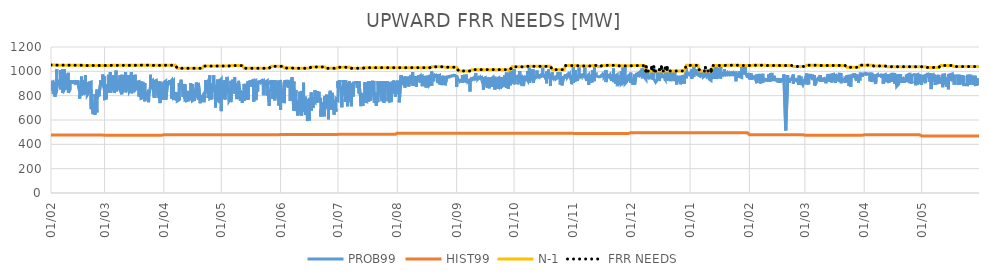
| Category | PROB99 | HIST99 | N-1 | FRR NEEDS |
|---|---|---|---|---|
| 2019-02-01 | 838 | 476 | 1052 | 1052 |
| 2019-02-01 | 840 | 476 | 1052 | 1052 |
| 2019-02-01 | 923 | 476 | 1052 | 1052 |
| 2019-02-01 | 928 | 476 | 1052 | 1052 |
| 2019-02-01 | 905 | 476 | 1052 | 1052 |
| 2019-02-01 | 906 | 476 | 1052 | 1052 |
| 2019-02-02 | 913 | 476 | 1052 | 1052 |
| 2019-02-02 | 920 | 476 | 1052 | 1052 |
| 2019-02-02 | 898 | 476 | 1052 | 1052 |
| 2019-02-02 | 852 | 476 | 1052 | 1052 |
| 2019-02-02 | 827 | 476 | 1052 | 1052 |
| 2019-02-02 | 828 | 476 | 1052 | 1052 |
| 2019-02-03 | 833 | 476 | 1052 | 1052 |
| 2019-02-03 | 827 | 476 | 1052 | 1052 |
| 2019-02-03 | 901 | 476 | 1052 | 1052 |
| 2019-02-03 | 847 | 476 | 1052 | 1052 |
| 2019-02-03 | 913 | 476 | 1052 | 1052 |
| 2019-02-03 | 792 | 476 | 1052 | 1052 |
| 2019-02-04 | 845 | 476 | 1051 | 1051 |
| 2019-02-04 | 975 | 476 | 1051 | 1051 |
| 2019-02-04 | 1017 | 476 | 1051 | 1051 |
| 2019-02-04 | 973 | 476 | 1051 | 1051 |
| 2019-02-04 | 964 | 476 | 1051 | 1051 |
| 2019-02-04 | 908 | 476 | 1051 | 1051 |
| 2019-02-05 | 918 | 476 | 1051 | 1051 |
| 2019-02-05 | 918 | 476 | 1051 | 1051 |
| 2019-02-05 | 926 | 476 | 1051 | 1051 |
| 2019-02-05 | 931 | 476 | 1051 | 1051 |
| 2019-02-05 | 928 | 476 | 1051 | 1051 |
| 2019-02-05 | 910 | 476 | 1051 | 1051 |
| 2019-02-06 | 852 | 476 | 1051 | 1051 |
| 2019-02-06 | 1001 | 476 | 1051 | 1051 |
| 2019-02-06 | 1010 | 476 | 1051 | 1051 |
| 2019-02-06 | 976 | 476 | 1051 | 1051 |
| 2019-02-06 | 929 | 476 | 1051 | 1051 |
| 2019-02-06 | 911 | 476 | 1051 | 1051 |
| 2019-02-07 | 926 | 476 | 1051 | 1051 |
| 2019-02-07 | 1009 | 476 | 1051 | 1051 |
| 2019-02-07 | 1019 | 476 | 1051 | 1051 |
| 2019-02-07 | 1019 | 476 | 1051 | 1051 |
| 2019-02-07 | 944 | 476 | 1051 | 1051 |
| 2019-02-07 | 822 | 476 | 1051 | 1051 |
| 2019-02-08 | 854 | 476 | 1051 | 1051 |
| 2019-02-08 | 964 | 476 | 1051 | 1051 |
| 2019-02-08 | 975 | 476 | 1051 | 1051 |
| 2019-02-08 | 1018 | 476 | 1051 | 1051 |
| 2019-02-08 | 964 | 476 | 1051 | 1051 |
| 2019-02-08 | 970 | 476 | 1051 | 1051 |
| 2019-02-09 | 857 | 476 | 1051 | 1051 |
| 2019-02-09 | 959 | 476 | 1051 | 1051 |
| 2019-02-09 | 978 | 476 | 1051 | 1051 |
| 2019-02-09 | 976 | 476 | 1051 | 1051 |
| 2019-02-09 | 900 | 476 | 1051 | 1051 |
| 2019-02-09 | 860 | 476 | 1051 | 1051 |
| 2019-02-10 | 858 | 476 | 1051 | 1051 |
| 2019-02-10 | 960 | 476 | 1051 | 1051 |
| 2019-02-10 | 988 | 476 | 1051 | 1051 |
| 2019-02-10 | 974 | 476 | 1051 | 1051 |
| 2019-02-10 | 921 | 476 | 1051 | 1051 |
| 2019-02-10 | 824 | 476 | 1051 | 1051 |
| 2019-02-11 | 853 | 476 | 1050 | 1050 |
| 2019-02-11 | 900 | 476 | 1050 | 1050 |
| 2019-02-11 | 927 | 476 | 1050 | 1050 |
| 2019-02-11 | 932 | 476 | 1050 | 1050 |
| 2019-02-11 | 930 | 476 | 1050 | 1050 |
| 2019-02-11 | 907 | 476 | 1050 | 1050 |
| 2019-02-12 | 911 | 476 | 1050 | 1050 |
| 2019-02-12 | 899 | 476 | 1050 | 1050 |
| 2019-02-12 | 925 | 476 | 1050 | 1050 |
| 2019-02-12 | 931 | 476 | 1050 | 1050 |
| 2019-02-12 | 923 | 476 | 1050 | 1050 |
| 2019-02-12 | 908 | 476 | 1050 | 1050 |
| 2019-02-13 | 907 | 476 | 1050 | 1050 |
| 2019-02-13 | 909 | 476 | 1050 | 1050 |
| 2019-02-13 | 923 | 476 | 1050 | 1050 |
| 2019-02-13 | 923 | 476 | 1050 | 1050 |
| 2019-02-13 | 912 | 476 | 1050 | 1050 |
| 2019-02-13 | 908 | 476 | 1050 | 1050 |
| 2019-02-14 | 910 | 476 | 1050 | 1050 |
| 2019-02-14 | 899 | 476 | 1050 | 1050 |
| 2019-02-14 | 920 | 476 | 1050 | 1050 |
| 2019-02-14 | 929 | 476 | 1050 | 1050 |
| 2019-02-14 | 903 | 476 | 1050 | 1050 |
| 2019-02-14 | 907 | 476 | 1050 | 1050 |
| 2019-02-15 | 911 | 476 | 1050 | 1050 |
| 2019-02-15 | 900 | 476 | 1050 | 1050 |
| 2019-02-15 | 925 | 476 | 1050 | 1050 |
| 2019-02-15 | 928 | 476 | 1050 | 1050 |
| 2019-02-15 | 899 | 476 | 1050 | 1050 |
| 2019-02-15 | 909 | 476 | 1050 | 1050 |
| 2019-02-16 | 832 | 476 | 1050 | 1050 |
| 2019-02-16 | 866 | 476 | 1050 | 1050 |
| 2019-02-16 | 834 | 476 | 1050 | 1050 |
| 2019-02-16 | 841 | 476 | 1050 | 1050 |
| 2019-02-16 | 776 | 476 | 1050 | 1050 |
| 2019-02-16 | 803 | 476 | 1050 | 1050 |
| 2019-02-17 | 835 | 476 | 1050 | 1050 |
| 2019-02-17 | 861 | 476 | 1050 | 1050 |
| 2019-02-17 | 958 | 476 | 1050 | 1050 |
| 2019-02-17 | 903 | 476 | 1050 | 1050 |
| 2019-02-17 | 801 | 476 | 1050 | 1050 |
| 2019-02-17 | 811 | 476 | 1050 | 1050 |
| 2019-02-18 | 841 | 476 | 1048 | 1048 |
| 2019-02-18 | 905 | 476 | 1048 | 1048 |
| 2019-02-18 | 912 | 476 | 1048 | 1048 |
| 2019-02-18 | 929 | 476 | 1048 | 1048 |
| 2019-02-18 | 908 | 476 | 1048 | 1048 |
| 2019-02-18 | 808 | 476 | 1048 | 1048 |
| 2019-02-19 | 838 | 476 | 1048 | 1048 |
| 2019-02-19 | 968 | 476 | 1048 | 1048 |
| 2019-02-19 | 972 | 476 | 1048 | 1048 |
| 2019-02-19 | 927 | 476 | 1048 | 1048 |
| 2019-02-19 | 915 | 476 | 1048 | 1048 |
| 2019-02-19 | 911 | 476 | 1048 | 1048 |
| 2019-02-20 | 833 | 476 | 1048 | 1048 |
| 2019-02-20 | 907 | 476 | 1048 | 1048 |
| 2019-02-20 | 910 | 476 | 1048 | 1048 |
| 2019-02-20 | 914 | 476 | 1048 | 1048 |
| 2019-02-20 | 908 | 476 | 1048 | 1048 |
| 2019-02-20 | 806 | 476 | 1048 | 1048 |
| 2019-02-21 | 831 | 476 | 1048 | 1048 |
| 2019-02-21 | 904 | 476 | 1048 | 1048 |
| 2019-02-21 | 913 | 476 | 1048 | 1048 |
| 2019-02-21 | 834 | 476 | 1048 | 1048 |
| 2019-02-21 | 906 | 476 | 1048 | 1048 |
| 2019-02-21 | 910 | 476 | 1048 | 1048 |
| 2019-02-22 | 912 | 476 | 1048 | 1048 |
| 2019-02-22 | 831 | 476 | 1048 | 1048 |
| 2019-02-22 | 847 | 476 | 1048 | 1048 |
| 2019-02-22 | 713 | 476 | 1048 | 1048 |
| 2019-02-22 | 689 | 476 | 1048 | 1048 |
| 2019-02-22 | 806 | 476 | 1048 | 1048 |
| 2019-02-23 | 664 | 476 | 1048 | 1048 |
| 2019-02-23 | 648 | 476 | 1048 | 1048 |
| 2019-02-23 | 733 | 476 | 1048 | 1048 |
| 2019-02-23 | 712 | 476 | 1048 | 1048 |
| 2019-02-23 | 687 | 476 | 1048 | 1048 |
| 2019-02-23 | 673 | 476 | 1048 | 1048 |
| 2019-02-24 | 669 | 476 | 1048 | 1048 |
| 2019-02-24 | 644 | 476 | 1048 | 1048 |
| 2019-02-24 | 695 | 476 | 1048 | 1048 |
| 2019-02-24 | 714 | 476 | 1048 | 1048 |
| 2019-02-24 | 683 | 476 | 1048 | 1048 |
| 2019-02-24 | 813 | 476 | 1048 | 1048 |
| 2019-02-25 | 663 | 476 | 1048 | 1048 |
| 2019-02-25 | 837 | 476 | 1048 | 1048 |
| 2019-02-25 | 831 | 476 | 1048 | 1048 |
| 2019-02-25 | 850 | 476 | 1048 | 1048 |
| 2019-02-25 | 776 | 476 | 1048 | 1048 |
| 2019-02-25 | 798 | 476 | 1048 | 1048 |
| 2019-02-26 | 803 | 476 | 1048 | 1048 |
| 2019-02-26 | 835 | 476 | 1048 | 1048 |
| 2019-02-26 | 835 | 476 | 1048 | 1048 |
| 2019-02-26 | 846 | 476 | 1048 | 1048 |
| 2019-02-26 | 796 | 476 | 1048 | 1048 |
| 2019-02-26 | 803 | 476 | 1048 | 1048 |
| 2019-02-27 | 914 | 476 | 1048 | 1048 |
| 2019-02-27 | 921 | 476 | 1048 | 1048 |
| 2019-02-27 | 926 | 476 | 1048 | 1048 |
| 2019-02-27 | 928 | 476 | 1048 | 1048 |
| 2019-02-27 | 915 | 476 | 1048 | 1048 |
| 2019-02-27 | 912 | 476 | 1048 | 1048 |
| 2019-02-28 | 919 | 476 | 1048 | 1048 |
| 2019-02-28 | 907 | 476 | 1048 | 1048 |
| 2019-02-28 | 973 | 476 | 1048 | 1048 |
| 2019-02-28 | 974 | 476 | 1048 | 1048 |
| 2019-02-28 | 905 | 476 | 1048 | 1048 |
| 2019-02-28 | 910 | 476 | 1048 | 1048 |
| 2019-03-01 | 840 | 475 | 1048 | 1048 |
| 2019-03-01 | 906 | 475 | 1048 | 1048 |
| 2019-03-01 | 961 | 475 | 1048 | 1048 |
| 2019-03-01 | 926 | 475 | 1048 | 1048 |
| 2019-03-01 | 914 | 475 | 1048 | 1048 |
| 2019-03-01 | 774 | 475 | 1048 | 1048 |
| 2019-03-02 | 779 | 475 | 1048 | 1048 |
| 2019-03-02 | 776 | 475 | 1048 | 1048 |
| 2019-03-02 | 895 | 475 | 1048 | 1048 |
| 2019-03-02 | 855 | 475 | 1048 | 1048 |
| 2019-03-02 | 844 | 475 | 1048 | 1048 |
| 2019-03-02 | 831 | 475 | 1048 | 1048 |
| 2019-03-03 | 869 | 475 | 1048 | 1048 |
| 2019-03-03 | 912 | 475 | 1048 | 1048 |
| 2019-03-03 | 972 | 475 | 1048 | 1048 |
| 2019-03-03 | 968 | 475 | 1048 | 1048 |
| 2019-03-03 | 890 | 475 | 1048 | 1048 |
| 2019-03-03 | 826 | 475 | 1048 | 1048 |
| 2019-03-04 | 864 | 475 | 1049 | 1049 |
| 2019-03-04 | 994 | 475 | 1049 | 1049 |
| 2019-03-04 | 968 | 475 | 1049 | 1049 |
| 2019-03-04 | 968 | 475 | 1049 | 1049 |
| 2019-03-04 | 871 | 475 | 1049 | 1049 |
| 2019-03-04 | 826 | 475 | 1049 | 1049 |
| 2019-03-05 | 865 | 475 | 1049 | 1049 |
| 2019-03-05 | 966 | 475 | 1049 | 1049 |
| 2019-03-05 | 970 | 475 | 1049 | 1049 |
| 2019-03-05 | 970 | 475 | 1049 | 1049 |
| 2019-03-05 | 918 | 475 | 1049 | 1049 |
| 2019-03-05 | 914 | 475 | 1049 | 1049 |
| 2019-03-06 | 870 | 475 | 1049 | 1049 |
| 2019-03-06 | 967 | 475 | 1049 | 1049 |
| 2019-03-06 | 967 | 475 | 1049 | 1049 |
| 2019-03-06 | 911 | 475 | 1049 | 1049 |
| 2019-03-06 | 878 | 475 | 1049 | 1049 |
| 2019-03-06 | 823 | 475 | 1049 | 1049 |
| 2019-03-07 | 871 | 475 | 1049 | 1049 |
| 2019-03-07 | 1006 | 475 | 1049 | 1049 |
| 2019-03-07 | 1006 | 475 | 1049 | 1049 |
| 2019-03-07 | 913 | 475 | 1049 | 1049 |
| 2019-03-07 | 893 | 475 | 1049 | 1049 |
| 2019-03-07 | 837 | 475 | 1049 | 1049 |
| 2019-03-08 | 867 | 475 | 1049 | 1049 |
| 2019-03-08 | 932 | 475 | 1049 | 1049 |
| 2019-03-08 | 909 | 475 | 1049 | 1049 |
| 2019-03-08 | 914 | 475 | 1049 | 1049 |
| 2019-03-08 | 853 | 475 | 1049 | 1049 |
| 2019-03-08 | 862 | 475 | 1049 | 1049 |
| 2019-03-09 | 866 | 475 | 1049 | 1049 |
| 2019-03-09 | 953 | 475 | 1049 | 1049 |
| 2019-03-09 | 967 | 475 | 1049 | 1049 |
| 2019-03-09 | 966 | 475 | 1049 | 1049 |
| 2019-03-09 | 849 | 475 | 1049 | 1049 |
| 2019-03-09 | 846 | 475 | 1049 | 1049 |
| 2019-03-10 | 811 | 475 | 1049 | 1049 |
| 2019-03-10 | 909 | 475 | 1049 | 1049 |
| 2019-03-10 | 972 | 475 | 1049 | 1049 |
| 2019-03-10 | 967 | 475 | 1049 | 1049 |
| 2019-03-10 | 910 | 475 | 1049 | 1049 |
| 2019-03-10 | 823 | 475 | 1049 | 1049 |
| 2019-03-11 | 870 | 475 | 1049 | 1049 |
| 2019-03-11 | 967 | 475 | 1049 | 1049 |
| 2019-03-11 | 969 | 475 | 1049 | 1049 |
| 2019-03-11 | 970 | 475 | 1049 | 1049 |
| 2019-03-11 | 916 | 475 | 1049 | 1049 |
| 2019-03-11 | 909 | 475 | 1049 | 1049 |
| 2019-03-12 | 909 | 475 | 1049 | 1049 |
| 2019-03-12 | 993 | 475 | 1049 | 1049 |
| 2019-03-12 | 967 | 475 | 1049 | 1049 |
| 2019-03-12 | 966 | 475 | 1049 | 1049 |
| 2019-03-12 | 907 | 475 | 1049 | 1049 |
| 2019-03-12 | 827 | 475 | 1049 | 1049 |
| 2019-03-13 | 877 | 475 | 1049 | 1049 |
| 2019-03-13 | 968 | 475 | 1049 | 1049 |
| 2019-03-13 | 967 | 475 | 1049 | 1049 |
| 2019-03-13 | 966 | 475 | 1049 | 1049 |
| 2019-03-13 | 895 | 475 | 1049 | 1049 |
| 2019-03-13 | 916 | 475 | 1049 | 1049 |
| 2019-03-14 | 874 | 475 | 1049 | 1049 |
| 2019-03-14 | 969 | 475 | 1049 | 1049 |
| 2019-03-14 | 969 | 475 | 1049 | 1049 |
| 2019-03-14 | 966 | 475 | 1049 | 1049 |
| 2019-03-14 | 890 | 475 | 1049 | 1049 |
| 2019-03-14 | 835 | 475 | 1049 | 1049 |
| 2019-03-15 | 861 | 475 | 1049 | 1049 |
| 2019-03-15 | 992 | 475 | 1049 | 1049 |
| 2019-03-15 | 967 | 475 | 1049 | 1049 |
| 2019-03-15 | 966 | 475 | 1049 | 1049 |
| 2019-03-15 | 894 | 475 | 1049 | 1049 |
| 2019-03-15 | 820 | 475 | 1049 | 1049 |
| 2019-03-16 | 855 | 475 | 1049 | 1049 |
| 2019-03-16 | 968 | 475 | 1049 | 1049 |
| 2019-03-16 | 970 | 475 | 1049 | 1049 |
| 2019-03-16 | 968 | 475 | 1049 | 1049 |
| 2019-03-16 | 897 | 475 | 1049 | 1049 |
| 2019-03-16 | 852 | 475 | 1049 | 1049 |
| 2019-03-17 | 872 | 475 | 1049 | 1049 |
| 2019-03-17 | 925 | 475 | 1049 | 1049 |
| 2019-03-17 | 972 | 475 | 1049 | 1049 |
| 2019-03-17 | 951 | 475 | 1049 | 1049 |
| 2019-03-17 | 859 | 475 | 1049 | 1049 |
| 2019-03-17 | 847 | 475 | 1049 | 1049 |
| 2019-03-18 | 865 | 475 | 1051 | 1051 |
| 2019-03-18 | 907 | 475 | 1051 | 1051 |
| 2019-03-18 | 915 | 475 | 1051 | 1051 |
| 2019-03-18 | 849 | 475 | 1051 | 1051 |
| 2019-03-18 | 890 | 475 | 1051 | 1051 |
| 2019-03-18 | 912 | 475 | 1051 | 1051 |
| 2019-03-19 | 916 | 475 | 1051 | 1051 |
| 2019-03-19 | 917 | 475 | 1051 | 1051 |
| 2019-03-19 | 913 | 475 | 1051 | 1051 |
| 2019-03-19 | 837 | 475 | 1051 | 1051 |
| 2019-03-19 | 793 | 475 | 1051 | 1051 |
| 2019-03-19 | 914 | 475 | 1051 | 1051 |
| 2019-03-20 | 788 | 475 | 1051 | 1051 |
| 2019-03-20 | 917 | 475 | 1051 | 1051 |
| 2019-03-20 | 835 | 475 | 1051 | 1051 |
| 2019-03-20 | 834 | 475 | 1051 | 1051 |
| 2019-03-20 | 777 | 475 | 1051 | 1051 |
| 2019-03-20 | 784 | 475 | 1051 | 1051 |
| 2019-03-21 | 783 | 475 | 1051 | 1051 |
| 2019-03-21 | 905 | 475 | 1051 | 1051 |
| 2019-03-21 | 841 | 475 | 1051 | 1051 |
| 2019-03-21 | 839 | 475 | 1051 | 1051 |
| 2019-03-21 | 876 | 475 | 1051 | 1051 |
| 2019-03-21 | 913 | 475 | 1051 | 1051 |
| 2019-03-22 | 781 | 475 | 1051 | 1051 |
| 2019-03-22 | 904 | 475 | 1051 | 1051 |
| 2019-03-22 | 827 | 475 | 1051 | 1051 |
| 2019-03-22 | 837 | 475 | 1051 | 1051 |
| 2019-03-22 | 754 | 475 | 1051 | 1051 |
| 2019-03-22 | 785 | 475 | 1051 | 1051 |
| 2019-03-23 | 783 | 475 | 1051 | 1051 |
| 2019-03-23 | 769 | 475 | 1051 | 1051 |
| 2019-03-23 | 826 | 475 | 1051 | 1051 |
| 2019-03-23 | 822 | 475 | 1051 | 1051 |
| 2019-03-23 | 768 | 475 | 1051 | 1051 |
| 2019-03-23 | 780 | 475 | 1051 | 1051 |
| 2019-03-24 | 786 | 475 | 1051 | 1051 |
| 2019-03-24 | 746 | 475 | 1051 | 1051 |
| 2019-03-24 | 801 | 475 | 1051 | 1051 |
| 2019-03-24 | 849 | 475 | 1051 | 1051 |
| 2019-03-24 | 766 | 475 | 1051 | 1051 |
| 2019-03-24 | 786 | 475 | 1051 | 1051 |
| 2019-03-25 | 874 | 475 | 1049 | 1049 |
| 2019-03-25 | 947 | 475 | 1049 | 1049 |
| 2019-03-25 | 972 | 475 | 1049 | 1049 |
| 2019-03-25 | 954 | 475 | 1049 | 1049 |
| 2019-03-25 | 855 | 475 | 1049 | 1049 |
| 2019-03-25 | 911 | 475 | 1049 | 1049 |
| 2019-03-26 | 924 | 475 | 1049 | 1049 |
| 2019-03-26 | 923 | 475 | 1049 | 1049 |
| 2019-03-26 | 906 | 475 | 1049 | 1049 |
| 2019-03-26 | 919 | 475 | 1049 | 1049 |
| 2019-03-26 | 916 | 475 | 1049 | 1049 |
| 2019-03-26 | 913 | 475 | 1049 | 1049 |
| 2019-03-27 | 783 | 475 | 1049 | 1049 |
| 2019-03-27 | 917 | 475 | 1049 | 1049 |
| 2019-03-27 | 911 | 475 | 1049 | 1049 |
| 2019-03-27 | 923 | 475 | 1049 | 1049 |
| 2019-03-27 | 915 | 475 | 1049 | 1049 |
| 2019-03-27 | 912 | 475 | 1049 | 1049 |
| 2019-03-28 | 925 | 475 | 1049 | 1049 |
| 2019-03-28 | 923 | 475 | 1049 | 1049 |
| 2019-03-28 | 910 | 475 | 1049 | 1049 |
| 2019-03-28 | 924 | 475 | 1049 | 1049 |
| 2019-03-28 | 913 | 475 | 1049 | 1049 |
| 2019-03-28 | 913 | 475 | 1049 | 1049 |
| 2019-03-29 | 782 | 475 | 1049 | 1049 |
| 2019-03-29 | 917 | 475 | 1049 | 1049 |
| 2019-03-29 | 841 | 475 | 1049 | 1049 |
| 2019-03-29 | 840 | 475 | 1049 | 1049 |
| 2019-03-29 | 873 | 475 | 1049 | 1049 |
| 2019-03-29 | 913 | 475 | 1049 | 1049 |
| 2019-03-30 | 777 | 475 | 1049 | 1049 |
| 2019-03-30 | 767 | 475 | 1049 | 1049 |
| 2019-03-30 | 826 | 475 | 1049 | 1049 |
| 2019-03-30 | 823 | 475 | 1049 | 1049 |
| 2019-03-30 | 739 | 475 | 1049 | 1049 |
| 2019-03-30 | 915 | 475 | 1049 | 1049 |
| 2019-03-31 | 768 | 475 | 1049 | 1049 |
| 2019-03-31 | 847 | 475 | 1049 | 1049 |
| 2019-03-31 | 843 | 475 | 1049 | 1049 |
| 2019-03-31 | 847 | 475 | 1049 | 1049 |
| 2019-03-31 | 852 | 475 | 1049 | 1049 |
| 2019-03-31 | 834 | 475 | 1049 | 1049 |
| 2019-04-01 | 872 | 479 | 1050 | 1050 |
| 2019-04-01 | 906 | 479 | 1050 | 1050 |
| 2019-04-01 | 901 | 479 | 1050 | 1050 |
| 2019-04-01 | 834 | 479 | 1050 | 1050 |
| 2019-04-01 | 769 | 479 | 1050 | 1050 |
| 2019-04-01 | 910 | 479 | 1050 | 1050 |
| 2019-04-02 | 921 | 479 | 1050 | 1050 |
| 2019-04-02 | 919 | 479 | 1050 | 1050 |
| 2019-04-02 | 905 | 479 | 1050 | 1050 |
| 2019-04-02 | 852 | 479 | 1050 | 1050 |
| 2019-04-02 | 912 | 479 | 1050 | 1050 |
| 2019-04-02 | 768 | 479 | 1050 | 1050 |
| 2019-04-03 | 914 | 479 | 1050 | 1050 |
| 2019-04-03 | 916 | 479 | 1050 | 1050 |
| 2019-04-03 | 904 | 479 | 1050 | 1050 |
| 2019-04-03 | 918 | 479 | 1050 | 1050 |
| 2019-04-03 | 915 | 479 | 1050 | 1050 |
| 2019-04-03 | 906 | 479 | 1050 | 1050 |
| 2019-04-04 | 913 | 479 | 1050 | 1050 |
| 2019-04-04 | 916 | 479 | 1050 | 1050 |
| 2019-04-04 | 899 | 479 | 1050 | 1050 |
| 2019-04-04 | 929 | 479 | 1050 | 1050 |
| 2019-04-04 | 921 | 479 | 1050 | 1050 |
| 2019-04-04 | 905 | 479 | 1050 | 1050 |
| 2019-04-05 | 925 | 479 | 1050 | 1050 |
| 2019-04-05 | 923 | 479 | 1050 | 1050 |
| 2019-04-05 | 907 | 479 | 1050 | 1050 |
| 2019-04-05 | 851 | 479 | 1050 | 1050 |
| 2019-04-05 | 775 | 479 | 1050 | 1050 |
| 2019-04-05 | 910 | 479 | 1050 | 1050 |
| 2019-04-06 | 925 | 479 | 1050 | 1050 |
| 2019-04-06 | 927 | 479 | 1050 | 1050 |
| 2019-04-06 | 808 | 479 | 1050 | 1050 |
| 2019-04-06 | 833 | 479 | 1050 | 1050 |
| 2019-04-06 | 778 | 479 | 1050 | 1050 |
| 2019-04-06 | 783 | 479 | 1050 | 1050 |
| 2019-04-07 | 786 | 479 | 1050 | 1050 |
| 2019-04-07 | 768 | 479 | 1050 | 1050 |
| 2019-04-07 | 789 | 479 | 1050 | 1050 |
| 2019-04-07 | 831 | 479 | 1050 | 1050 |
| 2019-04-07 | 773 | 479 | 1050 | 1050 |
| 2019-04-07 | 773 | 479 | 1050 | 1050 |
| 2019-04-08 | 765 | 479 | 1025 | 1025 |
| 2019-04-08 | 780 | 479 | 1025 | 1025 |
| 2019-04-08 | 804 | 479 | 1025 | 1025 |
| 2019-04-08 | 828 | 479 | 1025 | 1025 |
| 2019-04-08 | 757 | 479 | 1025 | 1025 |
| 2019-04-08 | 757 | 479 | 1025 | 1025 |
| 2019-04-09 | 767 | 479 | 1025 | 1025 |
| 2019-04-09 | 789 | 479 | 1025 | 1025 |
| 2019-04-09 | 788 | 479 | 1025 | 1025 |
| 2019-04-09 | 797 | 479 | 1025 | 1025 |
| 2019-04-09 | 764 | 479 | 1025 | 1025 |
| 2019-04-09 | 903 | 479 | 1025 | 1025 |
| 2019-04-10 | 853 | 479 | 1025 | 1025 |
| 2019-04-10 | 913 | 479 | 1025 | 1025 |
| 2019-04-10 | 931 | 479 | 1025 | 1025 |
| 2019-04-10 | 927 | 479 | 1025 | 1025 |
| 2019-04-10 | 870 | 479 | 1025 | 1025 |
| 2019-04-10 | 905 | 479 | 1025 | 1025 |
| 2019-04-11 | 834 | 479 | 1025 | 1025 |
| 2019-04-11 | 890 | 479 | 1025 | 1025 |
| 2019-04-11 | 884 | 479 | 1025 | 1025 |
| 2019-04-11 | 808 | 479 | 1025 | 1025 |
| 2019-04-11 | 790 | 479 | 1025 | 1025 |
| 2019-04-11 | 896 | 479 | 1025 | 1025 |
| 2019-04-12 | 774 | 479 | 1025 | 1025 |
| 2019-04-12 | 893 | 479 | 1025 | 1025 |
| 2019-04-12 | 830 | 479 | 1025 | 1025 |
| 2019-04-12 | 838 | 479 | 1025 | 1025 |
| 2019-04-12 | 812 | 479 | 1025 | 1025 |
| 2019-04-12 | 763 | 479 | 1025 | 1025 |
| 2019-04-13 | 767 | 479 | 1025 | 1025 |
| 2019-04-13 | 755 | 479 | 1025 | 1025 |
| 2019-04-13 | 803 | 479 | 1025 | 1025 |
| 2019-04-13 | 840 | 479 | 1025 | 1025 |
| 2019-04-13 | 770 | 479 | 1025 | 1025 |
| 2019-04-13 | 761 | 479 | 1025 | 1025 |
| 2019-04-14 | 772 | 479 | 1025 | 1025 |
| 2019-04-14 | 754 | 479 | 1025 | 1025 |
| 2019-04-14 | 796 | 479 | 1025 | 1025 |
| 2019-04-14 | 837 | 479 | 1025 | 1025 |
| 2019-04-14 | 783 | 479 | 1025 | 1025 |
| 2019-04-14 | 771 | 479 | 1025 | 1025 |
| 2019-04-15 | 776 | 479 | 1025 | 1025 |
| 2019-04-15 | 904 | 479 | 1025 | 1025 |
| 2019-04-15 | 895 | 479 | 1025 | 1025 |
| 2019-04-15 | 837 | 479 | 1025 | 1025 |
| 2019-04-15 | 774 | 479 | 1025 | 1025 |
| 2019-04-15 | 810 | 479 | 1025 | 1025 |
| 2019-04-16 | 842 | 479 | 1025 | 1025 |
| 2019-04-16 | 894 | 479 | 1025 | 1025 |
| 2019-04-16 | 893 | 479 | 1025 | 1025 |
| 2019-04-16 | 832 | 479 | 1025 | 1025 |
| 2019-04-16 | 759 | 479 | 1025 | 1025 |
| 2019-04-16 | 761 | 479 | 1025 | 1025 |
| 2019-04-17 | 770 | 479 | 1025 | 1025 |
| 2019-04-17 | 759 | 479 | 1025 | 1025 |
| 2019-04-17 | 814 | 479 | 1025 | 1025 |
| 2019-04-17 | 819 | 479 | 1025 | 1025 |
| 2019-04-17 | 760 | 479 | 1025 | 1025 |
| 2019-04-17 | 770 | 479 | 1025 | 1025 |
| 2019-04-18 | 908 | 479 | 1025 | 1025 |
| 2019-04-18 | 810 | 479 | 1025 | 1025 |
| 2019-04-18 | 809 | 479 | 1025 | 1025 |
| 2019-04-18 | 844 | 479 | 1025 | 1025 |
| 2019-04-18 | 833 | 479 | 1025 | 1025 |
| 2019-04-18 | 804 | 479 | 1025 | 1025 |
| 2019-04-19 | 829 | 479 | 1025 | 1025 |
| 2019-04-19 | 886 | 479 | 1025 | 1025 |
| 2019-04-19 | 805 | 479 | 1025 | 1025 |
| 2019-04-19 | 808 | 479 | 1025 | 1025 |
| 2019-04-19 | 767 | 479 | 1025 | 1025 |
| 2019-04-19 | 905 | 479 | 1025 | 1025 |
| 2019-04-20 | 765 | 479 | 1025 | 1025 |
| 2019-04-20 | 738 | 479 | 1025 | 1025 |
| 2019-04-20 | 802 | 479 | 1025 | 1025 |
| 2019-04-20 | 807 | 479 | 1025 | 1025 |
| 2019-04-20 | 761 | 479 | 1025 | 1025 |
| 2019-04-20 | 764 | 479 | 1025 | 1025 |
| 2019-04-21 | 772 | 479 | 1025 | 1025 |
| 2019-04-21 | 762 | 479 | 1025 | 1025 |
| 2019-04-21 | 804 | 479 | 1025 | 1025 |
| 2019-04-21 | 807 | 479 | 1025 | 1025 |
| 2019-04-21 | 764 | 479 | 1025 | 1025 |
| 2019-04-21 | 765 | 479 | 1025 | 1025 |
| 2019-04-22 | 777 | 479 | 1043 | 1043 |
| 2019-04-22 | 746 | 479 | 1043 | 1043 |
| 2019-04-22 | 790 | 479 | 1043 | 1043 |
| 2019-04-22 | 823 | 479 | 1043 | 1043 |
| 2019-04-22 | 772 | 479 | 1043 | 1043 |
| 2019-04-22 | 813 | 479 | 1043 | 1043 |
| 2019-04-23 | 852 | 479 | 1043 | 1043 |
| 2019-04-23 | 896 | 479 | 1043 | 1043 |
| 2019-04-23 | 818 | 479 | 1043 | 1043 |
| 2019-04-23 | 928 | 479 | 1043 | 1043 |
| 2019-04-23 | 891 | 479 | 1043 | 1043 |
| 2019-04-23 | 884 | 479 | 1043 | 1043 |
| 2019-04-24 | 918 | 479 | 1043 | 1043 |
| 2019-04-24 | 904 | 479 | 1043 | 1043 |
| 2019-04-24 | 858 | 479 | 1043 | 1043 |
| 2019-04-24 | 862 | 479 | 1043 | 1043 |
| 2019-04-24 | 851 | 479 | 1043 | 1043 |
| 2019-04-24 | 780 | 479 | 1043 | 1043 |
| 2019-04-25 | 848 | 479 | 1043 | 1043 |
| 2019-04-25 | 909 | 479 | 1043 | 1043 |
| 2019-04-25 | 967 | 479 | 1043 | 1043 |
| 2019-04-25 | 940 | 479 | 1043 | 1043 |
| 2019-04-25 | 929 | 479 | 1043 | 1043 |
| 2019-04-25 | 775 | 479 | 1043 | 1043 |
| 2019-04-26 | 784 | 479 | 1043 | 1043 |
| 2019-04-26 | 903 | 479 | 1043 | 1043 |
| 2019-04-26 | 828 | 479 | 1043 | 1043 |
| 2019-04-26 | 835 | 479 | 1043 | 1043 |
| 2019-04-26 | 770 | 479 | 1043 | 1043 |
| 2019-04-26 | 815 | 479 | 1043 | 1043 |
| 2019-04-27 | 870 | 479 | 1043 | 1043 |
| 2019-04-27 | 877 | 479 | 1043 | 1043 |
| 2019-04-27 | 967 | 479 | 1043 | 1043 |
| 2019-04-27 | 966 | 479 | 1043 | 1043 |
| 2019-04-27 | 898 | 479 | 1043 | 1043 |
| 2019-04-27 | 863 | 479 | 1043 | 1043 |
| 2019-04-28 | 874 | 479 | 1043 | 1043 |
| 2019-04-28 | 873 | 479 | 1043 | 1043 |
| 2019-04-28 | 781 | 479 | 1043 | 1043 |
| 2019-04-28 | 778 | 479 | 1043 | 1043 |
| 2019-04-28 | 703 | 479 | 1043 | 1043 |
| 2019-04-28 | 784 | 479 | 1043 | 1043 |
| 2019-04-29 | 932 | 479 | 1044 | 1044 |
| 2019-04-29 | 930 | 479 | 1044 | 1044 |
| 2019-04-29 | 908 | 479 | 1044 | 1044 |
| 2019-04-29 | 848 | 479 | 1044 | 1044 |
| 2019-04-29 | 753 | 479 | 1044 | 1044 |
| 2019-04-29 | 913 | 479 | 1044 | 1044 |
| 2019-04-30 | 924 | 479 | 1044 | 1044 |
| 2019-04-30 | 902 | 479 | 1044 | 1044 |
| 2019-04-30 | 763 | 479 | 1044 | 1044 |
| 2019-04-30 | 900 | 479 | 1044 | 1044 |
| 2019-04-30 | 739 | 479 | 1044 | 1044 |
| 2019-04-30 | 911 | 479 | 1044 | 1044 |
| 2019-05-01 | 934 | 479 | 1044 | 1044 |
| 2019-05-01 | 931 | 479 | 1044 | 1044 |
| 2019-05-01 | 697 | 479 | 1044 | 1044 |
| 2019-05-01 | 709 | 479 | 1044 | 1044 |
| 2019-05-01 | 673 | 479 | 1044 | 1044 |
| 2019-05-01 | 924 | 479 | 1044 | 1044 |
| 2019-05-02 | 779 | 479 | 1044 | 1044 |
| 2019-05-02 | 900 | 479 | 1044 | 1044 |
| 2019-05-02 | 795 | 479 | 1044 | 1044 |
| 2019-05-02 | 923 | 479 | 1044 | 1044 |
| 2019-05-02 | 919 | 479 | 1044 | 1044 |
| 2019-05-02 | 923 | 479 | 1044 | 1044 |
| 2019-05-03 | 769 | 479 | 1044 | 1044 |
| 2019-05-03 | 925 | 479 | 1044 | 1044 |
| 2019-05-03 | 873 | 479 | 1044 | 1044 |
| 2019-05-03 | 904 | 479 | 1044 | 1044 |
| 2019-05-03 | 901 | 479 | 1044 | 1044 |
| 2019-05-03 | 909 | 479 | 1044 | 1044 |
| 2019-05-04 | 926 | 479 | 1044 | 1044 |
| 2019-05-04 | 853 | 479 | 1044 | 1044 |
| 2019-05-04 | 954 | 479 | 1044 | 1044 |
| 2019-05-04 | 961 | 479 | 1044 | 1044 |
| 2019-05-04 | 920 | 479 | 1044 | 1044 |
| 2019-05-04 | 829 | 479 | 1044 | 1044 |
| 2019-05-05 | 856 | 479 | 1044 | 1044 |
| 2019-05-05 | 854 | 479 | 1044 | 1044 |
| 2019-05-05 | 843 | 479 | 1044 | 1044 |
| 2019-05-05 | 859 | 479 | 1044 | 1044 |
| 2019-05-05 | 852 | 479 | 1044 | 1044 |
| 2019-05-05 | 755 | 479 | 1044 | 1044 |
| 2019-05-06 | 779 | 479 | 1047 | 1047 |
| 2019-05-06 | 922 | 479 | 1047 | 1047 |
| 2019-05-06 | 893 | 479 | 1047 | 1047 |
| 2019-05-06 | 847 | 479 | 1047 | 1047 |
| 2019-05-06 | 807 | 479 | 1047 | 1047 |
| 2019-05-06 | 747 | 479 | 1047 | 1047 |
| 2019-05-07 | 931 | 479 | 1047 | 1047 |
| 2019-05-07 | 930 | 479 | 1047 | 1047 |
| 2019-05-07 | 912 | 479 | 1047 | 1047 |
| 2019-05-07 | 928 | 479 | 1047 | 1047 |
| 2019-05-07 | 900 | 479 | 1047 | 1047 |
| 2019-05-07 | 910 | 479 | 1047 | 1047 |
| 2019-05-08 | 851 | 479 | 1047 | 1047 |
| 2019-05-08 | 887 | 479 | 1047 | 1047 |
| 2019-05-08 | 943 | 479 | 1047 | 1047 |
| 2019-05-08 | 952 | 479 | 1047 | 1047 |
| 2019-05-08 | 876 | 479 | 1047 | 1047 |
| 2019-05-08 | 816 | 479 | 1047 | 1047 |
| 2019-05-09 | 869 | 479 | 1047 | 1047 |
| 2019-05-09 | 902 | 479 | 1047 | 1047 |
| 2019-05-09 | 884 | 479 | 1047 | 1047 |
| 2019-05-09 | 853 | 479 | 1047 | 1047 |
| 2019-05-09 | 824 | 479 | 1047 | 1047 |
| 2019-05-09 | 782 | 479 | 1047 | 1047 |
| 2019-05-10 | 781 | 479 | 1047 | 1047 |
| 2019-05-10 | 888 | 479 | 1047 | 1047 |
| 2019-05-10 | 878 | 479 | 1047 | 1047 |
| 2019-05-10 | 904 | 479 | 1047 | 1047 |
| 2019-05-10 | 902 | 479 | 1047 | 1047 |
| 2019-05-10 | 922 | 479 | 1047 | 1047 |
| 2019-05-11 | 781 | 479 | 1047 | 1047 |
| 2019-05-11 | 758 | 479 | 1047 | 1047 |
| 2019-05-11 | 819 | 479 | 1047 | 1047 |
| 2019-05-11 | 844 | 479 | 1047 | 1047 |
| 2019-05-11 | 842 | 479 | 1047 | 1047 |
| 2019-05-11 | 790 | 479 | 1047 | 1047 |
| 2019-05-12 | 788 | 479 | 1047 | 1047 |
| 2019-05-12 | 740 | 479 | 1047 | 1047 |
| 2019-05-12 | 826 | 479 | 1047 | 1047 |
| 2019-05-12 | 836 | 479 | 1047 | 1047 |
| 2019-05-12 | 781 | 479 | 1047 | 1047 |
| 2019-05-12 | 786 | 479 | 1047 | 1047 |
| 2019-05-13 | 778 | 479 | 1025 | 1025 |
| 2019-05-13 | 893 | 479 | 1025 | 1025 |
| 2019-05-13 | 817 | 479 | 1025 | 1025 |
| 2019-05-13 | 826 | 479 | 1025 | 1025 |
| 2019-05-13 | 759 | 479 | 1025 | 1025 |
| 2019-05-13 | 897 | 479 | 1025 | 1025 |
| 2019-05-14 | 776 | 479 | 1025 | 1025 |
| 2019-05-14 | 893 | 479 | 1025 | 1025 |
| 2019-05-14 | 791 | 479 | 1025 | 1025 |
| 2019-05-14 | 829 | 479 | 1025 | 1025 |
| 2019-05-14 | 767 | 479 | 1025 | 1025 |
| 2019-05-14 | 802 | 479 | 1025 | 1025 |
| 2019-05-15 | 774 | 479 | 1025 | 1025 |
| 2019-05-15 | 918 | 479 | 1025 | 1025 |
| 2019-05-15 | 817 | 479 | 1025 | 1025 |
| 2019-05-15 | 825 | 479 | 1025 | 1025 |
| 2019-05-15 | 766 | 479 | 1025 | 1025 |
| 2019-05-15 | 906 | 479 | 1025 | 1025 |
| 2019-05-16 | 915 | 479 | 1025 | 1025 |
| 2019-05-16 | 918 | 479 | 1025 | 1025 |
| 2019-05-16 | 920 | 479 | 1025 | 1025 |
| 2019-05-16 | 925 | 479 | 1025 | 1025 |
| 2019-05-16 | 883 | 479 | 1025 | 1025 |
| 2019-05-16 | 909 | 479 | 1025 | 1025 |
| 2019-05-17 | 920 | 479 | 1025 | 1025 |
| 2019-05-17 | 920 | 479 | 1025 | 1025 |
| 2019-05-17 | 872 | 479 | 1025 | 1025 |
| 2019-05-17 | 890 | 479 | 1025 | 1025 |
| 2019-05-17 | 885 | 479 | 1025 | 1025 |
| 2019-05-17 | 911 | 479 | 1025 | 1025 |
| 2019-05-18 | 922 | 479 | 1025 | 1025 |
| 2019-05-18 | 922 | 479 | 1025 | 1025 |
| 2019-05-18 | 813 | 479 | 1025 | 1025 |
| 2019-05-18 | 823 | 479 | 1025 | 1025 |
| 2019-05-18 | 752 | 479 | 1025 | 1025 |
| 2019-05-18 | 911 | 479 | 1025 | 1025 |
| 2019-05-19 | 922 | 479 | 1025 | 1025 |
| 2019-05-19 | 922 | 479 | 1025 | 1025 |
| 2019-05-19 | 767 | 479 | 1025 | 1025 |
| 2019-05-19 | 814 | 479 | 1025 | 1025 |
| 2019-05-19 | 764 | 479 | 1025 | 1025 |
| 2019-05-19 | 763 | 479 | 1025 | 1025 |
| 2019-05-20 | 919 | 479 | 1025 | 1025 |
| 2019-05-20 | 919 | 479 | 1025 | 1025 |
| 2019-05-20 | 879 | 479 | 1025 | 1025 |
| 2019-05-20 | 834 | 479 | 1025 | 1025 |
| 2019-05-20 | 875 | 479 | 1025 | 1025 |
| 2019-05-20 | 911 | 479 | 1025 | 1025 |
| 2019-05-21 | 915 | 479 | 1025 | 1025 |
| 2019-05-21 | 919 | 479 | 1025 | 1025 |
| 2019-05-21 | 897 | 479 | 1025 | 1025 |
| 2019-05-21 | 922 | 479 | 1025 | 1025 |
| 2019-05-21 | 919 | 479 | 1025 | 1025 |
| 2019-05-21 | 911 | 479 | 1025 | 1025 |
| 2019-05-22 | 922 | 479 | 1025 | 1025 |
| 2019-05-22 | 920 | 479 | 1025 | 1025 |
| 2019-05-22 | 918 | 479 | 1025 | 1025 |
| 2019-05-22 | 922 | 479 | 1025 | 1025 |
| 2019-05-22 | 918 | 479 | 1025 | 1025 |
| 2019-05-22 | 910 | 479 | 1025 | 1025 |
| 2019-05-23 | 921 | 479 | 1025 | 1025 |
| 2019-05-23 | 920 | 479 | 1025 | 1025 |
| 2019-05-23 | 804 | 479 | 1025 | 1025 |
| 2019-05-23 | 921 | 479 | 1025 | 1025 |
| 2019-05-23 | 872 | 479 | 1025 | 1025 |
| 2019-05-23 | 907 | 479 | 1025 | 1025 |
| 2019-05-24 | 911 | 479 | 1025 | 1025 |
| 2019-05-24 | 917 | 479 | 1025 | 1025 |
| 2019-05-24 | 902 | 479 | 1025 | 1025 |
| 2019-05-24 | 921 | 479 | 1025 | 1025 |
| 2019-05-24 | 880 | 479 | 1025 | 1025 |
| 2019-05-24 | 911 | 479 | 1025 | 1025 |
| 2019-05-25 | 922 | 479 | 1025 | 1025 |
| 2019-05-25 | 922 | 479 | 1025 | 1025 |
| 2019-05-25 | 800 | 479 | 1025 | 1025 |
| 2019-05-25 | 919 | 479 | 1025 | 1025 |
| 2019-05-25 | 806 | 479 | 1025 | 1025 |
| 2019-05-25 | 911 | 479 | 1025 | 1025 |
| 2019-05-26 | 751 | 479 | 1025 | 1025 |
| 2019-05-26 | 716 | 479 | 1025 | 1025 |
| 2019-05-26 | 822 | 479 | 1025 | 1025 |
| 2019-05-26 | 837 | 479 | 1025 | 1025 |
| 2019-05-26 | 838 | 479 | 1025 | 1025 |
| 2019-05-26 | 833 | 479 | 1025 | 1025 |
| 2019-05-27 | 844 | 479 | 1041 | 1041 |
| 2019-05-27 | 920 | 479 | 1041 | 1041 |
| 2019-05-27 | 907 | 479 | 1041 | 1041 |
| 2019-05-27 | 927 | 479 | 1041 | 1041 |
| 2019-05-27 | 891 | 479 | 1041 | 1041 |
| 2019-05-27 | 916 | 479 | 1041 | 1041 |
| 2019-05-28 | 774 | 479 | 1041 | 1041 |
| 2019-05-28 | 925 | 479 | 1041 | 1041 |
| 2019-05-28 | 902 | 479 | 1041 | 1041 |
| 2019-05-28 | 848 | 479 | 1041 | 1041 |
| 2019-05-28 | 842 | 479 | 1041 | 1041 |
| 2019-05-28 | 917 | 479 | 1041 | 1041 |
| 2019-05-29 | 779 | 479 | 1041 | 1041 |
| 2019-05-29 | 926 | 479 | 1041 | 1041 |
| 2019-05-29 | 904 | 479 | 1041 | 1041 |
| 2019-05-29 | 928 | 479 | 1041 | 1041 |
| 2019-05-29 | 762 | 479 | 1041 | 1041 |
| 2019-05-29 | 804 | 479 | 1041 | 1041 |
| 2019-05-30 | 857 | 479 | 1041 | 1041 |
| 2019-05-30 | 859 | 479 | 1041 | 1041 |
| 2019-05-30 | 910 | 479 | 1041 | 1041 |
| 2019-05-30 | 868 | 479 | 1041 | 1041 |
| 2019-05-30 | 850 | 479 | 1041 | 1041 |
| 2019-05-30 | 807 | 479 | 1041 | 1041 |
| 2019-05-31 | 846 | 479 | 1041 | 1041 |
| 2019-05-31 | 923 | 479 | 1041 | 1041 |
| 2019-05-31 | 908 | 479 | 1041 | 1041 |
| 2019-05-31 | 719 | 479 | 1041 | 1041 |
| 2019-05-31 | 712 | 479 | 1041 | 1041 |
| 2019-05-31 | 914 | 479 | 1041 | 1041 |
| 2019-06-01 | 917 | 481 | 1041 | 1041 |
| 2019-06-01 | 921 | 481 | 1041 | 1041 |
| 2019-06-01 | 745 | 481 | 1041 | 1041 |
| 2019-06-01 | 697 | 481 | 1041 | 1041 |
| 2019-06-01 | 684 | 481 | 1041 | 1041 |
| 2019-06-01 | 909 | 481 | 1041 | 1041 |
| 2019-06-02 | 749 | 481 | 1041 | 1041 |
| 2019-06-02 | 841 | 481 | 1041 | 1041 |
| 2019-06-02 | 832 | 481 | 1041 | 1041 |
| 2019-06-02 | 808 | 481 | 1041 | 1041 |
| 2019-06-02 | 803 | 481 | 1041 | 1041 |
| 2019-06-02 | 751 | 481 | 1041 | 1041 |
| 2019-06-03 | 749 | 481 | 1027 | 1027 |
| 2019-06-03 | 914 | 481 | 1027 | 1027 |
| 2019-06-03 | 895 | 481 | 1027 | 1027 |
| 2019-06-03 | 916 | 481 | 1027 | 1027 |
| 2019-06-03 | 914 | 481 | 1027 | 1027 |
| 2019-06-03 | 910 | 481 | 1027 | 1027 |
| 2019-06-04 | 919 | 481 | 1027 | 1027 |
| 2019-06-04 | 886 | 481 | 1027 | 1027 |
| 2019-06-04 | 904 | 481 | 1027 | 1027 |
| 2019-06-04 | 924 | 481 | 1027 | 1027 |
| 2019-06-04 | 875 | 481 | 1027 | 1027 |
| 2019-06-04 | 910 | 481 | 1027 | 1027 |
| 2019-06-05 | 916 | 481 | 1027 | 1027 |
| 2019-06-05 | 917 | 481 | 1027 | 1027 |
| 2019-06-05 | 895 | 481 | 1027 | 1027 |
| 2019-06-05 | 915 | 481 | 1027 | 1027 |
| 2019-06-05 | 866 | 481 | 1027 | 1027 |
| 2019-06-05 | 910 | 481 | 1027 | 1027 |
| 2019-06-06 | 913 | 481 | 1027 | 1027 |
| 2019-06-06 | 836 | 481 | 1027 | 1027 |
| 2019-06-06 | 837 | 481 | 1027 | 1027 |
| 2019-06-06 | 835 | 481 | 1027 | 1027 |
| 2019-06-06 | 756 | 481 | 1027 | 1027 |
| 2019-06-06 | 911 | 481 | 1027 | 1027 |
| 2019-06-07 | 916 | 481 | 1027 | 1027 |
| 2019-06-07 | 953 | 481 | 1027 | 1027 |
| 2019-06-07 | 912 | 481 | 1027 | 1027 |
| 2019-06-07 | 933 | 481 | 1027 | 1027 |
| 2019-06-07 | 871 | 481 | 1027 | 1027 |
| 2019-06-07 | 855 | 481 | 1027 | 1027 |
| 2019-06-08 | 680 | 481 | 1025 | 1025 |
| 2019-06-08 | 863 | 481 | 1025 | 1025 |
| 2019-06-08 | 916 | 481 | 1025 | 1025 |
| 2019-06-08 | 897 | 481 | 1025 | 1025 |
| 2019-06-08 | 768 | 481 | 1025 | 1025 |
| 2019-06-08 | 674 | 481 | 1025 | 1025 |
| 2019-06-09 | 847 | 481 | 1025 | 1025 |
| 2019-06-09 | 744 | 481 | 1025 | 1025 |
| 2019-06-09 | 750 | 481 | 1025 | 1025 |
| 2019-06-09 | 734 | 481 | 1025 | 1025 |
| 2019-06-09 | 688 | 481 | 1025 | 1025 |
| 2019-06-09 | 764 | 481 | 1025 | 1025 |
| 2019-06-10 | 638 | 481 | 1025 | 1025 |
| 2019-06-10 | 660 | 481 | 1025 | 1025 |
| 2019-06-10 | 682 | 481 | 1025 | 1025 |
| 2019-06-10 | 694 | 481 | 1025 | 1025 |
| 2019-06-10 | 759 | 481 | 1025 | 1025 |
| 2019-06-10 | 640 | 481 | 1025 | 1025 |
| 2019-06-11 | 769 | 481 | 1025 | 1025 |
| 2019-06-11 | 791 | 481 | 1025 | 1025 |
| 2019-06-11 | 832 | 481 | 1025 | 1025 |
| 2019-06-11 | 836 | 481 | 1025 | 1025 |
| 2019-06-11 | 809 | 481 | 1025 | 1025 |
| 2019-06-11 | 772 | 481 | 1025 | 1025 |
| 2019-06-12 | 636 | 481 | 1025 | 1025 |
| 2019-06-12 | 783 | 481 | 1025 | 1025 |
| 2019-06-12 | 795 | 481 | 1025 | 1025 |
| 2019-06-12 | 839 | 481 | 1025 | 1025 |
| 2019-06-12 | 826 | 481 | 1025 | 1025 |
| 2019-06-12 | 783 | 481 | 1025 | 1025 |
| 2019-06-13 | 669 | 481 | 1025 | 1025 |
| 2019-06-13 | 877 | 481 | 1025 | 1025 |
| 2019-06-13 | 907 | 481 | 1025 | 1025 |
| 2019-06-13 | 907 | 481 | 1025 | 1025 |
| 2019-06-13 | 785 | 481 | 1025 | 1025 |
| 2019-06-13 | 782 | 481 | 1025 | 1025 |
| 2019-06-14 | 642 | 481 | 1025 | 1025 |
| 2019-06-14 | 762 | 481 | 1025 | 1025 |
| 2019-06-14 | 792 | 481 | 1025 | 1025 |
| 2019-06-14 | 677 | 481 | 1025 | 1025 |
| 2019-06-14 | 674 | 481 | 1025 | 1025 |
| 2019-06-14 | 768 | 481 | 1025 | 1025 |
| 2019-06-15 | 636 | 481 | 1025 | 1025 |
| 2019-06-15 | 591 | 481 | 1025 | 1025 |
| 2019-06-15 | 658 | 481 | 1025 | 1025 |
| 2019-06-15 | 687 | 481 | 1025 | 1025 |
| 2019-06-15 | 685 | 481 | 1025 | 1025 |
| 2019-06-15 | 771 | 481 | 1025 | 1025 |
| 2019-06-16 | 657 | 481 | 1025 | 1025 |
| 2019-06-16 | 595 | 481 | 1025 | 1025 |
| 2019-06-16 | 679 | 481 | 1025 | 1025 |
| 2019-06-16 | 708 | 481 | 1025 | 1025 |
| 2019-06-16 | 662 | 481 | 1025 | 1025 |
| 2019-06-16 | 768 | 481 | 1025 | 1025 |
| 2019-06-17 | 763 | 481 | 1036 | 1036 |
| 2019-06-17 | 766 | 481 | 1036 | 1036 |
| 2019-06-17 | 770 | 481 | 1036 | 1036 |
| 2019-06-17 | 827 | 481 | 1036 | 1036 |
| 2019-06-17 | 675 | 481 | 1036 | 1036 |
| 2019-06-17 | 771 | 481 | 1036 | 1036 |
| 2019-06-18 | 762 | 481 | 1036 | 1036 |
| 2019-06-18 | 763 | 481 | 1036 | 1036 |
| 2019-06-18 | 773 | 481 | 1036 | 1036 |
| 2019-06-18 | 723 | 481 | 1036 | 1036 |
| 2019-06-18 | 698 | 481 | 1036 | 1036 |
| 2019-06-18 | 770 | 481 | 1036 | 1036 |
| 2019-06-19 | 750 | 481 | 1036 | 1036 |
| 2019-06-19 | 784 | 481 | 1036 | 1036 |
| 2019-06-19 | 818 | 481 | 1036 | 1036 |
| 2019-06-19 | 845 | 481 | 1036 | 1036 |
| 2019-06-19 | 774 | 481 | 1036 | 1036 |
| 2019-06-19 | 776 | 481 | 1036 | 1036 |
| 2019-06-20 | 769 | 481 | 1036 | 1036 |
| 2019-06-20 | 754 | 481 | 1036 | 1036 |
| 2019-06-20 | 742 | 481 | 1036 | 1036 |
| 2019-06-20 | 837 | 481 | 1036 | 1036 |
| 2019-06-20 | 823 | 481 | 1036 | 1036 |
| 2019-06-20 | 782 | 481 | 1036 | 1036 |
| 2019-06-21 | 764 | 481 | 1036 | 1036 |
| 2019-06-21 | 759 | 481 | 1036 | 1036 |
| 2019-06-21 | 772 | 481 | 1036 | 1036 |
| 2019-06-21 | 832 | 481 | 1036 | 1036 |
| 2019-06-21 | 826 | 481 | 1036 | 1036 |
| 2019-06-21 | 773 | 481 | 1036 | 1036 |
| 2019-06-22 | 772 | 481 | 1036 | 1036 |
| 2019-06-22 | 629 | 481 | 1036 | 1036 |
| 2019-06-22 | 675 | 481 | 1036 | 1036 |
| 2019-06-22 | 684 | 481 | 1036 | 1036 |
| 2019-06-22 | 687 | 481 | 1036 | 1036 |
| 2019-06-22 | 642 | 481 | 1036 | 1036 |
| 2019-06-23 | 640 | 481 | 1036 | 1036 |
| 2019-06-23 | 745 | 481 | 1036 | 1036 |
| 2019-06-23 | 670 | 481 | 1036 | 1036 |
| 2019-06-23 | 685 | 481 | 1036 | 1036 |
| 2019-06-23 | 682 | 481 | 1036 | 1036 |
| 2019-06-23 | 643 | 481 | 1036 | 1036 |
| 2019-06-24 | 641 | 481 | 1036 | 1036 |
| 2019-06-24 | 795 | 481 | 1036 | 1036 |
| 2019-06-24 | 766 | 481 | 1036 | 1036 |
| 2019-06-24 | 679 | 481 | 1036 | 1036 |
| 2019-06-24 | 678 | 481 | 1036 | 1036 |
| 2019-06-24 | 763 | 481 | 1036 | 1036 |
| 2019-06-25 | 807 | 481 | 1025 | 1025 |
| 2019-06-25 | 696 | 481 | 1025 | 1025 |
| 2019-06-25 | 807 | 481 | 1025 | 1025 |
| 2019-06-25 | 696 | 481 | 1025 | 1025 |
| 2019-06-25 | 696 | 481 | 1025 | 1025 |
| 2019-06-25 | 696 | 481 | 1025 | 1025 |
| 2019-06-26 | 731 | 481 | 1025 | 1025 |
| 2019-06-26 | 733 | 481 | 1025 | 1025 |
| 2019-06-26 | 733 | 481 | 1025 | 1025 |
| 2019-06-26 | 606 | 481 | 1025 | 1025 |
| 2019-06-26 | 641 | 481 | 1025 | 1025 |
| 2019-06-26 | 762 | 481 | 1025 | 1025 |
| 2019-06-27 | 838 | 481 | 1025 | 1025 |
| 2019-06-27 | 711 | 481 | 1025 | 1025 |
| 2019-06-27 | 808 | 481 | 1025 | 1025 |
| 2019-06-27 | 726 | 481 | 1025 | 1025 |
| 2019-06-27 | 840 | 481 | 1025 | 1025 |
| 2019-06-27 | 686 | 481 | 1025 | 1025 |
| 2019-06-28 | 773 | 481 | 1025 | 1025 |
| 2019-06-28 | 764 | 481 | 1025 | 1025 |
| 2019-06-28 | 775 | 481 | 1025 | 1025 |
| 2019-06-28 | 823 | 481 | 1025 | 1025 |
| 2019-06-28 | 815 | 481 | 1025 | 1025 |
| 2019-06-28 | 771 | 481 | 1025 | 1025 |
| 2019-06-29 | 644 | 481 | 1025 | 1025 |
| 2019-06-29 | 636 | 481 | 1025 | 1025 |
| 2019-06-29 | 672 | 481 | 1025 | 1025 |
| 2019-06-29 | 682 | 481 | 1025 | 1025 |
| 2019-06-29 | 682 | 481 | 1025 | 1025 |
| 2019-06-29 | 766 | 481 | 1025 | 1025 |
| 2019-06-30 | 670 | 481 | 1025 | 1025 |
| 2019-06-30 | 671 | 481 | 1025 | 1025 |
| 2019-06-30 | 676 | 481 | 1025 | 1025 |
| 2019-06-30 | 689 | 481 | 1025 | 1025 |
| 2019-06-30 | 697 | 481 | 1025 | 1025 |
| 2019-06-30 | 775 | 481 | 1025 | 1025 |
| 2019-07-01 | 762 | 482 | 1033 | 1033 |
| 2019-07-01 | 919 | 482 | 1033 | 1033 |
| 2019-07-01 | 884 | 482 | 1033 | 1033 |
| 2019-07-01 | 866 | 482 | 1033 | 1033 |
| 2019-07-01 | 859 | 482 | 1033 | 1033 |
| 2019-07-01 | 912 | 482 | 1033 | 1033 |
| 2019-07-02 | 918 | 482 | 1033 | 1033 |
| 2019-07-02 | 918 | 482 | 1033 | 1033 |
| 2019-07-02 | 915 | 482 | 1033 | 1033 |
| 2019-07-02 | 929 | 482 | 1033 | 1033 |
| 2019-07-02 | 928 | 482 | 1033 | 1033 |
| 2019-07-02 | 913 | 482 | 1033 | 1033 |
| 2019-07-03 | 752 | 482 | 1033 | 1033 |
| 2019-07-03 | 767 | 482 | 1033 | 1033 |
| 2019-07-03 | 770 | 482 | 1033 | 1033 |
| 2019-07-03 | 777 | 482 | 1033 | 1033 |
| 2019-07-03 | 705 | 482 | 1033 | 1033 |
| 2019-07-03 | 766 | 482 | 1033 | 1033 |
| 2019-07-04 | 918 | 482 | 1033 | 1033 |
| 2019-07-04 | 892 | 482 | 1033 | 1033 |
| 2019-07-04 | 915 | 482 | 1033 | 1033 |
| 2019-07-04 | 928 | 482 | 1033 | 1033 |
| 2019-07-04 | 924 | 482 | 1033 | 1033 |
| 2019-07-04 | 911 | 482 | 1033 | 1033 |
| 2019-07-05 | 748 | 482 | 1033 | 1033 |
| 2019-07-05 | 889 | 482 | 1033 | 1033 |
| 2019-07-05 | 914 | 482 | 1033 | 1033 |
| 2019-07-05 | 927 | 482 | 1033 | 1033 |
| 2019-07-05 | 923 | 482 | 1033 | 1033 |
| 2019-07-05 | 911 | 482 | 1033 | 1033 |
| 2019-07-06 | 748 | 482 | 1033 | 1033 |
| 2019-07-06 | 712 | 482 | 1033 | 1033 |
| 2019-07-06 | 801 | 482 | 1033 | 1033 |
| 2019-07-06 | 826 | 482 | 1033 | 1033 |
| 2019-07-06 | 816 | 482 | 1033 | 1033 |
| 2019-07-06 | 912 | 482 | 1033 | 1033 |
| 2019-07-07 | 751 | 482 | 1033 | 1033 |
| 2019-07-07 | 917 | 482 | 1033 | 1033 |
| 2019-07-07 | 802 | 482 | 1033 | 1033 |
| 2019-07-07 | 835 | 482 | 1033 | 1033 |
| 2019-07-07 | 829 | 482 | 1033 | 1033 |
| 2019-07-07 | 760 | 482 | 1033 | 1033 |
| 2019-07-08 | 749 | 482 | 1025 | 1025 |
| 2019-07-08 | 899 | 482 | 1025 | 1025 |
| 2019-07-08 | 876 | 482 | 1025 | 1025 |
| 2019-07-08 | 774 | 482 | 1025 | 1025 |
| 2019-07-08 | 713 | 482 | 1025 | 1025 |
| 2019-07-08 | 903 | 482 | 1025 | 1025 |
| 2019-07-09 | 795 | 482 | 1025 | 1025 |
| 2019-07-09 | 904 | 482 | 1025 | 1025 |
| 2019-07-09 | 904 | 482 | 1025 | 1025 |
| 2019-07-09 | 795 | 482 | 1025 | 1025 |
| 2019-07-09 | 795 | 482 | 1025 | 1025 |
| 2019-07-09 | 904 | 482 | 1025 | 1025 |
| 2019-07-10 | 909 | 482 | 1025 | 1025 |
| 2019-07-10 | 909 | 482 | 1025 | 1025 |
| 2019-07-10 | 908 | 482 | 1025 | 1025 |
| 2019-07-10 | 909 | 482 | 1025 | 1025 |
| 2019-07-10 | 908 | 482 | 1025 | 1025 |
| 2019-07-10 | 908 | 482 | 1025 | 1025 |
| 2019-07-11 | 907 | 482 | 1025 | 1025 |
| 2019-07-11 | 894 | 482 | 1025 | 1025 |
| 2019-07-11 | 866 | 482 | 1025 | 1025 |
| 2019-07-11 | 917 | 482 | 1025 | 1025 |
| 2019-07-11 | 914 | 482 | 1025 | 1025 |
| 2019-07-11 | 901 | 482 | 1025 | 1025 |
| 2019-07-12 | 906 | 482 | 1025 | 1025 |
| 2019-07-12 | 906 | 482 | 1025 | 1025 |
| 2019-07-12 | 899 | 482 | 1025 | 1025 |
| 2019-07-12 | 920 | 482 | 1025 | 1025 |
| 2019-07-12 | 819 | 482 | 1025 | 1025 |
| 2019-07-12 | 902 | 482 | 1025 | 1025 |
| 2019-07-13 | 750 | 482 | 1025 | 1025 |
| 2019-07-13 | 714 | 482 | 1025 | 1025 |
| 2019-07-13 | 789 | 482 | 1025 | 1025 |
| 2019-07-13 | 823 | 482 | 1025 | 1025 |
| 2019-07-13 | 822 | 482 | 1025 | 1025 |
| 2019-07-13 | 757 | 482 | 1025 | 1025 |
| 2019-07-14 | 751 | 482 | 1025 | 1025 |
| 2019-07-14 | 717 | 482 | 1025 | 1025 |
| 2019-07-14 | 789 | 482 | 1025 | 1025 |
| 2019-07-14 | 822 | 482 | 1025 | 1025 |
| 2019-07-14 | 821 | 482 | 1025 | 1025 |
| 2019-07-14 | 758 | 482 | 1025 | 1025 |
| 2019-07-15 | 754 | 482 | 1030 | 1030 |
| 2019-07-15 | 911 | 482 | 1030 | 1030 |
| 2019-07-15 | 870 | 482 | 1030 | 1030 |
| 2019-07-15 | 821 | 482 | 1030 | 1030 |
| 2019-07-15 | 817 | 482 | 1030 | 1030 |
| 2019-07-15 | 755 | 482 | 1030 | 1030 |
| 2019-07-16 | 750 | 482 | 1030 | 1030 |
| 2019-07-16 | 909 | 482 | 1030 | 1030 |
| 2019-07-16 | 880 | 482 | 1030 | 1030 |
| 2019-07-16 | 822 | 482 | 1030 | 1030 |
| 2019-07-16 | 818 | 482 | 1030 | 1030 |
| 2019-07-16 | 749 | 482 | 1030 | 1030 |
| 2019-07-17 | 913 | 482 | 1030 | 1030 |
| 2019-07-17 | 909 | 482 | 1030 | 1030 |
| 2019-07-17 | 800 | 482 | 1030 | 1030 |
| 2019-07-17 | 920 | 482 | 1030 | 1030 |
| 2019-07-17 | 806 | 482 | 1030 | 1030 |
| 2019-07-17 | 752 | 482 | 1030 | 1030 |
| 2019-07-18 | 907 | 482 | 1030 | 1030 |
| 2019-07-18 | 909 | 482 | 1030 | 1030 |
| 2019-07-18 | 797 | 482 | 1030 | 1030 |
| 2019-07-18 | 916 | 482 | 1030 | 1030 |
| 2019-07-18 | 912 | 482 | 1030 | 1030 |
| 2019-07-18 | 758 | 482 | 1030 | 1030 |
| 2019-07-19 | 908 | 482 | 1030 | 1030 |
| 2019-07-19 | 909 | 482 | 1030 | 1030 |
| 2019-07-19 | 886 | 482 | 1030 | 1030 |
| 2019-07-19 | 922 | 482 | 1030 | 1030 |
| 2019-07-19 | 915 | 482 | 1030 | 1030 |
| 2019-07-19 | 904 | 482 | 1030 | 1030 |
| 2019-07-20 | 908 | 482 | 1030 | 1030 |
| 2019-07-20 | 741 | 482 | 1030 | 1030 |
| 2019-07-20 | 797 | 482 | 1030 | 1030 |
| 2019-07-20 | 829 | 482 | 1030 | 1030 |
| 2019-07-20 | 803 | 482 | 1030 | 1030 |
| 2019-07-20 | 816 | 482 | 1030 | 1030 |
| 2019-07-21 | 764 | 482 | 1030 | 1030 |
| 2019-07-21 | 717 | 482 | 1030 | 1030 |
| 2019-07-21 | 797 | 482 | 1030 | 1030 |
| 2019-07-21 | 825 | 482 | 1030 | 1030 |
| 2019-07-21 | 817 | 482 | 1030 | 1030 |
| 2019-07-21 | 749 | 482 | 1030 | 1030 |
| 2019-07-22 | 756 | 482 | 1030 | 1030 |
| 2019-07-22 | 918 | 482 | 1030 | 1030 |
| 2019-07-22 | 884 | 482 | 1030 | 1030 |
| 2019-07-22 | 821 | 482 | 1030 | 1030 |
| 2019-07-22 | 917 | 482 | 1030 | 1030 |
| 2019-07-22 | 903 | 482 | 1030 | 1030 |
| 2019-07-23 | 909 | 482 | 1030 | 1030 |
| 2019-07-23 | 909 | 482 | 1030 | 1030 |
| 2019-07-23 | 901 | 482 | 1030 | 1030 |
| 2019-07-23 | 918 | 482 | 1030 | 1030 |
| 2019-07-23 | 913 | 482 | 1030 | 1030 |
| 2019-07-23 | 846 | 482 | 1030 | 1030 |
| 2019-07-24 | 755 | 482 | 1030 | 1030 |
| 2019-07-24 | 910 | 482 | 1030 | 1030 |
| 2019-07-24 | 887 | 482 | 1030 | 1030 |
| 2019-07-24 | 917 | 482 | 1030 | 1030 |
| 2019-07-24 | 910 | 482 | 1030 | 1030 |
| 2019-07-24 | 896 | 482 | 1030 | 1030 |
| 2019-07-25 | 906 | 482 | 1030 | 1030 |
| 2019-07-25 | 908 | 482 | 1030 | 1030 |
| 2019-07-25 | 908 | 482 | 1030 | 1030 |
| 2019-07-25 | 918 | 482 | 1030 | 1030 |
| 2019-07-25 | 909 | 482 | 1030 | 1030 |
| 2019-07-25 | 740 | 482 | 1030 | 1030 |
| 2019-07-26 | 906 | 482 | 1030 | 1030 |
| 2019-07-26 | 907 | 482 | 1030 | 1030 |
| 2019-07-26 | 904 | 482 | 1030 | 1030 |
| 2019-07-26 | 919 | 482 | 1030 | 1030 |
| 2019-07-26 | 912 | 482 | 1030 | 1030 |
| 2019-07-26 | 903 | 482 | 1030 | 1030 |
| 2019-07-27 | 906 | 482 | 1030 | 1030 |
| 2019-07-27 | 910 | 482 | 1030 | 1030 |
| 2019-07-27 | 912 | 482 | 1030 | 1030 |
| 2019-07-27 | 913 | 482 | 1030 | 1030 |
| 2019-07-27 | 853 | 482 | 1030 | 1030 |
| 2019-07-27 | 754 | 482 | 1030 | 1030 |
| 2019-07-28 | 912 | 482 | 1030 | 1030 |
| 2019-07-28 | 754 | 482 | 1030 | 1030 |
| 2019-07-28 | 802 | 482 | 1030 | 1030 |
| 2019-07-28 | 820 | 482 | 1030 | 1030 |
| 2019-07-28 | 763 | 482 | 1030 | 1030 |
| 2019-07-28 | 753 | 482 | 1030 | 1030 |
| 2019-07-29 | 758 | 482 | 1030 | 1030 |
| 2019-07-29 | 910 | 482 | 1030 | 1030 |
| 2019-07-29 | 889 | 482 | 1030 | 1030 |
| 2019-07-29 | 822 | 482 | 1030 | 1030 |
| 2019-07-29 | 808 | 482 | 1030 | 1030 |
| 2019-07-29 | 906 | 482 | 1030 | 1030 |
| 2019-07-30 | 911 | 482 | 1030 | 1030 |
| 2019-07-30 | 914 | 482 | 1030 | 1030 |
| 2019-07-30 | 889 | 482 | 1030 | 1030 |
| 2019-07-30 | 923 | 482 | 1030 | 1030 |
| 2019-07-30 | 816 | 482 | 1030 | 1030 |
| 2019-07-30 | 904 | 482 | 1030 | 1030 |
| 2019-07-31 | 839 | 482 | 1030 | 1030 |
| 2019-07-31 | 916 | 482 | 1030 | 1030 |
| 2019-07-31 | 923 | 482 | 1030 | 1030 |
| 2019-07-31 | 922 | 482 | 1030 | 1030 |
| 2019-07-31 | 793 | 482 | 1030 | 1030 |
| 2019-07-31 | 807 | 482 | 1030 | 1030 |
| 2019-08-01 | 831 | 492 | 1030 | 1030 |
| 2019-08-01 | 914 | 492 | 1030 | 1030 |
| 2019-08-01 | 907 | 492 | 1030 | 1030 |
| 2019-08-01 | 924 | 492 | 1030 | 1030 |
| 2019-08-01 | 921 | 492 | 1030 | 1030 |
| 2019-08-01 | 900 | 492 | 1030 | 1030 |
| 2019-08-02 | 909 | 492 | 1030 | 1030 |
| 2019-08-02 | 911 | 492 | 1030 | 1030 |
| 2019-08-02 | 879 | 492 | 1030 | 1030 |
| 2019-08-02 | 919 | 492 | 1030 | 1030 |
| 2019-08-02 | 828 | 492 | 1030 | 1030 |
| 2019-08-02 | 745 | 492 | 1030 | 1030 |
| 2019-08-03 | 967 | 492 | 1030 | 1030 |
| 2019-08-03 | 968 | 492 | 1030 | 1030 |
| 2019-08-03 | 899 | 492 | 1030 | 1030 |
| 2019-08-03 | 968 | 492 | 1030 | 1030 |
| 2019-08-03 | 965 | 492 | 1030 | 1030 |
| 2019-08-03 | 961 | 492 | 1030 | 1030 |
| 2019-08-04 | 908 | 492 | 1030 | 1030 |
| 2019-08-04 | 911 | 492 | 1030 | 1030 |
| 2019-08-04 | 953 | 492 | 1030 | 1030 |
| 2019-08-04 | 921 | 492 | 1030 | 1030 |
| 2019-08-04 | 911 | 492 | 1030 | 1030 |
| 2019-08-04 | 896 | 492 | 1030 | 1030 |
| 2019-08-05 | 895 | 492 | 1030 | 1030 |
| 2019-08-05 | 960 | 492 | 1030 | 1030 |
| 2019-08-05 | 942 | 492 | 1030 | 1030 |
| 2019-08-05 | 908 | 492 | 1030 | 1030 |
| 2019-08-05 | 866 | 492 | 1030 | 1030 |
| 2019-08-05 | 950 | 492 | 1030 | 1030 |
| 2019-08-06 | 894 | 492 | 1030 | 1030 |
| 2019-08-06 | 951 | 492 | 1030 | 1030 |
| 2019-08-06 | 945 | 492 | 1030 | 1030 |
| 2019-08-06 | 905 | 492 | 1030 | 1030 |
| 2019-08-06 | 907 | 492 | 1030 | 1030 |
| 2019-08-06 | 953 | 492 | 1030 | 1030 |
| 2019-08-07 | 915 | 492 | 1030 | 1030 |
| 2019-08-07 | 956 | 492 | 1030 | 1030 |
| 2019-08-07 | 952 | 492 | 1030 | 1030 |
| 2019-08-07 | 958 | 492 | 1030 | 1030 |
| 2019-08-07 | 876 | 492 | 1030 | 1030 |
| 2019-08-07 | 890 | 492 | 1030 | 1030 |
| 2019-08-08 | 916 | 492 | 1030 | 1030 |
| 2019-08-08 | 964 | 492 | 1030 | 1030 |
| 2019-08-08 | 944 | 492 | 1030 | 1030 |
| 2019-08-08 | 960 | 492 | 1030 | 1030 |
| 2019-08-08 | 958 | 492 | 1030 | 1030 |
| 2019-08-08 | 953 | 492 | 1030 | 1030 |
| 2019-08-09 | 960 | 492 | 1030 | 1030 |
| 2019-08-09 | 963 | 492 | 1030 | 1030 |
| 2019-08-09 | 993 | 492 | 1030 | 1030 |
| 2019-08-09 | 957 | 492 | 1030 | 1030 |
| 2019-08-09 | 883 | 492 | 1030 | 1030 |
| 2019-08-09 | 904 | 492 | 1030 | 1030 |
| 2019-08-10 | 921 | 492 | 1030 | 1030 |
| 2019-08-10 | 921 | 492 | 1030 | 1030 |
| 2019-08-10 | 961 | 492 | 1030 | 1030 |
| 2019-08-10 | 961 | 492 | 1030 | 1030 |
| 2019-08-10 | 880 | 492 | 1030 | 1030 |
| 2019-08-10 | 908 | 492 | 1030 | 1030 |
| 2019-08-11 | 918 | 492 | 1030 | 1030 |
| 2019-08-11 | 920 | 492 | 1030 | 1030 |
| 2019-08-11 | 960 | 492 | 1030 | 1030 |
| 2019-08-11 | 908 | 492 | 1030 | 1030 |
| 2019-08-11 | 872 | 492 | 1030 | 1030 |
| 2019-08-11 | 960 | 492 | 1030 | 1030 |
| 2019-08-12 | 919 | 492 | 1030 | 1030 |
| 2019-08-12 | 965 | 492 | 1030 | 1030 |
| 2019-08-12 | 947 | 492 | 1030 | 1030 |
| 2019-08-12 | 916 | 492 | 1030 | 1030 |
| 2019-08-12 | 949 | 492 | 1030 | 1030 |
| 2019-08-12 | 956 | 492 | 1030 | 1030 |
| 2019-08-13 | 963 | 492 | 1030 | 1030 |
| 2019-08-13 | 964 | 492 | 1030 | 1030 |
| 2019-08-13 | 947 | 492 | 1030 | 1030 |
| 2019-08-13 | 962 | 492 | 1030 | 1030 |
| 2019-08-13 | 907 | 492 | 1030 | 1030 |
| 2019-08-13 | 956 | 492 | 1030 | 1030 |
| 2019-08-14 | 962 | 492 | 1030 | 1030 |
| 2019-08-14 | 963 | 492 | 1030 | 1030 |
| 2019-08-14 | 946 | 492 | 1030 | 1030 |
| 2019-08-14 | 912 | 492 | 1030 | 1030 |
| 2019-08-14 | 878 | 492 | 1030 | 1030 |
| 2019-08-14 | 897 | 492 | 1030 | 1030 |
| 2019-08-15 | 921 | 492 | 1030 | 1030 |
| 2019-08-15 | 923 | 492 | 1030 | 1030 |
| 2019-08-15 | 962 | 492 | 1030 | 1030 |
| 2019-08-15 | 961 | 492 | 1030 | 1030 |
| 2019-08-15 | 883 | 492 | 1030 | 1030 |
| 2019-08-15 | 893 | 492 | 1030 | 1030 |
| 2019-08-16 | 900 | 492 | 1030 | 1030 |
| 2019-08-16 | 963 | 492 | 1030 | 1030 |
| 2019-08-16 | 945 | 492 | 1030 | 1030 |
| 2019-08-16 | 911 | 492 | 1030 | 1030 |
| 2019-08-16 | 867 | 492 | 1030 | 1030 |
| 2019-08-16 | 891 | 492 | 1030 | 1030 |
| 2019-08-17 | 922 | 492 | 1030 | 1030 |
| 2019-08-17 | 923 | 492 | 1030 | 1030 |
| 2019-08-17 | 963 | 492 | 1030 | 1030 |
| 2019-08-17 | 961 | 492 | 1030 | 1030 |
| 2019-08-17 | 870 | 492 | 1030 | 1030 |
| 2019-08-17 | 955 | 492 | 1030 | 1030 |
| 2019-08-18 | 963 | 492 | 1030 | 1030 |
| 2019-08-18 | 963 | 492 | 1030 | 1030 |
| 2019-08-18 | 962 | 492 | 1030 | 1030 |
| 2019-08-18 | 907 | 492 | 1030 | 1030 |
| 2019-08-18 | 906 | 492 | 1030 | 1030 |
| 2019-08-18 | 898 | 492 | 1030 | 1030 |
| 2019-08-19 | 924 | 492 | 1037 | 1037 |
| 2019-08-19 | 998 | 492 | 1037 | 1037 |
| 2019-08-19 | 963 | 492 | 1037 | 1037 |
| 2019-08-19 | 965 | 492 | 1037 | 1037 |
| 2019-08-19 | 881 | 492 | 1037 | 1037 |
| 2019-08-19 | 955 | 492 | 1037 | 1037 |
| 2019-08-20 | 966 | 492 | 1037 | 1037 |
| 2019-08-20 | 965 | 492 | 1037 | 1037 |
| 2019-08-20 | 950 | 492 | 1037 | 1037 |
| 2019-08-20 | 918 | 492 | 1037 | 1037 |
| 2019-08-20 | 915 | 492 | 1037 | 1037 |
| 2019-08-20 | 958 | 492 | 1037 | 1037 |
| 2019-08-21 | 966 | 492 | 1037 | 1037 |
| 2019-08-21 | 966 | 492 | 1037 | 1037 |
| 2019-08-21 | 949 | 492 | 1037 | 1037 |
| 2019-08-21 | 965 | 492 | 1037 | 1037 |
| 2019-08-21 | 963 | 492 | 1037 | 1037 |
| 2019-08-21 | 958 | 492 | 1037 | 1037 |
| 2019-08-22 | 966 | 492 | 1037 | 1037 |
| 2019-08-22 | 966 | 492 | 1037 | 1037 |
| 2019-08-22 | 949 | 492 | 1037 | 1037 |
| 2019-08-22 | 919 | 492 | 1037 | 1037 |
| 2019-08-22 | 906 | 492 | 1037 | 1037 |
| 2019-08-22 | 957 | 492 | 1037 | 1037 |
| 2019-08-23 | 966 | 492 | 1037 | 1037 |
| 2019-08-23 | 966 | 492 | 1037 | 1037 |
| 2019-08-23 | 897 | 492 | 1037 | 1037 |
| 2019-08-23 | 964 | 492 | 1037 | 1037 |
| 2019-08-23 | 961 | 492 | 1037 | 1037 |
| 2019-08-23 | 893 | 492 | 1037 | 1037 |
| 2019-08-24 | 959 | 492 | 1037 | 1037 |
| 2019-08-24 | 965 | 492 | 1037 | 1037 |
| 2019-08-24 | 897 | 492 | 1037 | 1037 |
| 2019-08-24 | 915 | 492 | 1037 | 1037 |
| 2019-08-24 | 907 | 492 | 1037 | 1037 |
| 2019-08-24 | 887 | 492 | 1037 | 1037 |
| 2019-08-25 | 964 | 492 | 1037 | 1037 |
| 2019-08-25 | 965 | 492 | 1037 | 1037 |
| 2019-08-25 | 897 | 492 | 1037 | 1037 |
| 2019-08-25 | 914 | 492 | 1037 | 1037 |
| 2019-08-25 | 907 | 492 | 1037 | 1037 |
| 2019-08-25 | 889 | 492 | 1037 | 1037 |
| 2019-08-26 | 958 | 492 | 1034 | 1034 |
| 2019-08-26 | 963 | 492 | 1034 | 1034 |
| 2019-08-26 | 947 | 492 | 1034 | 1034 |
| 2019-08-26 | 961 | 492 | 1034 | 1034 |
| 2019-08-26 | 958 | 492 | 1034 | 1034 |
| 2019-08-26 | 886 | 492 | 1034 | 1034 |
| 2019-08-27 | 962 | 492 | 1034 | 1034 |
| 2019-08-27 | 963 | 492 | 1034 | 1034 |
| 2019-08-27 | 947 | 492 | 1034 | 1034 |
| 2019-08-27 | 962 | 492 | 1034 | 1034 |
| 2019-08-27 | 958 | 492 | 1034 | 1034 |
| 2019-08-27 | 953 | 492 | 1034 | 1034 |
| 2019-08-28 | 958 | 492 | 1034 | 1034 |
| 2019-08-28 | 963 | 492 | 1034 | 1034 |
| 2019-08-28 | 953 | 492 | 1034 | 1034 |
| 2019-08-28 | 962 | 492 | 1034 | 1034 |
| 2019-08-28 | 943 | 492 | 1034 | 1034 |
| 2019-08-28 | 955 | 492 | 1034 | 1034 |
| 2019-08-29 | 959 | 492 | 1034 | 1034 |
| 2019-08-29 | 963 | 492 | 1034 | 1034 |
| 2019-08-29 | 953 | 492 | 1034 | 1034 |
| 2019-08-29 | 963 | 492 | 1034 | 1034 |
| 2019-08-29 | 960 | 492 | 1034 | 1034 |
| 2019-08-29 | 956 | 492 | 1034 | 1034 |
| 2019-08-30 | 964 | 492 | 1034 | 1034 |
| 2019-08-30 | 964 | 492 | 1034 | 1034 |
| 2019-08-30 | 955 | 492 | 1034 | 1034 |
| 2019-08-30 | 964 | 492 | 1034 | 1034 |
| 2019-08-30 | 961 | 492 | 1034 | 1034 |
| 2019-08-30 | 956 | 492 | 1034 | 1034 |
| 2019-08-31 | 965 | 492 | 1034 | 1034 |
| 2019-08-31 | 965 | 492 | 1034 | 1034 |
| 2019-08-31 | 955 | 492 | 1034 | 1034 |
| 2019-08-31 | 964 | 492 | 1034 | 1034 |
| 2019-08-31 | 959 | 492 | 1034 | 1034 |
| 2019-08-31 | 957 | 492 | 1034 | 1034 |
| 2019-09-01 | 958 | 491 | 1034 | 1034 |
| 2019-09-01 | 905 | 491 | 1034 | 1034 |
| 2019-09-01 | 893 | 491 | 1034 | 1034 |
| 2019-09-01 | 907 | 491 | 1034 | 1034 |
| 2019-09-01 | 873 | 491 | 1034 | 1034 |
| 2019-09-01 | 956 | 491 | 1034 | 1034 |
| 2019-09-02 | 925 | 491 | 1003 | 1003 |
| 2019-09-02 | 926 | 491 | 1003 | 1003 |
| 2019-09-02 | 921 | 491 | 1003 | 1003 |
| 2019-09-02 | 924 | 491 | 1003 | 1003 |
| 2019-09-02 | 919 | 491 | 1003 | 1003 |
| 2019-09-02 | 919 | 491 | 1003 | 1003 |
| 2019-09-03 | 927 | 491 | 1003 | 1003 |
| 2019-09-03 | 926 | 491 | 1003 | 1003 |
| 2019-09-03 | 921 | 491 | 1003 | 1003 |
| 2019-09-03 | 923 | 491 | 1003 | 1003 |
| 2019-09-03 | 924 | 491 | 1003 | 1003 |
| 2019-09-03 | 918 | 491 | 1003 | 1003 |
| 2019-09-04 | 927 | 491 | 1003 | 1003 |
| 2019-09-04 | 930 | 491 | 1003 | 1003 |
| 2019-09-04 | 969 | 491 | 1003 | 1003 |
| 2019-09-04 | 972 | 491 | 1003 | 1003 |
| 2019-09-04 | 908 | 491 | 1003 | 1003 |
| 2019-09-04 | 918 | 491 | 1003 | 1003 |
| 2019-09-05 | 929 | 491 | 1003 | 1003 |
| 2019-09-05 | 930 | 491 | 1003 | 1003 |
| 2019-09-05 | 971 | 491 | 1003 | 1003 |
| 2019-09-05 | 974 | 491 | 1003 | 1003 |
| 2019-09-05 | 921 | 491 | 1003 | 1003 |
| 2019-09-05 | 919 | 491 | 1003 | 1003 |
| 2019-09-06 | 926 | 491 | 1003 | 1003 |
| 2019-09-06 | 926 | 491 | 1003 | 1003 |
| 2019-09-06 | 973 | 491 | 1003 | 1003 |
| 2019-09-06 | 922 | 491 | 1003 | 1003 |
| 2019-09-06 | 908 | 491 | 1003 | 1003 |
| 2019-09-06 | 919 | 491 | 1003 | 1003 |
| 2019-09-07 | 925 | 491 | 1003 | 1003 |
| 2019-09-07 | 926 | 491 | 1003 | 1003 |
| 2019-09-07 | 914 | 491 | 1003 | 1003 |
| 2019-09-07 | 922 | 491 | 1003 | 1003 |
| 2019-09-07 | 916 | 491 | 1003 | 1003 |
| 2019-09-07 | 919 | 491 | 1003 | 1003 |
| 2019-09-08 | 926 | 491 | 1003 | 1003 |
| 2019-09-08 | 926 | 491 | 1003 | 1003 |
| 2019-09-08 | 923 | 491 | 1003 | 1003 |
| 2019-09-08 | 922 | 491 | 1003 | 1003 |
| 2019-09-08 | 835 | 491 | 1003 | 1003 |
| 2019-09-08 | 920 | 491 | 1003 | 1003 |
| 2019-09-09 | 950 | 491 | 1014 | 1014 |
| 2019-09-09 | 949 | 491 | 1014 | 1014 |
| 2019-09-09 | 942 | 491 | 1014 | 1014 |
| 2019-09-09 | 945 | 491 | 1014 | 1014 |
| 2019-09-09 | 934 | 491 | 1014 | 1014 |
| 2019-09-09 | 941 | 491 | 1014 | 1014 |
| 2019-09-10 | 949 | 491 | 1014 | 1014 |
| 2019-09-10 | 949 | 491 | 1014 | 1014 |
| 2019-09-10 | 938 | 491 | 1014 | 1014 |
| 2019-09-10 | 945 | 491 | 1014 | 1014 |
| 2019-09-10 | 934 | 491 | 1014 | 1014 |
| 2019-09-10 | 941 | 491 | 1014 | 1014 |
| 2019-09-11 | 948 | 491 | 1014 | 1014 |
| 2019-09-11 | 949 | 491 | 1014 | 1014 |
| 2019-09-11 | 987 | 491 | 1014 | 1014 |
| 2019-09-11 | 987 | 491 | 1014 | 1014 |
| 2019-09-11 | 938 | 491 | 1014 | 1014 |
| 2019-09-11 | 940 | 491 | 1014 | 1014 |
| 2019-09-12 | 947 | 491 | 1014 | 1014 |
| 2019-09-12 | 948 | 491 | 1014 | 1014 |
| 2019-09-12 | 936 | 491 | 1014 | 1014 |
| 2019-09-12 | 945 | 491 | 1014 | 1014 |
| 2019-09-12 | 934 | 491 | 1014 | 1014 |
| 2019-09-12 | 938 | 491 | 1014 | 1014 |
| 2019-09-13 | 949 | 491 | 1014 | 1014 |
| 2019-09-13 | 950 | 491 | 1014 | 1014 |
| 2019-09-13 | 932 | 491 | 1014 | 1014 |
| 2019-09-13 | 939 | 491 | 1014 | 1014 |
| 2019-09-13 | 942 | 491 | 1014 | 1014 |
| 2019-09-13 | 941 | 491 | 1014 | 1014 |
| 2019-09-14 | 949 | 491 | 1014 | 1014 |
| 2019-09-14 | 950 | 491 | 1014 | 1014 |
| 2019-09-14 | 937 | 491 | 1014 | 1014 |
| 2019-09-14 | 945 | 491 | 1014 | 1014 |
| 2019-09-14 | 932 | 491 | 1014 | 1014 |
| 2019-09-14 | 941 | 491 | 1014 | 1014 |
| 2019-09-15 | 885 | 491 | 1014 | 1014 |
| 2019-09-15 | 887 | 491 | 1014 | 1014 |
| 2019-09-15 | 868 | 491 | 1014 | 1014 |
| 2019-09-15 | 886 | 491 | 1014 | 1014 |
| 2019-09-15 | 849 | 491 | 1014 | 1014 |
| 2019-09-15 | 941 | 491 | 1014 | 1014 |
| 2019-09-16 | 948 | 491 | 1014 | 1014 |
| 2019-09-16 | 949 | 491 | 1014 | 1014 |
| 2019-09-16 | 940 | 491 | 1014 | 1014 |
| 2019-09-16 | 940 | 491 | 1014 | 1014 |
| 2019-09-16 | 934 | 491 | 1014 | 1014 |
| 2019-09-16 | 940 | 491 | 1014 | 1014 |
| 2019-09-17 | 881 | 491 | 1014 | 1014 |
| 2019-09-17 | 948 | 491 | 1014 | 1014 |
| 2019-09-17 | 872 | 491 | 1014 | 1014 |
| 2019-09-17 | 890 | 491 | 1014 | 1014 |
| 2019-09-17 | 864 | 491 | 1014 | 1014 |
| 2019-09-17 | 872 | 491 | 1014 | 1014 |
| 2019-09-18 | 948 | 491 | 1014 | 1014 |
| 2019-09-18 | 949 | 491 | 1014 | 1014 |
| 2019-09-18 | 935 | 491 | 1014 | 1014 |
| 2019-09-18 | 890 | 491 | 1014 | 1014 |
| 2019-09-18 | 860 | 491 | 1014 | 1014 |
| 2019-09-18 | 872 | 491 | 1014 | 1014 |
| 2019-09-19 | 886 | 491 | 1014 | 1014 |
| 2019-09-19 | 949 | 491 | 1014 | 1014 |
| 2019-09-19 | 873 | 491 | 1014 | 1014 |
| 2019-09-19 | 944 | 491 | 1014 | 1014 |
| 2019-09-19 | 934 | 491 | 1014 | 1014 |
| 2019-09-19 | 941 | 491 | 1014 | 1014 |
| 2019-09-20 | 949 | 491 | 1014 | 1014 |
| 2019-09-20 | 949 | 491 | 1014 | 1014 |
| 2019-09-20 | 874 | 491 | 1014 | 1014 |
| 2019-09-20 | 945 | 491 | 1014 | 1014 |
| 2019-09-20 | 935 | 491 | 1014 | 1014 |
| 2019-09-20 | 945 | 491 | 1014 | 1014 |
| 2019-09-21 | 946 | 491 | 1014 | 1014 |
| 2019-09-21 | 948 | 491 | 1014 | 1014 |
| 2019-09-21 | 871 | 491 | 1014 | 1014 |
| 2019-09-21 | 888 | 491 | 1014 | 1014 |
| 2019-09-21 | 851 | 491 | 1014 | 1014 |
| 2019-09-21 | 870 | 491 | 1014 | 1014 |
| 2019-09-22 | 897 | 491 | 1014 | 1014 |
| 2019-09-22 | 899 | 491 | 1014 | 1014 |
| 2019-09-22 | 880 | 491 | 1014 | 1014 |
| 2019-09-22 | 884 | 491 | 1014 | 1014 |
| 2019-09-22 | 863 | 491 | 1014 | 1014 |
| 2019-09-22 | 939 | 491 | 1014 | 1014 |
| 2019-09-23 | 947 | 491 | 1014 | 1014 |
| 2019-09-23 | 948 | 491 | 1014 | 1014 |
| 2019-09-23 | 865 | 491 | 1014 | 1014 |
| 2019-09-23 | 884 | 491 | 1014 | 1014 |
| 2019-09-23 | 856 | 491 | 1014 | 1014 |
| 2019-09-23 | 870 | 491 | 1014 | 1014 |
| 2019-09-24 | 900 | 491 | 1014 | 1014 |
| 2019-09-24 | 900 | 491 | 1014 | 1014 |
| 2019-09-24 | 954 | 491 | 1014 | 1014 |
| 2019-09-24 | 954 | 491 | 1014 | 1014 |
| 2019-09-24 | 881 | 491 | 1014 | 1014 |
| 2019-09-24 | 879 | 491 | 1014 | 1014 |
| 2019-09-25 | 906 | 491 | 1014 | 1014 |
| 2019-09-25 | 906 | 491 | 1014 | 1014 |
| 2019-09-25 | 954 | 491 | 1014 | 1014 |
| 2019-09-25 | 962 | 491 | 1014 | 1014 |
| 2019-09-25 | 881 | 491 | 1014 | 1014 |
| 2019-09-25 | 882 | 491 | 1014 | 1014 |
| 2019-09-26 | 899 | 491 | 1014 | 1014 |
| 2019-09-26 | 899 | 491 | 1014 | 1014 |
| 2019-09-26 | 953 | 491 | 1014 | 1014 |
| 2019-09-26 | 967 | 491 | 1014 | 1014 |
| 2019-09-26 | 873 | 491 | 1014 | 1014 |
| 2019-09-26 | 940 | 491 | 1014 | 1014 |
| 2019-09-27 | 903 | 491 | 1014 | 1014 |
| 2019-09-27 | 952 | 491 | 1014 | 1014 |
| 2019-09-27 | 990 | 491 | 1014 | 1014 |
| 2019-09-27 | 956 | 491 | 1014 | 1014 |
| 2019-09-27 | 863 | 491 | 1014 | 1014 |
| 2019-09-27 | 891 | 491 | 1014 | 1014 |
| 2019-09-28 | 906 | 491 | 1014 | 1014 |
| 2019-09-28 | 908 | 491 | 1014 | 1014 |
| 2019-09-28 | 985 | 491 | 1014 | 1014 |
| 2019-09-28 | 973 | 491 | 1014 | 1014 |
| 2019-09-28 | 856 | 491 | 1014 | 1014 |
| 2019-09-28 | 946 | 491 | 1014 | 1014 |
| 2019-09-29 | 906 | 491 | 1014 | 1014 |
| 2019-09-29 | 908 | 491 | 1014 | 1014 |
| 2019-09-29 | 999 | 491 | 1014 | 1014 |
| 2019-09-29 | 998 | 491 | 1014 | 1014 |
| 2019-09-29 | 885 | 491 | 1014 | 1014 |
| 2019-09-29 | 904 | 491 | 1014 | 1014 |
| 2019-09-30 | 921 | 491 | 1037 | 1037 |
| 2019-09-30 | 964 | 491 | 1037 | 1037 |
| 2019-09-30 | 1001 | 491 | 1037 | 1037 |
| 2019-09-30 | 903 | 491 | 1037 | 1037 |
| 2019-09-30 | 948 | 491 | 1037 | 1037 |
| 2019-09-30 | 913 | 491 | 1037 | 1037 |
| 2019-10-01 | 923 | 491 | 1037 | 1037 |
| 2019-10-01 | 968 | 491 | 1037 | 1037 |
| 2019-10-01 | 1019 | 491 | 1037 | 1037 |
| 2019-10-01 | 963 | 491 | 1037 | 1037 |
| 2019-10-01 | 959 | 491 | 1037 | 1037 |
| 2019-10-01 | 893 | 491 | 1037 | 1037 |
| 2019-10-02 | 965 | 491 | 1037 | 1037 |
| 2019-10-02 | 966 | 491 | 1037 | 1037 |
| 2019-10-02 | 960 | 491 | 1037 | 1037 |
| 2019-10-02 | 960 | 491 | 1037 | 1037 |
| 2019-10-02 | 958 | 491 | 1037 | 1037 |
| 2019-10-02 | 954 | 491 | 1037 | 1037 |
| 2019-10-03 | 962 | 491 | 1037 | 1037 |
| 2019-10-03 | 962 | 491 | 1037 | 1037 |
| 2019-10-03 | 956 | 491 | 1037 | 1037 |
| 2019-10-03 | 959 | 491 | 1037 | 1037 |
| 2019-10-03 | 947 | 491 | 1037 | 1037 |
| 2019-10-03 | 893 | 491 | 1037 | 1037 |
| 2019-10-04 | 967 | 491 | 1037 | 1037 |
| 2019-10-04 | 967 | 491 | 1037 | 1037 |
| 2019-10-04 | 1002 | 491 | 1037 | 1037 |
| 2019-10-04 | 1008 | 491 | 1037 | 1037 |
| 2019-10-04 | 956 | 491 | 1037 | 1037 |
| 2019-10-04 | 956 | 491 | 1037 | 1037 |
| 2019-10-05 | 959 | 491 | 1037 | 1037 |
| 2019-10-05 | 963 | 491 | 1037 | 1037 |
| 2019-10-05 | 888 | 491 | 1037 | 1037 |
| 2019-10-05 | 954 | 491 | 1037 | 1037 |
| 2019-10-05 | 941 | 491 | 1037 | 1037 |
| 2019-10-05 | 890 | 491 | 1037 | 1037 |
| 2019-10-06 | 890 | 491 | 1037 | 1037 |
| 2019-10-06 | 962 | 491 | 1037 | 1037 |
| 2019-10-06 | 925 | 491 | 1037 | 1037 |
| 2019-10-06 | 922 | 491 | 1037 | 1037 |
| 2019-10-06 | 883 | 491 | 1037 | 1037 |
| 2019-10-06 | 892 | 491 | 1037 | 1037 |
| 2019-10-07 | 964 | 491 | 1041 | 1041 |
| 2019-10-07 | 965 | 491 | 1041 | 1041 |
| 2019-10-07 | 950 | 491 | 1041 | 1041 |
| 2019-10-07 | 958 | 491 | 1041 | 1041 |
| 2019-10-07 | 950 | 491 | 1041 | 1041 |
| 2019-10-07 | 958 | 491 | 1041 | 1041 |
| 2019-10-08 | 926 | 491 | 1041 | 1041 |
| 2019-10-08 | 970 | 491 | 1041 | 1041 |
| 2019-10-08 | 1003 | 491 | 1041 | 1041 |
| 2019-10-08 | 973 | 491 | 1041 | 1041 |
| 2019-10-08 | 957 | 491 | 1041 | 1041 |
| 2019-10-08 | 958 | 491 | 1041 | 1041 |
| 2019-10-09 | 970 | 491 | 1041 | 1041 |
| 2019-10-09 | 972 | 491 | 1041 | 1041 |
| 2019-10-09 | 1030 | 491 | 1041 | 1041 |
| 2019-10-09 | 1031 | 491 | 1041 | 1041 |
| 2019-10-09 | 960 | 491 | 1041 | 1041 |
| 2019-10-09 | 906 | 491 | 1041 | 1041 |
| 2019-10-10 | 969 | 491 | 1041 | 1041 |
| 2019-10-10 | 1003 | 491 | 1041 | 1041 |
| 2019-10-10 | 1015 | 491 | 1041 | 1041 |
| 2019-10-10 | 1006 | 491 | 1041 | 1041 |
| 2019-10-10 | 960 | 491 | 1041 | 1041 |
| 2019-10-10 | 959 | 491 | 1041 | 1041 |
| 2019-10-11 | 925 | 491 | 1041 | 1041 |
| 2019-10-11 | 1004 | 491 | 1041 | 1041 |
| 2019-10-11 | 1016 | 491 | 1041 | 1041 |
| 2019-10-11 | 995 | 491 | 1041 | 1041 |
| 2019-10-11 | 951 | 491 | 1041 | 1041 |
| 2019-10-11 | 906 | 491 | 1041 | 1041 |
| 2019-10-12 | 970 | 491 | 1041 | 1041 |
| 2019-10-12 | 971 | 491 | 1041 | 1041 |
| 2019-10-12 | 967 | 491 | 1041 | 1041 |
| 2019-10-12 | 967 | 491 | 1041 | 1041 |
| 2019-10-12 | 943 | 491 | 1041 | 1041 |
| 2019-10-12 | 958 | 491 | 1041 | 1041 |
| 2019-10-13 | 968 | 491 | 1041 | 1041 |
| 2019-10-13 | 971 | 491 | 1041 | 1041 |
| 2019-10-13 | 1006 | 491 | 1041 | 1041 |
| 2019-10-13 | 1006 | 491 | 1041 | 1041 |
| 2019-10-13 | 956 | 491 | 1041 | 1041 |
| 2019-10-13 | 958 | 491 | 1041 | 1041 |
| 2019-10-14 | 968 | 491 | 1041 | 1041 |
| 2019-10-14 | 969 | 491 | 1041 | 1041 |
| 2019-10-14 | 963 | 491 | 1041 | 1041 |
| 2019-10-14 | 977 | 491 | 1041 | 1041 |
| 2019-10-14 | 958 | 491 | 1041 | 1041 |
| 2019-10-14 | 960 | 491 | 1041 | 1041 |
| 2019-10-15 | 971 | 491 | 1041 | 1041 |
| 2019-10-15 | 972 | 491 | 1041 | 1041 |
| 2019-10-15 | 959 | 491 | 1041 | 1041 |
| 2019-10-15 | 960 | 491 | 1041 | 1041 |
| 2019-10-15 | 960 | 491 | 1041 | 1041 |
| 2019-10-15 | 961 | 491 | 1041 | 1041 |
| 2019-10-16 | 973 | 491 | 1041 | 1041 |
| 2019-10-16 | 1000 | 491 | 1041 | 1041 |
| 2019-10-16 | 1033 | 491 | 1041 | 1041 |
| 2019-10-16 | 1033 | 491 | 1041 | 1041 |
| 2019-10-16 | 1014 | 491 | 1041 | 1041 |
| 2019-10-16 | 963 | 491 | 1041 | 1041 |
| 2019-10-17 | 968 | 491 | 1041 | 1041 |
| 2019-10-17 | 969 | 491 | 1041 | 1041 |
| 2019-10-17 | 949 | 491 | 1041 | 1041 |
| 2019-10-17 | 957 | 491 | 1041 | 1041 |
| 2019-10-17 | 951 | 491 | 1041 | 1041 |
| 2019-10-17 | 960 | 491 | 1041 | 1041 |
| 2019-10-18 | 928 | 491 | 1041 | 1041 |
| 2019-10-18 | 975 | 491 | 1041 | 1041 |
| 2019-10-18 | 999 | 491 | 1041 | 1041 |
| 2019-10-18 | 1000 | 491 | 1041 | 1041 |
| 2019-10-18 | 902 | 491 | 1041 | 1041 |
| 2019-10-18 | 961 | 491 | 1041 | 1041 |
| 2019-10-19 | 953 | 491 | 1041 | 1041 |
| 2019-10-19 | 956 | 491 | 1041 | 1041 |
| 2019-10-19 | 987 | 491 | 1041 | 1041 |
| 2019-10-19 | 1016 | 491 | 1041 | 1041 |
| 2019-10-19 | 1008 | 491 | 1041 | 1041 |
| 2019-10-19 | 983 | 491 | 1041 | 1041 |
| 2019-10-20 | 966 | 491 | 1041 | 1041 |
| 2019-10-20 | 970 | 491 | 1041 | 1041 |
| 2019-10-20 | 969 | 491 | 1041 | 1041 |
| 2019-10-20 | 879 | 491 | 1041 | 1041 |
| 2019-10-20 | 948 | 491 | 1041 | 1041 |
| 2019-10-20 | 961 | 491 | 1041 | 1041 |
| 2019-10-21 | 951 | 491 | 1014 | 1014 |
| 2019-10-21 | 951 | 491 | 1014 | 1014 |
| 2019-10-21 | 993 | 491 | 1014 | 1014 |
| 2019-10-21 | 953 | 491 | 1014 | 1014 |
| 2019-10-21 | 943 | 491 | 1014 | 1014 |
| 2019-10-21 | 946 | 491 | 1014 | 1014 |
| 2019-10-22 | 951 | 491 | 1014 | 1014 |
| 2019-10-22 | 951 | 491 | 1014 | 1014 |
| 2019-10-22 | 940 | 491 | 1014 | 1014 |
| 2019-10-22 | 946 | 491 | 1014 | 1014 |
| 2019-10-22 | 941 | 491 | 1014 | 1014 |
| 2019-10-22 | 941 | 491 | 1014 | 1014 |
| 2019-10-23 | 952 | 491 | 1014 | 1014 |
| 2019-10-23 | 952 | 491 | 1014 | 1014 |
| 2019-10-23 | 947 | 491 | 1014 | 1014 |
| 2019-10-23 | 948 | 491 | 1014 | 1014 |
| 2019-10-23 | 940 | 491 | 1014 | 1014 |
| 2019-10-23 | 945 | 491 | 1014 | 1014 |
| 2019-10-24 | 954 | 491 | 1014 | 1014 |
| 2019-10-24 | 955 | 491 | 1014 | 1014 |
| 2019-10-24 | 992 | 491 | 1014 | 1014 |
| 2019-10-24 | 993 | 491 | 1014 | 1014 |
| 2019-10-24 | 945 | 491 | 1014 | 1014 |
| 2019-10-24 | 943 | 491 | 1014 | 1014 |
| 2019-10-25 | 945 | 491 | 1014 | 1014 |
| 2019-10-25 | 949 | 491 | 1014 | 1014 |
| 2019-10-25 | 984 | 491 | 1014 | 1014 |
| 2019-10-25 | 993 | 491 | 1014 | 1014 |
| 2019-10-25 | 937 | 491 | 1014 | 1014 |
| 2019-10-25 | 905 | 491 | 1014 | 1014 |
| 2019-10-26 | 912 | 491 | 1014 | 1014 |
| 2019-10-26 | 912 | 491 | 1014 | 1014 |
| 2019-10-26 | 958 | 491 | 1014 | 1014 |
| 2019-10-26 | 956 | 491 | 1014 | 1014 |
| 2019-10-26 | 885 | 491 | 1014 | 1014 |
| 2019-10-26 | 892 | 491 | 1014 | 1014 |
| 2019-10-27 | 955 | 491 | 1014 | 1014 |
| 2019-10-27 | 955 | 491 | 1014 | 1014 |
| 2019-10-27 | 949 | 491 | 1014 | 1014 |
| 2019-10-27 | 944 | 491 | 1014 | 1014 |
| 2019-10-27 | 944 | 491 | 1014 | 1014 |
| 2019-10-27 | 947 | 491 | 1014 | 1014 |
| 2019-10-28 | 973 | 491 | 1047 | 1047 |
| 2019-10-28 | 971 | 491 | 1047 | 1047 |
| 2019-10-28 | 965 | 491 | 1047 | 1047 |
| 2019-10-28 | 966 | 491 | 1047 | 1047 |
| 2019-10-28 | 959 | 491 | 1047 | 1047 |
| 2019-10-28 | 960 | 491 | 1047 | 1047 |
| 2019-10-29 | 975 | 491 | 1047 | 1047 |
| 2019-10-29 | 970 | 491 | 1047 | 1047 |
| 2019-10-29 | 966 | 491 | 1047 | 1047 |
| 2019-10-29 | 969 | 491 | 1047 | 1047 |
| 2019-10-29 | 954 | 491 | 1047 | 1047 |
| 2019-10-29 | 961 | 491 | 1047 | 1047 |
| 2019-10-30 | 975 | 491 | 1047 | 1047 |
| 2019-10-30 | 973 | 491 | 1047 | 1047 |
| 2019-10-30 | 962 | 491 | 1047 | 1047 |
| 2019-10-30 | 973 | 491 | 1047 | 1047 |
| 2019-10-30 | 966 | 491 | 1047 | 1047 |
| 2019-10-30 | 968 | 491 | 1047 | 1047 |
| 2019-10-31 | 928 | 491 | 1047 | 1047 |
| 2019-10-31 | 966 | 491 | 1047 | 1047 |
| 2019-10-31 | 918 | 491 | 1047 | 1047 |
| 2019-10-31 | 923 | 491 | 1047 | 1047 |
| 2019-10-31 | 894 | 491 | 1047 | 1047 |
| 2019-10-31 | 899 | 491 | 1047 | 1047 |
| 2019-11-01 | 972 | 490 | 1047 | 1047 |
| 2019-11-01 | 972 | 490 | 1047 | 1047 |
| 2019-11-01 | 1012 | 490 | 1047 | 1047 |
| 2019-11-01 | 1036 | 490 | 1047 | 1047 |
| 2019-11-01 | 905 | 490 | 1047 | 1047 |
| 2019-11-01 | 925 | 490 | 1047 | 1047 |
| 2019-11-02 | 929 | 490 | 1047 | 1047 |
| 2019-11-02 | 930 | 490 | 1047 | 1047 |
| 2019-11-02 | 1011 | 490 | 1047 | 1047 |
| 2019-11-02 | 1004 | 490 | 1047 | 1047 |
| 2019-11-02 | 976 | 490 | 1047 | 1047 |
| 2019-11-02 | 927 | 490 | 1047 | 1047 |
| 2019-11-03 | 930 | 490 | 1047 | 1047 |
| 2019-11-03 | 930 | 490 | 1047 | 1047 |
| 2019-11-03 | 970 | 490 | 1047 | 1047 |
| 2019-11-03 | 960 | 490 | 1047 | 1047 |
| 2019-11-03 | 950 | 490 | 1047 | 1047 |
| 2019-11-03 | 923 | 490 | 1047 | 1047 |
| 2019-11-04 | 972 | 490 | 1044 | 1044 |
| 2019-11-04 | 991 | 490 | 1044 | 1044 |
| 2019-11-04 | 1031 | 490 | 1044 | 1044 |
| 2019-11-04 | 1008 | 490 | 1044 | 1044 |
| 2019-11-04 | 955 | 490 | 1044 | 1044 |
| 2019-11-04 | 969 | 490 | 1044 | 1044 |
| 2019-11-05 | 971 | 490 | 1044 | 1044 |
| 2019-11-05 | 970 | 490 | 1044 | 1044 |
| 2019-11-05 | 958 | 490 | 1044 | 1044 |
| 2019-11-05 | 955 | 490 | 1044 | 1044 |
| 2019-11-05 | 958 | 490 | 1044 | 1044 |
| 2019-11-05 | 961 | 490 | 1044 | 1044 |
| 2019-11-06 | 972 | 490 | 1044 | 1044 |
| 2019-11-06 | 972 | 490 | 1044 | 1044 |
| 2019-11-06 | 956 | 490 | 1044 | 1044 |
| 2019-11-06 | 958 | 490 | 1044 | 1044 |
| 2019-11-06 | 958 | 490 | 1044 | 1044 |
| 2019-11-06 | 959 | 490 | 1044 | 1044 |
| 2019-11-07 | 972 | 490 | 1044 | 1044 |
| 2019-11-07 | 971 | 490 | 1044 | 1044 |
| 2019-11-07 | 960 | 490 | 1044 | 1044 |
| 2019-11-07 | 1032 | 490 | 1044 | 1044 |
| 2019-11-07 | 1019 | 490 | 1044 | 1044 |
| 2019-11-07 | 964 | 490 | 1044 | 1044 |
| 2019-11-08 | 921 | 490 | 1044 | 1044 |
| 2019-11-08 | 969 | 490 | 1044 | 1044 |
| 2019-11-08 | 957 | 490 | 1044 | 1044 |
| 2019-11-08 | 962 | 490 | 1044 | 1044 |
| 2019-11-08 | 958 | 490 | 1044 | 1044 |
| 2019-11-08 | 959 | 490 | 1044 | 1044 |
| 2019-11-09 | 973 | 490 | 1044 | 1044 |
| 2019-11-09 | 974 | 490 | 1044 | 1044 |
| 2019-11-09 | 960 | 490 | 1044 | 1044 |
| 2019-11-09 | 889 | 490 | 1044 | 1044 |
| 2019-11-09 | 894 | 490 | 1044 | 1044 |
| 2019-11-09 | 967 | 490 | 1044 | 1044 |
| 2019-11-10 | 910 | 490 | 1044 | 1044 |
| 2019-11-10 | 972 | 490 | 1044 | 1044 |
| 2019-11-10 | 968 | 490 | 1044 | 1044 |
| 2019-11-10 | 910 | 490 | 1044 | 1044 |
| 2019-11-10 | 952 | 490 | 1044 | 1044 |
| 2019-11-10 | 960 | 490 | 1044 | 1044 |
| 2019-11-11 | 910 | 490 | 1048 | 1048 |
| 2019-11-11 | 935 | 490 | 1048 | 1048 |
| 2019-11-11 | 1010 | 490 | 1048 | 1048 |
| 2019-11-11 | 1009 | 490 | 1048 | 1048 |
| 2019-11-11 | 1007 | 490 | 1048 | 1048 |
| 2019-11-11 | 926 | 490 | 1048 | 1048 |
| 2019-11-12 | 929 | 490 | 1048 | 1048 |
| 2019-11-12 | 1034 | 490 | 1048 | 1048 |
| 2019-11-12 | 1041 | 490 | 1048 | 1048 |
| 2019-11-12 | 1040 | 490 | 1048 | 1048 |
| 2019-11-12 | 1004 | 490 | 1048 | 1048 |
| 2019-11-12 | 964 | 490 | 1048 | 1048 |
| 2019-11-13 | 975 | 490 | 1048 | 1048 |
| 2019-11-13 | 975 | 490 | 1048 | 1048 |
| 2019-11-13 | 961 | 490 | 1048 | 1048 |
| 2019-11-13 | 961 | 490 | 1048 | 1048 |
| 2019-11-13 | 955 | 490 | 1048 | 1048 |
| 2019-11-13 | 964 | 490 | 1048 | 1048 |
| 2019-11-14 | 956 | 490 | 1039 | 1039 |
| 2019-11-14 | 956 | 490 | 1039 | 1039 |
| 2019-11-14 | 956 | 490 | 1039 | 1039 |
| 2019-11-14 | 956 | 490 | 1039 | 1039 |
| 2019-11-14 | 956 | 490 | 1039 | 1039 |
| 2019-11-14 | 956 | 490 | 1039 | 1039 |
| 2019-11-15 | 956 | 490 | 1039 | 1039 |
| 2019-11-15 | 956 | 490 | 1039 | 1039 |
| 2019-11-15 | 956 | 490 | 1039 | 1039 |
| 2019-11-15 | 956 | 490 | 1039 | 1039 |
| 2019-11-15 | 956 | 490 | 1039 | 1039 |
| 2019-11-15 | 956 | 490 | 1039 | 1039 |
| 2019-11-16 | 973 | 490 | 1048 | 1048 |
| 2019-11-16 | 972 | 490 | 1048 | 1048 |
| 2019-11-16 | 968 | 490 | 1048 | 1048 |
| 2019-11-16 | 964 | 490 | 1048 | 1048 |
| 2019-11-16 | 957 | 490 | 1048 | 1048 |
| 2019-11-16 | 960 | 490 | 1048 | 1048 |
| 2019-11-17 | 973 | 490 | 1048 | 1048 |
| 2019-11-17 | 972 | 490 | 1048 | 1048 |
| 2019-11-17 | 968 | 490 | 1048 | 1048 |
| 2019-11-17 | 954 | 490 | 1048 | 1048 |
| 2019-11-17 | 953 | 490 | 1048 | 1048 |
| 2019-11-17 | 960 | 490 | 1048 | 1048 |
| 2019-11-18 | 974 | 490 | 1049 | 1049 |
| 2019-11-18 | 974 | 490 | 1049 | 1049 |
| 2019-11-18 | 1011 | 490 | 1049 | 1049 |
| 2019-11-18 | 971 | 490 | 1049 | 1049 |
| 2019-11-18 | 1005 | 490 | 1049 | 1049 |
| 2019-11-18 | 912 | 490 | 1049 | 1049 |
| 2019-11-19 | 974 | 490 | 1049 | 1049 |
| 2019-11-19 | 973 | 490 | 1049 | 1049 |
| 2019-11-19 | 956 | 490 | 1049 | 1049 |
| 2019-11-19 | 960 | 490 | 1049 | 1049 |
| 2019-11-19 | 955 | 490 | 1049 | 1049 |
| 2019-11-19 | 960 | 490 | 1049 | 1049 |
| 2019-11-20 | 972 | 490 | 1049 | 1049 |
| 2019-11-20 | 971 | 490 | 1049 | 1049 |
| 2019-11-20 | 960 | 490 | 1049 | 1049 |
| 2019-11-20 | 962 | 490 | 1049 | 1049 |
| 2019-11-20 | 961 | 490 | 1049 | 1049 |
| 2019-11-20 | 961 | 490 | 1049 | 1049 |
| 2019-11-21 | 922 | 490 | 1049 | 1049 |
| 2019-11-21 | 972 | 490 | 1049 | 1049 |
| 2019-11-21 | 960 | 490 | 1049 | 1049 |
| 2019-11-21 | 961 | 490 | 1049 | 1049 |
| 2019-11-21 | 958 | 490 | 1049 | 1049 |
| 2019-11-21 | 963 | 490 | 1049 | 1049 |
| 2019-11-22 | 974 | 490 | 1049 | 1049 |
| 2019-11-22 | 1011 | 490 | 1049 | 1049 |
| 2019-11-22 | 1024 | 490 | 1049 | 1049 |
| 2019-11-22 | 1008 | 490 | 1049 | 1049 |
| 2019-11-22 | 1002 | 490 | 1049 | 1049 |
| 2019-11-22 | 911 | 490 | 1049 | 1049 |
| 2019-11-23 | 975 | 490 | 1049 | 1049 |
| 2019-11-23 | 976 | 490 | 1049 | 1049 |
| 2019-11-23 | 975 | 490 | 1049 | 1049 |
| 2019-11-23 | 963 | 490 | 1049 | 1049 |
| 2019-11-23 | 900 | 490 | 1049 | 1049 |
| 2019-11-23 | 961 | 490 | 1049 | 1049 |
| 2019-11-24 | 973 | 490 | 1049 | 1049 |
| 2019-11-24 | 973 | 490 | 1049 | 1049 |
| 2019-11-24 | 967 | 490 | 1049 | 1049 |
| 2019-11-24 | 899 | 490 | 1049 | 1049 |
| 2019-11-24 | 958 | 490 | 1049 | 1049 |
| 2019-11-24 | 894 | 490 | 1049 | 1049 |
| 2019-11-25 | 902 | 490 | 1045 | 1045 |
| 2019-11-25 | 967 | 490 | 1045 | 1045 |
| 2019-11-25 | 954 | 490 | 1045 | 1045 |
| 2019-11-25 | 903 | 490 | 1045 | 1045 |
| 2019-11-25 | 895 | 490 | 1045 | 1045 |
| 2019-11-25 | 899 | 490 | 1045 | 1045 |
| 2019-11-26 | 923 | 490 | 1045 | 1045 |
| 2019-11-26 | 1001 | 490 | 1045 | 1045 |
| 2019-11-26 | 1002 | 490 | 1045 | 1045 |
| 2019-11-26 | 1001 | 490 | 1045 | 1045 |
| 2019-11-26 | 999 | 490 | 1045 | 1045 |
| 2019-11-26 | 902 | 490 | 1045 | 1045 |
| 2019-11-27 | 924 | 490 | 1045 | 1045 |
| 2019-11-27 | 1031 | 490 | 1045 | 1045 |
| 2019-11-27 | 1037 | 490 | 1045 | 1045 |
| 2019-11-27 | 1002 | 490 | 1045 | 1045 |
| 2019-11-27 | 981 | 490 | 1045 | 1045 |
| 2019-11-27 | 907 | 490 | 1045 | 1045 |
| 2019-11-28 | 925 | 490 | 1045 | 1045 |
| 2019-11-28 | 1004 | 490 | 1045 | 1045 |
| 2019-11-28 | 1037 | 490 | 1045 | 1045 |
| 2019-11-28 | 1004 | 490 | 1045 | 1045 |
| 2019-11-28 | 977 | 490 | 1045 | 1045 |
| 2019-11-28 | 899 | 490 | 1045 | 1045 |
| 2019-11-29 | 917 | 490 | 1045 | 1045 |
| 2019-11-29 | 967 | 490 | 1045 | 1045 |
| 2019-11-29 | 953 | 490 | 1045 | 1045 |
| 2019-11-29 | 957 | 490 | 1045 | 1045 |
| 2019-11-29 | 953 | 490 | 1045 | 1045 |
| 2019-11-29 | 956 | 490 | 1045 | 1045 |
| 2019-11-30 | 967 | 490 | 1045 | 1045 |
| 2019-11-30 | 967 | 490 | 1045 | 1045 |
| 2019-11-30 | 965 | 490 | 1045 | 1045 |
| 2019-11-30 | 955 | 490 | 1045 | 1045 |
| 2019-11-30 | 952 | 490 | 1045 | 1045 |
| 2019-11-30 | 920 | 490 | 1045 | 1045 |
| 2019-12-01 | 957 | 496 | 1045 | 1045 |
| 2019-12-01 | 977 | 496 | 1045 | 1045 |
| 2019-12-01 | 989 | 496 | 1045 | 1045 |
| 2019-12-01 | 905 | 496 | 1045 | 1045 |
| 2019-12-01 | 920 | 496 | 1045 | 1045 |
| 2019-12-01 | 924 | 496 | 1045 | 1045 |
| 2019-12-02 | 905 | 496 | 1048 | 1048 |
| 2019-12-02 | 907 | 496 | 1048 | 1048 |
| 2019-12-02 | 906 | 496 | 1048 | 1048 |
| 2019-12-02 | 905 | 496 | 1048 | 1048 |
| 2019-12-02 | 890 | 496 | 1048 | 1048 |
| 2019-12-02 | 891 | 496 | 1048 | 1048 |
| 2019-12-03 | 972 | 496 | 1048 | 1048 |
| 2019-12-03 | 963 | 496 | 1048 | 1048 |
| 2019-12-03 | 894 | 496 | 1048 | 1048 |
| 2019-12-03 | 907 | 496 | 1048 | 1048 |
| 2019-12-03 | 893 | 496 | 1048 | 1048 |
| 2019-12-03 | 887 | 496 | 1048 | 1048 |
| 2019-12-04 | 986 | 496 | 1047 | 1047 |
| 2019-12-04 | 985 | 496 | 1047 | 1047 |
| 2019-12-04 | 978 | 496 | 1047 | 1047 |
| 2019-12-04 | 979 | 496 | 1047 | 1047 |
| 2019-12-04 | 976 | 496 | 1047 | 1047 |
| 2019-12-04 | 977 | 496 | 1047 | 1047 |
| 2019-12-05 | 986 | 496 | 1047 | 1047 |
| 2019-12-05 | 985 | 496 | 1047 | 1047 |
| 2019-12-05 | 979 | 496 | 1047 | 1047 |
| 2019-12-05 | 979 | 496 | 1047 | 1047 |
| 2019-12-05 | 977 | 496 | 1047 | 1047 |
| 2019-12-05 | 953 | 496 | 1047 | 1047 |
| 2019-12-06 | 991 | 496 | 1047 | 1047 |
| 2019-12-06 | 991 | 496 | 1047 | 1047 |
| 2019-12-06 | 991 | 496 | 1047 | 1047 |
| 2019-12-06 | 990 | 496 | 1047 | 1047 |
| 2019-12-06 | 990 | 496 | 1047 | 1047 |
| 2019-12-06 | 991 | 496 | 1047 | 1047 |
| 2019-12-07 | 956 | 496 | 1047 | 1047 |
| 2019-12-07 | 1001 | 496 | 1047 | 1047 |
| 2019-12-07 | 1025 | 496 | 1047 | 1047 |
| 2019-12-07 | 1026 | 496 | 1047 | 1047 |
| 2019-12-07 | 977 | 496 | 1047 | 1047 |
| 2019-12-07 | 953 | 496 | 1047 | 1047 |
| 2019-12-08 | 957 | 496 | 1047 | 1047 |
| 2019-12-08 | 997 | 496 | 1047 | 1047 |
| 2019-12-08 | 1032 | 496 | 1047 | 1047 |
| 2019-12-08 | 1028 | 496 | 1047 | 1047 |
| 2019-12-08 | 980 | 496 | 1047 | 1047 |
| 2019-12-08 | 953 | 496 | 1047 | 1047 |
| 2019-12-09 | 932 | 496 | 1002 | 1002 |
| 2019-12-09 | 1005 | 496 | 1002 | 1005 |
| 2019-12-09 | 1038 | 496 | 1002 | 1038 |
| 2019-12-09 | 1006 | 496 | 1002 | 1006 |
| 2019-12-09 | 996 | 496 | 1002 | 1002 |
| 2019-12-09 | 965 | 496 | 1002 | 1002 |
| 2019-12-10 | 965 | 496 | 1002 | 1002 |
| 2019-12-10 | 962 | 496 | 1002 | 1002 |
| 2019-12-10 | 1008 | 496 | 1002 | 1008 |
| 2019-12-10 | 1004 | 496 | 1002 | 1004 |
| 2019-12-10 | 997 | 496 | 1002 | 1002 |
| 2019-12-10 | 936 | 496 | 1002 | 1002 |
| 2019-12-11 | 965 | 496 | 1002 | 1002 |
| 2019-12-11 | 964 | 496 | 1002 | 1002 |
| 2019-12-11 | 958 | 496 | 1002 | 1002 |
| 2019-12-11 | 959 | 496 | 1002 | 1002 |
| 2019-12-11 | 956 | 496 | 1002 | 1002 |
| 2019-12-11 | 964 | 496 | 1002 | 1002 |
| 2019-12-12 | 965 | 496 | 1002 | 1002 |
| 2019-12-12 | 965 | 496 | 1002 | 1002 |
| 2019-12-12 | 1032 | 496 | 1002 | 1032 |
| 2019-12-12 | 1004 | 496 | 1002 | 1004 |
| 2019-12-12 | 948 | 496 | 1002 | 1002 |
| 2019-12-12 | 933 | 496 | 1002 | 1002 |
| 2019-12-13 | 966 | 496 | 1002 | 1002 |
| 2019-12-13 | 996 | 496 | 1002 | 1002 |
| 2019-12-13 | 1037 | 496 | 1002 | 1037 |
| 2019-12-13 | 1036 | 496 | 1002 | 1036 |
| 2019-12-13 | 941 | 496 | 1002 | 1002 |
| 2019-12-13 | 933 | 496 | 1002 | 1002 |
| 2019-12-14 | 910 | 496 | 1002 | 1002 |
| 2019-12-14 | 911 | 496 | 1002 | 1002 |
| 2019-12-14 | 912 | 496 | 1002 | 1002 |
| 2019-12-14 | 910 | 496 | 1002 | 1002 |
| 2019-12-14 | 905 | 496 | 1002 | 1002 |
| 2019-12-14 | 905 | 496 | 1002 | 1002 |
| 2019-12-15 | 932 | 496 | 1002 | 1002 |
| 2019-12-15 | 955 | 496 | 1002 | 1002 |
| 2019-12-15 | 1007 | 496 | 1002 | 1007 |
| 2019-12-15 | 993 | 496 | 1002 | 1002 |
| 2019-12-15 | 934 | 496 | 1002 | 1002 |
| 2019-12-15 | 937 | 496 | 1002 | 1002 |
| 2019-12-16 | 932 | 496 | 1002 | 1002 |
| 2019-12-16 | 1007 | 496 | 1002 | 1007 |
| 2019-12-16 | 1014 | 496 | 1002 | 1014 |
| 2019-12-16 | 962 | 496 | 1002 | 1002 |
| 2019-12-16 | 955 | 496 | 1002 | 1002 |
| 2019-12-16 | 952 | 496 | 1002 | 1002 |
| 2019-12-17 | 965 | 496 | 1002 | 1002 |
| 2019-12-17 | 1026 | 496 | 1002 | 1026 |
| 2019-12-17 | 1036 | 496 | 1002 | 1036 |
| 2019-12-17 | 1016 | 496 | 1002 | 1016 |
| 2019-12-17 | 954 | 496 | 1002 | 1002 |
| 2019-12-17 | 953 | 496 | 1002 | 1002 |
| 2019-12-18 | 962 | 496 | 1003 | 1003 |
| 2019-12-18 | 962 | 496 | 1003 | 1003 |
| 2019-12-18 | 958 | 496 | 1003 | 1003 |
| 2019-12-18 | 957 | 496 | 1003 | 1003 |
| 2019-12-18 | 956 | 496 | 1003 | 1003 |
| 2019-12-18 | 968 | 496 | 1003 | 1003 |
| 2019-12-19 | 935 | 496 | 1003 | 1003 |
| 2019-12-19 | 1027 | 496 | 1003 | 1027 |
| 2019-12-19 | 1005 | 496 | 1003 | 1005 |
| 2019-12-19 | 967 | 496 | 1003 | 1003 |
| 2019-12-19 | 935 | 496 | 1003 | 1003 |
| 2019-12-19 | 941 | 496 | 1003 | 1003 |
| 2019-12-20 | 938 | 496 | 1003 | 1003 |
| 2019-12-20 | 1031 | 496 | 1003 | 1031 |
| 2019-12-20 | 1037 | 496 | 1003 | 1037 |
| 2019-12-20 | 1007 | 496 | 1003 | 1007 |
| 2019-12-20 | 935 | 496 | 1003 | 1003 |
| 2019-12-20 | 941 | 496 | 1003 | 1003 |
| 2019-12-21 | 931 | 496 | 1003 | 1003 |
| 2019-12-21 | 935 | 496 | 1003 | 1003 |
| 2019-12-21 | 1006 | 496 | 1003 | 1006 |
| 2019-12-21 | 1005 | 496 | 1003 | 1005 |
| 2019-12-21 | 939 | 496 | 1003 | 1003 |
| 2019-12-21 | 941 | 496 | 1003 | 1003 |
| 2019-12-22 | 932 | 496 | 1003 | 1003 |
| 2019-12-22 | 965 | 496 | 1003 | 1003 |
| 2019-12-22 | 997 | 496 | 1003 | 1003 |
| 2019-12-22 | 1005 | 496 | 1003 | 1005 |
| 2019-12-22 | 942 | 496 | 1003 | 1003 |
| 2019-12-22 | 938 | 496 | 1003 | 1003 |
| 2019-12-23 | 935 | 496 | 1003 | 1003 |
| 2019-12-23 | 927 | 496 | 1003 | 1003 |
| 2019-12-23 | 1005 | 496 | 1003 | 1005 |
| 2019-12-23 | 1006 | 496 | 1003 | 1006 |
| 2019-12-23 | 939 | 496 | 1003 | 1003 |
| 2019-12-23 | 940 | 496 | 1003 | 1003 |
| 2019-12-24 | 930 | 496 | 1003 | 1003 |
| 2019-12-24 | 970 | 496 | 1003 | 1003 |
| 2019-12-24 | 1009 | 496 | 1003 | 1009 |
| 2019-12-24 | 1007 | 496 | 1003 | 1007 |
| 2019-12-24 | 940 | 496 | 1003 | 1003 |
| 2019-12-24 | 941 | 496 | 1003 | 1003 |
| 2019-12-25 | 935 | 496 | 1003 | 1003 |
| 2019-12-25 | 926 | 496 | 1003 | 1003 |
| 2019-12-25 | 963 | 496 | 1003 | 1003 |
| 2019-12-25 | 906 | 496 | 1003 | 1003 |
| 2019-12-25 | 892 | 496 | 1003 | 1003 |
| 2019-12-25 | 902 | 496 | 1003 | 1003 |
| 2019-12-26 | 963 | 496 | 1003 | 1003 |
| 2019-12-26 | 962 | 496 | 1003 | 1003 |
| 2019-12-26 | 960 | 496 | 1003 | 1003 |
| 2019-12-26 | 914 | 496 | 1003 | 1003 |
| 2019-12-26 | 955 | 496 | 1003 | 1003 |
| 2019-12-26 | 957 | 496 | 1003 | 1003 |
| 2019-12-27 | 911 | 496 | 1003 | 1003 |
| 2019-12-27 | 963 | 496 | 1003 | 1003 |
| 2019-12-27 | 960 | 496 | 1003 | 1003 |
| 2019-12-27 | 894 | 496 | 1003 | 1003 |
| 2019-12-27 | 893 | 496 | 1003 | 1003 |
| 2019-12-27 | 899 | 496 | 1003 | 1003 |
| 2019-12-28 | 963 | 496 | 1003 | 1003 |
| 2019-12-28 | 962 | 496 | 1003 | 1003 |
| 2019-12-28 | 960 | 496 | 1003 | 1003 |
| 2019-12-28 | 901 | 496 | 1003 | 1003 |
| 2019-12-28 | 895 | 496 | 1003 | 1003 |
| 2019-12-28 | 958 | 496 | 1003 | 1003 |
| 2019-12-29 | 962 | 496 | 1003 | 1003 |
| 2019-12-29 | 962 | 496 | 1003 | 1003 |
| 2019-12-29 | 960 | 496 | 1003 | 1003 |
| 2019-12-29 | 898 | 496 | 1003 | 1003 |
| 2019-12-29 | 896 | 496 | 1003 | 1003 |
| 2019-12-29 | 955 | 496 | 1003 | 1003 |
| 2019-12-30 | 990 | 496 | 1049 | 1049 |
| 2019-12-30 | 990 | 496 | 1049 | 1049 |
| 2019-12-30 | 1029 | 496 | 1049 | 1049 |
| 2019-12-30 | 943 | 496 | 1049 | 1049 |
| 2019-12-30 | 954 | 496 | 1049 | 1049 |
| 2019-12-30 | 987 | 496 | 1049 | 1049 |
| 2019-12-31 | 986 | 496 | 1049 | 1049 |
| 2019-12-31 | 987 | 496 | 1049 | 1049 |
| 2019-12-31 | 978 | 496 | 1049 | 1049 |
| 2019-12-31 | 973 | 496 | 1049 | 1049 |
| 2019-12-31 | 978 | 496 | 1049 | 1049 |
| 2019-12-31 | 978 | 496 | 1049 | 1049 |
| 2020-01-01 | 986 | 495 | 1049 | 1049 |
| 2020-01-01 | 986 | 495 | 1049 | 1049 |
| 2020-01-01 | 985 | 495 | 1049 | 1049 |
| 2020-01-01 | 971 | 495 | 1049 | 1049 |
| 2020-01-01 | 977 | 495 | 1049 | 1049 |
| 2020-01-01 | 983 | 495 | 1049 | 1049 |
| 2020-01-02 | 940 | 495 | 1049 | 1049 |
| 2020-01-02 | 979 | 495 | 1049 | 1049 |
| 2020-01-02 | 1020 | 495 | 1049 | 1049 |
| 2020-01-02 | 1019 | 495 | 1049 | 1049 |
| 2020-01-02 | 1018 | 495 | 1049 | 1049 |
| 2020-01-02 | 987 | 495 | 1049 | 1049 |
| 2020-01-03 | 953 | 495 | 1049 | 1049 |
| 2020-01-03 | 977 | 495 | 1049 | 1049 |
| 2020-01-03 | 1051 | 495 | 1049 | 1051 |
| 2020-01-03 | 1024 | 495 | 1049 | 1049 |
| 2020-01-03 | 1019 | 495 | 1049 | 1049 |
| 2020-01-03 | 985 | 495 | 1049 | 1049 |
| 2020-01-04 | 979 | 495 | 1049 | 1049 |
| 2020-01-04 | 988 | 495 | 1049 | 1049 |
| 2020-01-04 | 1013 | 495 | 1049 | 1049 |
| 2020-01-04 | 984 | 495 | 1049 | 1049 |
| 2020-01-04 | 1016 | 495 | 1049 | 1049 |
| 2020-01-04 | 984 | 495 | 1049 | 1049 |
| 2020-01-05 | 987 | 495 | 1049 | 1049 |
| 2020-01-05 | 987 | 495 | 1049 | 1049 |
| 2020-01-05 | 985 | 495 | 1049 | 1049 |
| 2020-01-05 | 972 | 495 | 1049 | 1049 |
| 2020-01-05 | 972 | 495 | 1049 | 1049 |
| 2020-01-05 | 979 | 495 | 1049 | 1049 |
| 2020-01-06 | 962 | 495 | 1003 | 1003 |
| 2020-01-06 | 962 | 495 | 1003 | 1003 |
| 2020-01-06 | 957 | 495 | 1003 | 1003 |
| 2020-01-06 | 959 | 495 | 1003 | 1003 |
| 2020-01-06 | 997 | 495 | 1003 | 1003 |
| 2020-01-06 | 967 | 495 | 1003 | 1003 |
| 2020-01-07 | 963 | 495 | 1003 | 1003 |
| 2020-01-07 | 962 | 495 | 1003 | 1003 |
| 2020-01-07 | 957 | 495 | 1003 | 1003 |
| 2020-01-07 | 957 | 495 | 1003 | 1003 |
| 2020-01-07 | 996 | 495 | 1003 | 1003 |
| 2020-01-07 | 967 | 495 | 1003 | 1003 |
| 2020-01-08 | 964 | 495 | 1003 | 1003 |
| 2020-01-08 | 964 | 495 | 1003 | 1003 |
| 2020-01-08 | 1004 | 495 | 1003 | 1004 |
| 2020-01-08 | 998 | 495 | 1003 | 1003 |
| 2020-01-08 | 953 | 495 | 1003 | 1003 |
| 2020-01-08 | 953 | 495 | 1003 | 1003 |
| 2020-01-09 | 964 | 495 | 1003 | 1003 |
| 2020-01-09 | 1022 | 495 | 1003 | 1022 |
| 2020-01-09 | 1031 | 495 | 1003 | 1031 |
| 2020-01-09 | 1031 | 495 | 1003 | 1031 |
| 2020-01-09 | 976 | 495 | 1003 | 1003 |
| 2020-01-09 | 967 | 495 | 1003 | 1003 |
| 2020-01-10 | 964 | 495 | 1003 | 1003 |
| 2020-01-10 | 964 | 495 | 1003 | 1003 |
| 2020-01-10 | 1005 | 495 | 1003 | 1005 |
| 2020-01-10 | 999 | 495 | 1003 | 1003 |
| 2020-01-10 | 954 | 495 | 1003 | 1003 |
| 2020-01-10 | 952 | 495 | 1003 | 1003 |
| 2020-01-11 | 963 | 495 | 1003 | 1003 |
| 2020-01-11 | 963 | 495 | 1003 | 1003 |
| 2020-01-11 | 983 | 495 | 1003 | 1003 |
| 2020-01-11 | 987 | 495 | 1003 | 1003 |
| 2020-01-11 | 969 | 495 | 1003 | 1003 |
| 2020-01-11 | 936 | 495 | 1003 | 1003 |
| 2020-01-12 | 925 | 495 | 1003 | 1003 |
| 2020-01-12 | 973 | 495 | 1003 | 1003 |
| 2020-01-12 | 1001 | 495 | 1003 | 1003 |
| 2020-01-12 | 1000 | 495 | 1003 | 1003 |
| 2020-01-12 | 1014 | 495 | 1003 | 1014 |
| 2020-01-12 | 937 | 495 | 1003 | 1003 |
| 2020-01-13 | 983 | 495 | 1048 | 1048 |
| 2020-01-13 | 984 | 495 | 1048 | 1048 |
| 2020-01-13 | 1018 | 495 | 1048 | 1048 |
| 2020-01-13 | 1024 | 495 | 1048 | 1048 |
| 2020-01-13 | 1021 | 495 | 1048 | 1048 |
| 2020-01-13 | 949 | 495 | 1048 | 1048 |
| 2020-01-14 | 949 | 495 | 1048 | 1048 |
| 2020-01-14 | 977 | 495 | 1048 | 1048 |
| 2020-01-14 | 1048 | 495 | 1048 | 1048 |
| 2020-01-14 | 1048 | 495 | 1048 | 1048 |
| 2020-01-14 | 1011 | 495 | 1048 | 1048 |
| 2020-01-14 | 952 | 495 | 1048 | 1048 |
| 2020-01-15 | 949 | 495 | 1048 | 1048 |
| 2020-01-15 | 980 | 495 | 1048 | 1048 |
| 2020-01-15 | 1022 | 495 | 1048 | 1048 |
| 2020-01-15 | 1022 | 495 | 1048 | 1048 |
| 2020-01-15 | 1033 | 495 | 1048 | 1048 |
| 2020-01-15 | 984 | 495 | 1048 | 1048 |
| 2020-01-16 | 984 | 495 | 1048 | 1048 |
| 2020-01-16 | 983 | 495 | 1048 | 1048 |
| 2020-01-16 | 1023 | 495 | 1048 | 1048 |
| 2020-01-16 | 982 | 495 | 1048 | 1048 |
| 2020-01-16 | 977 | 495 | 1048 | 1048 |
| 2020-01-16 | 952 | 495 | 1048 | 1048 |
| 2020-01-17 | 950 | 495 | 1048 | 1048 |
| 2020-01-17 | 1009 | 495 | 1048 | 1048 |
| 2020-01-17 | 1048 | 495 | 1048 | 1048 |
| 2020-01-17 | 1028 | 495 | 1048 | 1048 |
| 2020-01-17 | 1015 | 495 | 1048 | 1048 |
| 2020-01-17 | 983 | 495 | 1048 | 1048 |
| 2020-01-18 | 984 | 495 | 1048 | 1048 |
| 2020-01-18 | 984 | 495 | 1048 | 1048 |
| 2020-01-18 | 976 | 495 | 1048 | 1048 |
| 2020-01-18 | 971 | 495 | 1048 | 1048 |
| 2020-01-18 | 970 | 495 | 1048 | 1048 |
| 2020-01-18 | 976 | 495 | 1048 | 1048 |
| 2020-01-19 | 985 | 495 | 1048 | 1048 |
| 2020-01-19 | 986 | 495 | 1048 | 1048 |
| 2020-01-19 | 1018 | 495 | 1048 | 1048 |
| 2020-01-19 | 1018 | 495 | 1048 | 1048 |
| 2020-01-19 | 974 | 495 | 1048 | 1048 |
| 2020-01-19 | 976 | 495 | 1048 | 1048 |
| 2020-01-20 | 986 | 495 | 1050 | 1050 |
| 2020-01-20 | 986 | 495 | 1050 | 1050 |
| 2020-01-20 | 975 | 495 | 1050 | 1050 |
| 2020-01-20 | 976 | 495 | 1050 | 1050 |
| 2020-01-20 | 974 | 495 | 1050 | 1050 |
| 2020-01-20 | 977 | 495 | 1050 | 1050 |
| 2020-01-21 | 986 | 495 | 1050 | 1050 |
| 2020-01-21 | 986 | 495 | 1050 | 1050 |
| 2020-01-21 | 976 | 495 | 1050 | 1050 |
| 2020-01-21 | 977 | 495 | 1050 | 1050 |
| 2020-01-21 | 976 | 495 | 1050 | 1050 |
| 2020-01-21 | 977 | 495 | 1050 | 1050 |
| 2020-01-22 | 985 | 495 | 1050 | 1050 |
| 2020-01-22 | 985 | 495 | 1050 | 1050 |
| 2020-01-22 | 975 | 495 | 1050 | 1050 |
| 2020-01-22 | 976 | 495 | 1050 | 1050 |
| 2020-01-22 | 976 | 495 | 1050 | 1050 |
| 2020-01-22 | 977 | 495 | 1050 | 1050 |
| 2020-01-23 | 986 | 495 | 1050 | 1050 |
| 2020-01-23 | 985 | 495 | 1050 | 1050 |
| 2020-01-23 | 976 | 495 | 1050 | 1050 |
| 2020-01-23 | 977 | 495 | 1050 | 1050 |
| 2020-01-23 | 977 | 495 | 1050 | 1050 |
| 2020-01-23 | 977 | 495 | 1050 | 1050 |
| 2020-01-24 | 985 | 495 | 1050 | 1050 |
| 2020-01-24 | 985 | 495 | 1050 | 1050 |
| 2020-01-24 | 976 | 495 | 1050 | 1050 |
| 2020-01-24 | 976 | 495 | 1050 | 1050 |
| 2020-01-24 | 976 | 495 | 1050 | 1050 |
| 2020-01-24 | 977 | 495 | 1050 | 1050 |
| 2020-01-25 | 985 | 495 | 1050 | 1050 |
| 2020-01-25 | 986 | 495 | 1050 | 1050 |
| 2020-01-25 | 974 | 495 | 1050 | 1050 |
| 2020-01-25 | 975 | 495 | 1050 | 1050 |
| 2020-01-25 | 918 | 495 | 1050 | 1050 |
| 2020-01-25 | 977 | 495 | 1050 | 1050 |
| 2020-01-26 | 979 | 495 | 1050 | 1050 |
| 2020-01-26 | 986 | 495 | 1050 | 1050 |
| 2020-01-26 | 984 | 495 | 1050 | 1050 |
| 2020-01-26 | 984 | 495 | 1050 | 1050 |
| 2020-01-26 | 951 | 495 | 1050 | 1050 |
| 2020-01-26 | 954 | 495 | 1050 | 1050 |
| 2020-01-27 | 986 | 495 | 1048 | 1048 |
| 2020-01-27 | 985 | 495 | 1048 | 1048 |
| 2020-01-27 | 1001 | 495 | 1048 | 1048 |
| 2020-01-27 | 988 | 495 | 1048 | 1048 |
| 2020-01-27 | 945 | 495 | 1048 | 1048 |
| 2020-01-27 | 954 | 495 | 1048 | 1048 |
| 2020-01-28 | 949 | 495 | 1048 | 1048 |
| 2020-01-28 | 1043 | 495 | 1048 | 1048 |
| 2020-01-28 | 1050 | 495 | 1048 | 1050 |
| 2020-01-28 | 1049 | 495 | 1048 | 1049 |
| 2020-01-28 | 1032 | 495 | 1048 | 1048 |
| 2020-01-28 | 983 | 495 | 1048 | 1048 |
| 2020-01-29 | 986 | 495 | 1048 | 1048 |
| 2020-01-29 | 1009 | 495 | 1048 | 1048 |
| 2020-01-29 | 1050 | 495 | 1048 | 1050 |
| 2020-01-29 | 1049 | 495 | 1048 | 1049 |
| 2020-01-29 | 1015 | 495 | 1048 | 1048 |
| 2020-01-29 | 984 | 495 | 1048 | 1048 |
| 2020-01-30 | 985 | 495 | 1048 | 1048 |
| 2020-01-30 | 1003 | 495 | 1048 | 1048 |
| 2020-01-30 | 1043 | 495 | 1048 | 1048 |
| 2020-01-30 | 1042 | 495 | 1048 | 1048 |
| 2020-01-30 | 1016 | 495 | 1048 | 1048 |
| 2020-01-30 | 984 | 495 | 1048 | 1048 |
| 2020-01-31 | 951 | 495 | 1048 | 1048 |
| 2020-01-31 | 984 | 495 | 1048 | 1048 |
| 2020-01-31 | 980 | 495 | 1048 | 1048 |
| 2020-01-31 | 980 | 495 | 1048 | 1048 |
| 2020-01-31 | 946 | 495 | 1048 | 1048 |
| 2020-01-31 | 949 | 495 | 1048 | 1048 |
| 2020-02-01 | 986 | 479 | 1048 | 1048 |
| 2020-02-01 | 986 | 479 | 1048 | 1048 |
| 2020-02-01 | 935 | 479 | 1048 | 1048 |
| 2020-02-01 | 931 | 479 | 1048 | 1048 |
| 2020-02-01 | 944 | 479 | 1048 | 1048 |
| 2020-02-01 | 949 | 479 | 1048 | 1048 |
| 2020-02-02 | 949 | 479 | 1048 | 1048 |
| 2020-02-02 | 983 | 479 | 1048 | 1048 |
| 2020-02-02 | 984 | 479 | 1048 | 1048 |
| 2020-02-02 | 930 | 479 | 1048 | 1048 |
| 2020-02-02 | 947 | 479 | 1048 | 1048 |
| 2020-02-02 | 953 | 479 | 1048 | 1048 |
| 2020-02-03 | 954 | 479 | 1050 | 1050 |
| 2020-02-03 | 954 | 479 | 1050 | 1050 |
| 2020-02-03 | 934 | 479 | 1050 | 1050 |
| 2020-02-03 | 934 | 479 | 1050 | 1050 |
| 2020-02-03 | 949 | 479 | 1050 | 1050 |
| 2020-02-03 | 953 | 479 | 1050 | 1050 |
| 2020-02-04 | 953 | 479 | 1050 | 1050 |
| 2020-02-04 | 952 | 479 | 1050 | 1050 |
| 2020-02-04 | 935 | 479 | 1050 | 1050 |
| 2020-02-04 | 938 | 479 | 1050 | 1050 |
| 2020-02-04 | 945 | 479 | 1050 | 1050 |
| 2020-02-04 | 947 | 479 | 1050 | 1050 |
| 2020-02-05 | 903 | 479 | 1050 | 1050 |
| 2020-02-05 | 974 | 479 | 1050 | 1050 |
| 2020-02-05 | 964 | 479 | 1050 | 1050 |
| 2020-02-05 | 962 | 479 | 1050 | 1050 |
| 2020-02-05 | 955 | 479 | 1050 | 1050 |
| 2020-02-05 | 966 | 479 | 1050 | 1050 |
| 2020-02-06 | 968 | 479 | 1050 | 1050 |
| 2020-02-06 | 960 | 479 | 1050 | 1050 |
| 2020-02-06 | 963 | 479 | 1050 | 1050 |
| 2020-02-06 | 962 | 479 | 1050 | 1050 |
| 2020-02-06 | 957 | 479 | 1050 | 1050 |
| 2020-02-06 | 966 | 479 | 1050 | 1050 |
| 2020-02-07 | 901 | 479 | 1050 | 1050 |
| 2020-02-07 | 976 | 479 | 1050 | 1050 |
| 2020-02-07 | 971 | 479 | 1050 | 1050 |
| 2020-02-07 | 975 | 479 | 1050 | 1050 |
| 2020-02-07 | 929 | 479 | 1050 | 1050 |
| 2020-02-07 | 936 | 479 | 1050 | 1050 |
| 2020-02-08 | 930 | 479 | 1050 | 1050 |
| 2020-02-08 | 980 | 479 | 1050 | 1050 |
| 2020-02-08 | 975 | 479 | 1050 | 1050 |
| 2020-02-08 | 905 | 479 | 1050 | 1050 |
| 2020-02-08 | 931 | 479 | 1050 | 1050 |
| 2020-02-08 | 937 | 479 | 1050 | 1050 |
| 2020-02-09 | 932 | 479 | 1050 | 1050 |
| 2020-02-09 | 933 | 479 | 1050 | 1050 |
| 2020-02-09 | 922 | 479 | 1050 | 1050 |
| 2020-02-09 | 915 | 479 | 1050 | 1050 |
| 2020-02-09 | 930 | 479 | 1050 | 1050 |
| 2020-02-09 | 936 | 479 | 1050 | 1050 |
| 2020-02-10 | 932 | 479 | 1048 | 1048 |
| 2020-02-10 | 930 | 479 | 1048 | 1048 |
| 2020-02-10 | 916 | 479 | 1048 | 1048 |
| 2020-02-10 | 911 | 479 | 1048 | 1048 |
| 2020-02-10 | 929 | 479 | 1048 | 1048 |
| 2020-02-10 | 934 | 479 | 1048 | 1048 |
| 2020-02-11 | 935 | 479 | 1048 | 1048 |
| 2020-02-11 | 928 | 479 | 1048 | 1048 |
| 2020-02-11 | 916 | 479 | 1048 | 1048 |
| 2020-02-11 | 917 | 479 | 1048 | 1048 |
| 2020-02-11 | 930 | 479 | 1048 | 1048 |
| 2020-02-11 | 975 | 479 | 1048 | 1048 |
| 2020-02-12 | 932 | 479 | 1048 | 1048 |
| 2020-02-12 | 969 | 479 | 1048 | 1048 |
| 2020-02-12 | 970 | 479 | 1048 | 1048 |
| 2020-02-12 | 916 | 479 | 1048 | 1048 |
| 2020-02-12 | 966 | 479 | 1048 | 1048 |
| 2020-02-12 | 975 | 479 | 1048 | 1048 |
| 2020-02-13 | 976 | 479 | 1048 | 1048 |
| 2020-02-13 | 977 | 479 | 1048 | 1048 |
| 2020-02-13 | 971 | 479 | 1048 | 1048 |
| 2020-02-13 | 972 | 479 | 1048 | 1048 |
| 2020-02-13 | 930 | 479 | 1048 | 1048 |
| 2020-02-13 | 933 | 479 | 1048 | 1048 |
| 2020-02-14 | 930 | 479 | 1048 | 1048 |
| 2020-02-14 | 964 | 479 | 1048 | 1048 |
| 2020-02-14 | 959 | 479 | 1048 | 1048 |
| 2020-02-14 | 959 | 479 | 1048 | 1048 |
| 2020-02-14 | 965 | 479 | 1048 | 1048 |
| 2020-02-14 | 938 | 479 | 1048 | 1048 |
| 2020-02-15 | 931 | 479 | 1048 | 1048 |
| 2020-02-15 | 933 | 479 | 1048 | 1048 |
| 2020-02-15 | 918 | 479 | 1048 | 1048 |
| 2020-02-15 | 914 | 479 | 1048 | 1048 |
| 2020-02-15 | 930 | 479 | 1048 | 1048 |
| 2020-02-15 | 937 | 479 | 1048 | 1048 |
| 2020-02-16 | 932 | 479 | 1048 | 1048 |
| 2020-02-16 | 930 | 479 | 1048 | 1048 |
| 2020-02-16 | 918 | 479 | 1048 | 1048 |
| 2020-02-16 | 908 | 479 | 1048 | 1048 |
| 2020-02-16 | 934 | 479 | 1048 | 1048 |
| 2020-02-16 | 939 | 479 | 1048 | 1048 |
| 2020-02-17 | 932 | 479 | 1048 | 1048 |
| 2020-02-17 | 931 | 479 | 1048 | 1048 |
| 2020-02-17 | 915 | 479 | 1048 | 1048 |
| 2020-02-17 | 905 | 479 | 1048 | 1048 |
| 2020-02-17 | 929 | 479 | 1048 | 1048 |
| 2020-02-17 | 933 | 479 | 1048 | 1048 |
| 2020-02-18 | 932 | 479 | 1048 | 1048 |
| 2020-02-18 | 930 | 479 | 1048 | 1048 |
| 2020-02-18 | 915 | 479 | 1048 | 1048 |
| 2020-02-18 | 913 | 479 | 1048 | 1048 |
| 2020-02-18 | 929 | 479 | 1048 | 1048 |
| 2020-02-18 | 932 | 479 | 1048 | 1048 |
| 2020-02-19 | 931 | 479 | 1048 | 1048 |
| 2020-02-19 | 969 | 479 | 1048 | 1048 |
| 2020-02-19 | 917 | 479 | 1048 | 1048 |
| 2020-02-19 | 918 | 479 | 1048 | 1048 |
| 2020-02-19 | 927 | 479 | 1048 | 1048 |
| 2020-02-19 | 975 | 479 | 1048 | 1048 |
| 2020-02-20 | 515 | 479 | 1048 | 1048 |
| 2020-02-20 | 515 | 479 | 1048 | 1048 |
| 2020-02-20 | 515 | 479 | 1048 | 1048 |
| 2020-02-20 | 515 | 479 | 1048 | 1048 |
| 2020-02-20 | 515 | 479 | 1048 | 1048 |
| 2020-02-20 | 515 | 479 | 1048 | 1048 |
| 2020-02-21 | 930 | 479 | 1048 | 1048 |
| 2020-02-21 | 969 | 479 | 1048 | 1048 |
| 2020-02-21 | 968 | 479 | 1048 | 1048 |
| 2020-02-21 | 910 | 479 | 1048 | 1048 |
| 2020-02-21 | 930 | 479 | 1048 | 1048 |
| 2020-02-21 | 933 | 479 | 1048 | 1048 |
| 2020-02-22 | 931 | 479 | 1048 | 1048 |
| 2020-02-22 | 929 | 479 | 1048 | 1048 |
| 2020-02-22 | 919 | 479 | 1048 | 1048 |
| 2020-02-22 | 905 | 479 | 1048 | 1048 |
| 2020-02-22 | 930 | 479 | 1048 | 1048 |
| 2020-02-22 | 937 | 479 | 1048 | 1048 |
| 2020-02-23 | 932 | 479 | 1048 | 1048 |
| 2020-02-23 | 930 | 479 | 1048 | 1048 |
| 2020-02-23 | 923 | 479 | 1048 | 1048 |
| 2020-02-23 | 916 | 479 | 1048 | 1048 |
| 2020-02-23 | 938 | 479 | 1048 | 1048 |
| 2020-02-23 | 935 | 479 | 1048 | 1048 |
| 2020-02-24 | 974 | 479 | 1040 | 1040 |
| 2020-02-24 | 898 | 479 | 1040 | 1040 |
| 2020-02-24 | 916 | 479 | 1040 | 1040 |
| 2020-02-24 | 914 | 479 | 1040 | 1040 |
| 2020-02-24 | 927 | 479 | 1040 | 1040 |
| 2020-02-24 | 935 | 479 | 1040 | 1040 |
| 2020-02-25 | 933 | 479 | 1040 | 1040 |
| 2020-02-25 | 928 | 479 | 1040 | 1040 |
| 2020-02-25 | 915 | 479 | 1040 | 1040 |
| 2020-02-25 | 916 | 479 | 1040 | 1040 |
| 2020-02-25 | 927 | 479 | 1040 | 1040 |
| 2020-02-25 | 931 | 479 | 1040 | 1040 |
| 2020-02-26 | 929 | 479 | 1040 | 1040 |
| 2020-02-26 | 928 | 479 | 1040 | 1040 |
| 2020-02-26 | 917 | 479 | 1040 | 1040 |
| 2020-02-26 | 916 | 479 | 1040 | 1040 |
| 2020-02-26 | 927 | 479 | 1040 | 1040 |
| 2020-02-26 | 928 | 479 | 1040 | 1040 |
| 2020-02-27 | 890 | 479 | 1040 | 1040 |
| 2020-02-27 | 965 | 479 | 1040 | 1040 |
| 2020-02-27 | 890 | 479 | 1040 | 1040 |
| 2020-02-27 | 890 | 479 | 1040 | 1040 |
| 2020-02-27 | 890 | 479 | 1040 | 1040 |
| 2020-02-27 | 890 | 479 | 1040 | 1040 |
| 2020-02-28 | 926 | 479 | 1040 | 1040 |
| 2020-02-28 | 957 | 479 | 1040 | 1040 |
| 2020-02-28 | 911 | 479 | 1040 | 1040 |
| 2020-02-28 | 913 | 479 | 1040 | 1040 |
| 2020-02-28 | 928 | 479 | 1040 | 1040 |
| 2020-02-28 | 931 | 479 | 1040 | 1040 |
| 2020-02-29 | 890 | 479 | 1040 | 1040 |
| 2020-02-29 | 890 | 479 | 1040 | 1040 |
| 2020-02-29 | 890 | 479 | 1040 | 1040 |
| 2020-02-29 | 890 | 479 | 1040 | 1040 |
| 2020-02-29 | 890 | 479 | 1040 | 1040 |
| 2020-02-29 | 890 | 479 | 1040 | 1040 |
| 2020-03-01 | 932 | 475 | 1040 | 1040 |
| 2020-03-01 | 930 | 475 | 1040 | 1040 |
| 2020-03-01 | 917 | 475 | 1040 | 1040 |
| 2020-03-01 | 906 | 475 | 1040 | 1040 |
| 2020-03-01 | 936 | 475 | 1040 | 1040 |
| 2020-03-01 | 936 | 475 | 1040 | 1040 |
| 2020-03-02 | 982 | 475 | 1050 | 1050 |
| 2020-03-02 | 974 | 475 | 1050 | 1050 |
| 2020-03-02 | 973 | 475 | 1050 | 1050 |
| 2020-03-02 | 893 | 475 | 1050 | 1050 |
| 2020-03-02 | 921 | 475 | 1050 | 1050 |
| 2020-03-02 | 930 | 475 | 1050 | 1050 |
| 2020-03-03 | 893 | 475 | 1050 | 1050 |
| 2020-03-03 | 893 | 475 | 1050 | 1050 |
| 2020-03-03 | 893 | 475 | 1050 | 1050 |
| 2020-03-03 | 893 | 475 | 1050 | 1050 |
| 2020-03-03 | 893 | 475 | 1050 | 1050 |
| 2020-03-03 | 968 | 475 | 1050 | 1050 |
| 2020-03-04 | 968 | 475 | 1050 | 1050 |
| 2020-03-04 | 968 | 475 | 1050 | 1050 |
| 2020-03-04 | 968 | 475 | 1050 | 1050 |
| 2020-03-04 | 968 | 475 | 1050 | 1050 |
| 2020-03-04 | 968 | 475 | 1050 | 1050 |
| 2020-03-04 | 968 | 475 | 1050 | 1050 |
| 2020-03-05 | 931 | 475 | 1050 | 1050 |
| 2020-03-05 | 962 | 475 | 1050 | 1050 |
| 2020-03-05 | 968 | 475 | 1050 | 1050 |
| 2020-03-05 | 970 | 475 | 1050 | 1050 |
| 2020-03-05 | 974 | 475 | 1050 | 1050 |
| 2020-03-05 | 938 | 475 | 1050 | 1050 |
| 2020-03-06 | 934 | 475 | 1050 | 1050 |
| 2020-03-06 | 970 | 475 | 1050 | 1050 |
| 2020-03-06 | 972 | 475 | 1050 | 1050 |
| 2020-03-06 | 917 | 475 | 1050 | 1050 |
| 2020-03-06 | 893 | 475 | 1050 | 1050 |
| 2020-03-06 | 883 | 475 | 1050 | 1050 |
| 2020-03-07 | 911 | 475 | 1050 | 1050 |
| 2020-03-07 | 910 | 475 | 1050 | 1050 |
| 2020-03-07 | 919 | 475 | 1050 | 1050 |
| 2020-03-07 | 920 | 475 | 1050 | 1050 |
| 2020-03-07 | 933 | 475 | 1050 | 1050 |
| 2020-03-07 | 940 | 475 | 1050 | 1050 |
| 2020-03-08 | 936 | 475 | 1050 | 1050 |
| 2020-03-08 | 936 | 475 | 1050 | 1050 |
| 2020-03-08 | 921 | 475 | 1050 | 1050 |
| 2020-03-08 | 916 | 475 | 1050 | 1050 |
| 2020-03-08 | 939 | 475 | 1050 | 1050 |
| 2020-03-08 | 940 | 475 | 1050 | 1050 |
| 2020-03-09 | 931 | 475 | 1048 | 1048 |
| 2020-03-09 | 970 | 475 | 1048 | 1048 |
| 2020-03-09 | 969 | 475 | 1048 | 1048 |
| 2020-03-09 | 916 | 475 | 1048 | 1048 |
| 2020-03-09 | 968 | 475 | 1048 | 1048 |
| 2020-03-09 | 938 | 475 | 1048 | 1048 |
| 2020-03-10 | 933 | 475 | 1048 | 1048 |
| 2020-03-10 | 930 | 475 | 1048 | 1048 |
| 2020-03-10 | 917 | 475 | 1048 | 1048 |
| 2020-03-10 | 916 | 475 | 1048 | 1048 |
| 2020-03-10 | 933 | 475 | 1048 | 1048 |
| 2020-03-10 | 940 | 475 | 1048 | 1048 |
| 2020-03-11 | 940 | 475 | 1048 | 1048 |
| 2020-03-11 | 928 | 475 | 1048 | 1048 |
| 2020-03-11 | 917 | 475 | 1048 | 1048 |
| 2020-03-11 | 918 | 475 | 1048 | 1048 |
| 2020-03-11 | 937 | 475 | 1048 | 1048 |
| 2020-03-11 | 940 | 475 | 1048 | 1048 |
| 2020-03-12 | 938 | 475 | 1048 | 1048 |
| 2020-03-12 | 931 | 475 | 1048 | 1048 |
| 2020-03-12 | 916 | 475 | 1048 | 1048 |
| 2020-03-12 | 902 | 475 | 1048 | 1048 |
| 2020-03-12 | 933 | 475 | 1048 | 1048 |
| 2020-03-12 | 936 | 475 | 1048 | 1048 |
| 2020-03-13 | 933 | 475 | 1048 | 1048 |
| 2020-03-13 | 932 | 475 | 1048 | 1048 |
| 2020-03-13 | 920 | 475 | 1048 | 1048 |
| 2020-03-13 | 971 | 475 | 1048 | 1048 |
| 2020-03-13 | 955 | 475 | 1048 | 1048 |
| 2020-03-13 | 967 | 475 | 1048 | 1048 |
| 2020-03-14 | 968 | 475 | 1048 | 1048 |
| 2020-03-14 | 975 | 475 | 1048 | 1048 |
| 2020-03-14 | 914 | 475 | 1048 | 1048 |
| 2020-03-14 | 909 | 475 | 1048 | 1048 |
| 2020-03-14 | 941 | 475 | 1048 | 1048 |
| 2020-03-14 | 940 | 475 | 1048 | 1048 |
| 2020-03-15 | 930 | 475 | 1048 | 1048 |
| 2020-03-15 | 930 | 475 | 1048 | 1048 |
| 2020-03-15 | 919 | 475 | 1048 | 1048 |
| 2020-03-15 | 909 | 475 | 1048 | 1048 |
| 2020-03-15 | 936 | 475 | 1048 | 1048 |
| 2020-03-15 | 972 | 475 | 1048 | 1048 |
| 2020-03-16 | 976 | 475 | 1048 | 1048 |
| 2020-03-16 | 976 | 475 | 1048 | 1048 |
| 2020-03-16 | 972 | 475 | 1048 | 1048 |
| 2020-03-16 | 973 | 475 | 1048 | 1048 |
| 2020-03-16 | 954 | 475 | 1048 | 1048 |
| 2020-03-16 | 966 | 475 | 1048 | 1048 |
| 2020-03-17 | 906 | 475 | 1048 | 1048 |
| 2020-03-17 | 906 | 475 | 1048 | 1048 |
| 2020-03-17 | 921 | 475 | 1048 | 1048 |
| 2020-03-17 | 922 | 475 | 1048 | 1048 |
| 2020-03-17 | 929 | 475 | 1048 | 1048 |
| 2020-03-17 | 978 | 475 | 1048 | 1048 |
| 2020-03-18 | 934 | 475 | 1048 | 1048 |
| 2020-03-18 | 970 | 475 | 1048 | 1048 |
| 2020-03-18 | 972 | 475 | 1048 | 1048 |
| 2020-03-18 | 922 | 475 | 1048 | 1048 |
| 2020-03-18 | 933 | 475 | 1048 | 1048 |
| 2020-03-18 | 934 | 475 | 1048 | 1048 |
| 2020-03-19 | 968 | 475 | 1048 | 1048 |
| 2020-03-19 | 976 | 475 | 1048 | 1048 |
| 2020-03-19 | 970 | 475 | 1048 | 1048 |
| 2020-03-19 | 912 | 475 | 1048 | 1048 |
| 2020-03-19 | 952 | 475 | 1048 | 1048 |
| 2020-03-19 | 977 | 475 | 1048 | 1048 |
| 2020-03-20 | 975 | 475 | 1048 | 1048 |
| 2020-03-20 | 927 | 475 | 1048 | 1048 |
| 2020-03-20 | 914 | 475 | 1048 | 1048 |
| 2020-03-20 | 902 | 475 | 1048 | 1048 |
| 2020-03-20 | 933 | 475 | 1048 | 1048 |
| 2020-03-20 | 937 | 475 | 1048 | 1048 |
| 2020-03-21 | 932 | 475 | 1048 | 1048 |
| 2020-03-21 | 931 | 475 | 1048 | 1048 |
| 2020-03-21 | 919 | 475 | 1048 | 1048 |
| 2020-03-21 | 917 | 475 | 1048 | 1048 |
| 2020-03-21 | 934 | 475 | 1048 | 1048 |
| 2020-03-21 | 938 | 475 | 1048 | 1048 |
| 2020-03-22 | 932 | 475 | 1048 | 1048 |
| 2020-03-22 | 932 | 475 | 1048 | 1048 |
| 2020-03-22 | 917 | 475 | 1048 | 1048 |
| 2020-03-22 | 907 | 475 | 1048 | 1048 |
| 2020-03-22 | 938 | 475 | 1048 | 1048 |
| 2020-03-22 | 932 | 475 | 1048 | 1048 |
| 2020-03-23 | 923 | 475 | 1033 | 1033 |
| 2020-03-23 | 922 | 475 | 1033 | 1033 |
| 2020-03-23 | 963 | 475 | 1033 | 1033 |
| 2020-03-23 | 916 | 475 | 1033 | 1033 |
| 2020-03-23 | 925 | 475 | 1033 | 1033 |
| 2020-03-23 | 970 | 475 | 1033 | 1033 |
| 2020-03-24 | 924 | 475 | 1033 | 1033 |
| 2020-03-24 | 964 | 475 | 1033 | 1033 |
| 2020-03-24 | 911 | 475 | 1033 | 1033 |
| 2020-03-24 | 914 | 475 | 1033 | 1033 |
| 2020-03-24 | 917 | 475 | 1033 | 1033 |
| 2020-03-24 | 879 | 475 | 1033 | 1033 |
| 2020-03-25 | 971 | 475 | 1033 | 1033 |
| 2020-03-25 | 972 | 475 | 1033 | 1033 |
| 2020-03-25 | 910 | 475 | 1033 | 1033 |
| 2020-03-25 | 914 | 475 | 1033 | 1033 |
| 2020-03-25 | 873 | 475 | 1033 | 1033 |
| 2020-03-25 | 960 | 475 | 1033 | 1033 |
| 2020-03-26 | 969 | 475 | 1033 | 1033 |
| 2020-03-26 | 969 | 475 | 1033 | 1033 |
| 2020-03-26 | 966 | 475 | 1033 | 1033 |
| 2020-03-26 | 968 | 475 | 1033 | 1033 |
| 2020-03-26 | 948 | 475 | 1033 | 1033 |
| 2020-03-26 | 969 | 475 | 1033 | 1033 |
| 2020-03-27 | 972 | 475 | 1033 | 1033 |
| 2020-03-27 | 972 | 475 | 1033 | 1033 |
| 2020-03-27 | 966 | 475 | 1033 | 1033 |
| 2020-03-27 | 967 | 475 | 1033 | 1033 |
| 2020-03-27 | 956 | 475 | 1033 | 1033 |
| 2020-03-27 | 974 | 475 | 1033 | 1033 |
| 2020-03-28 | 922 | 475 | 1033 | 1033 |
| 2020-03-28 | 973 | 475 | 1033 | 1033 |
| 2020-03-28 | 965 | 475 | 1033 | 1033 |
| 2020-03-28 | 966 | 475 | 1033 | 1033 |
| 2020-03-28 | 959 | 475 | 1033 | 1033 |
| 2020-03-28 | 974 | 475 | 1033 | 1033 |
| 2020-03-29 | 924 | 475 | 1033 | 1033 |
| 2020-03-29 | 924 | 475 | 1033 | 1033 |
| 2020-03-29 | 916 | 475 | 1033 | 1033 |
| 2020-03-29 | 905 | 475 | 1033 | 1033 |
| 2020-03-29 | 932 | 475 | 1033 | 1033 |
| 2020-03-29 | 928 | 475 | 1033 | 1033 |
| 2020-03-30 | 934 | 475 | 1051 | 1051 |
| 2020-03-30 | 978 | 475 | 1051 | 1051 |
| 2020-03-30 | 973 | 475 | 1051 | 1051 |
| 2020-03-30 | 976 | 475 | 1051 | 1051 |
| 2020-03-30 | 958 | 475 | 1051 | 1051 |
| 2020-03-30 | 980 | 475 | 1051 | 1051 |
| 2020-03-31 | 979 | 475 | 1051 | 1051 |
| 2020-03-31 | 978 | 475 | 1051 | 1051 |
| 2020-03-31 | 975 | 475 | 1051 | 1051 |
| 2020-03-31 | 976 | 475 | 1051 | 1051 |
| 2020-03-31 | 956 | 475 | 1051 | 1051 |
| 2020-03-31 | 970 | 475 | 1051 | 1051 |
| 2020-04-01 | 979 | 478 | 1051 | 1051 |
| 2020-04-01 | 978 | 478 | 1051 | 1051 |
| 2020-04-01 | 976 | 478 | 1051 | 1051 |
| 2020-04-01 | 976 | 478 | 1051 | 1051 |
| 2020-04-01 | 972 | 478 | 1051 | 1051 |
| 2020-04-01 | 975 | 478 | 1051 | 1051 |
| 2020-04-02 | 979 | 478 | 1051 | 1051 |
| 2020-04-02 | 979 | 478 | 1051 | 1051 |
| 2020-04-02 | 975 | 478 | 1051 | 1051 |
| 2020-04-02 | 974 | 478 | 1051 | 1051 |
| 2020-04-02 | 965 | 478 | 1051 | 1051 |
| 2020-04-02 | 982 | 478 | 1051 | 1051 |
| 2020-04-03 | 977 | 478 | 1051 | 1051 |
| 2020-04-03 | 978 | 478 | 1051 | 1051 |
| 2020-04-03 | 972 | 478 | 1051 | 1051 |
| 2020-04-03 | 975 | 478 | 1051 | 1051 |
| 2020-04-03 | 972 | 478 | 1051 | 1051 |
| 2020-04-03 | 970 | 478 | 1051 | 1051 |
| 2020-04-04 | 979 | 478 | 1051 | 1051 |
| 2020-04-04 | 979 | 478 | 1051 | 1051 |
| 2020-04-04 | 975 | 478 | 1051 | 1051 |
| 2020-04-04 | 919 | 478 | 1051 | 1051 |
| 2020-04-04 | 961 | 478 | 1051 | 1051 |
| 2020-04-04 | 976 | 478 | 1051 | 1051 |
| 2020-04-05 | 978 | 478 | 1051 | 1051 |
| 2020-04-05 | 982 | 478 | 1051 | 1051 |
| 2020-04-05 | 922 | 478 | 1051 | 1051 |
| 2020-04-05 | 920 | 478 | 1051 | 1051 |
| 2020-04-05 | 912 | 478 | 1051 | 1051 |
| 2020-04-05 | 982 | 478 | 1051 | 1051 |
| 2020-04-06 | 929 | 478 | 1044 | 1044 |
| 2020-04-06 | 928 | 478 | 1044 | 1044 |
| 2020-04-06 | 971 | 478 | 1044 | 1044 |
| 2020-04-06 | 971 | 478 | 1044 | 1044 |
| 2020-04-06 | 955 | 478 | 1044 | 1044 |
| 2020-04-06 | 965 | 478 | 1044 | 1044 |
| 2020-04-07 | 896 | 478 | 1044 | 1044 |
| 2020-04-07 | 974 | 478 | 1044 | 1044 |
| 2020-04-07 | 968 | 478 | 1044 | 1044 |
| 2020-04-07 | 912 | 478 | 1044 | 1044 |
| 2020-04-07 | 946 | 478 | 1044 | 1044 |
| 2020-04-07 | 964 | 478 | 1044 | 1044 |
| 2020-04-08 | 973 | 478 | 1044 | 1044 |
| 2020-04-08 | 973 | 478 | 1044 | 1044 |
| 2020-04-08 | 969 | 478 | 1044 | 1044 |
| 2020-04-08 | 970 | 478 | 1044 | 1044 |
| 2020-04-08 | 965 | 478 | 1044 | 1044 |
| 2020-04-08 | 964 | 478 | 1044 | 1044 |
| 2020-04-09 | 965 | 478 | 1044 | 1044 |
| 2020-04-09 | 965 | 478 | 1044 | 1044 |
| 2020-04-09 | 965 | 478 | 1044 | 1044 |
| 2020-04-09 | 965 | 478 | 1044 | 1044 |
| 2020-04-09 | 965 | 478 | 1044 | 1044 |
| 2020-04-09 | 965 | 478 | 1044 | 1044 |
| 2020-04-10 | 967 | 478 | 1044 | 1044 |
| 2020-04-10 | 973 | 478 | 1044 | 1044 |
| 2020-04-10 | 970 | 478 | 1044 | 1044 |
| 2020-04-10 | 970 | 478 | 1044 | 1044 |
| 2020-04-10 | 949 | 478 | 1044 | 1044 |
| 2020-04-10 | 969 | 478 | 1044 | 1044 |
| 2020-04-11 | 968 | 478 | 1044 | 1044 |
| 2020-04-11 | 973 | 478 | 1044 | 1044 |
| 2020-04-11 | 912 | 478 | 1044 | 1044 |
| 2020-04-11 | 914 | 478 | 1044 | 1044 |
| 2020-04-11 | 898 | 478 | 1044 | 1044 |
| 2020-04-11 | 965 | 478 | 1044 | 1044 |
| 2020-04-12 | 973 | 478 | 1044 | 1044 |
| 2020-04-12 | 974 | 478 | 1044 | 1044 |
| 2020-04-12 | 911 | 478 | 1044 | 1044 |
| 2020-04-12 | 912 | 478 | 1044 | 1044 |
| 2020-04-12 | 948 | 478 | 1044 | 1044 |
| 2020-04-12 | 965 | 478 | 1044 | 1044 |
| 2020-04-13 | 965 | 478 | 1038 | 1038 |
| 2020-04-13 | 928 | 478 | 1038 | 1038 |
| 2020-04-13 | 927 | 478 | 1038 | 1038 |
| 2020-04-13 | 916 | 478 | 1038 | 1038 |
| 2020-04-13 | 908 | 478 | 1038 | 1038 |
| 2020-04-13 | 935 | 478 | 1038 | 1038 |
| 2020-04-14 | 906 | 478 | 1038 | 1038 |
| 2020-04-14 | 974 | 478 | 1038 | 1038 |
| 2020-04-14 | 911 | 478 | 1038 | 1038 |
| 2020-04-14 | 916 | 478 | 1038 | 1038 |
| 2020-04-14 | 951 | 478 | 1038 | 1038 |
| 2020-04-14 | 965 | 478 | 1038 | 1038 |
| 2020-04-15 | 973 | 478 | 1038 | 1038 |
| 2020-04-15 | 974 | 478 | 1038 | 1038 |
| 2020-04-15 | 913 | 478 | 1038 | 1038 |
| 2020-04-15 | 915 | 478 | 1038 | 1038 |
| 2020-04-15 | 945 | 478 | 1038 | 1038 |
| 2020-04-15 | 966 | 478 | 1038 | 1038 |
| 2020-04-16 | 973 | 478 | 1038 | 1038 |
| 2020-04-16 | 974 | 478 | 1038 | 1038 |
| 2020-04-16 | 912 | 478 | 1038 | 1038 |
| 2020-04-16 | 914 | 478 | 1038 | 1038 |
| 2020-04-16 | 946 | 478 | 1038 | 1038 |
| 2020-04-16 | 968 | 478 | 1038 | 1038 |
| 2020-04-17 | 972 | 478 | 1038 | 1038 |
| 2020-04-17 | 976 | 478 | 1038 | 1038 |
| 2020-04-17 | 917 | 478 | 1038 | 1038 |
| 2020-04-17 | 917 | 478 | 1038 | 1038 |
| 2020-04-17 | 897 | 478 | 1038 | 1038 |
| 2020-04-17 | 968 | 478 | 1038 | 1038 |
| 2020-04-18 | 929 | 478 | 1038 | 1038 |
| 2020-04-18 | 973 | 478 | 1038 | 1038 |
| 2020-04-18 | 891 | 478 | 1038 | 1038 |
| 2020-04-18 | 967 | 478 | 1038 | 1038 |
| 2020-04-18 | 965 | 478 | 1038 | 1038 |
| 2020-04-18 | 877 | 478 | 1038 | 1038 |
| 2020-04-19 | 894 | 478 | 1038 | 1038 |
| 2020-04-19 | 973 | 478 | 1038 | 1038 |
| 2020-04-19 | 910 | 478 | 1038 | 1038 |
| 2020-04-19 | 915 | 478 | 1038 | 1038 |
| 2020-04-19 | 902 | 478 | 1038 | 1038 |
| 2020-04-19 | 976 | 478 | 1038 | 1038 |
| 2020-04-20 | 932 | 478 | 1038 | 1038 |
| 2020-04-20 | 978 | 478 | 1038 | 1038 |
| 2020-04-20 | 924 | 478 | 1038 | 1038 |
| 2020-04-20 | 918 | 478 | 1038 | 1038 |
| 2020-04-20 | 906 | 478 | 1038 | 1038 |
| 2020-04-20 | 940 | 478 | 1038 | 1038 |
| 2020-04-21 | 930 | 478 | 1038 | 1038 |
| 2020-04-21 | 930 | 478 | 1038 | 1038 |
| 2020-04-21 | 916 | 478 | 1038 | 1038 |
| 2020-04-21 | 918 | 478 | 1038 | 1038 |
| 2020-04-21 | 904 | 478 | 1038 | 1038 |
| 2020-04-21 | 939 | 478 | 1038 | 1038 |
| 2020-04-22 | 930 | 478 | 1038 | 1038 |
| 2020-04-22 | 929 | 478 | 1038 | 1038 |
| 2020-04-22 | 917 | 478 | 1038 | 1038 |
| 2020-04-22 | 918 | 478 | 1038 | 1038 |
| 2020-04-22 | 905 | 478 | 1038 | 1038 |
| 2020-04-22 | 937 | 478 | 1038 | 1038 |
| 2020-04-23 | 924 | 478 | 1038 | 1038 |
| 2020-04-23 | 925 | 478 | 1038 | 1038 |
| 2020-04-23 | 912 | 478 | 1038 | 1038 |
| 2020-04-23 | 913 | 478 | 1038 | 1038 |
| 2020-04-23 | 945 | 478 | 1038 | 1038 |
| 2020-04-23 | 964 | 478 | 1038 | 1038 |
| 2020-04-24 | 972 | 478 | 1038 | 1038 |
| 2020-04-24 | 973 | 478 | 1038 | 1038 |
| 2020-04-24 | 911 | 478 | 1038 | 1038 |
| 2020-04-24 | 914 | 478 | 1038 | 1038 |
| 2020-04-24 | 946 | 478 | 1038 | 1038 |
| 2020-04-24 | 965 | 478 | 1038 | 1038 |
| 2020-04-25 | 973 | 478 | 1038 | 1038 |
| 2020-04-25 | 974 | 478 | 1038 | 1038 |
| 2020-04-25 | 969 | 478 | 1038 | 1038 |
| 2020-04-25 | 914 | 478 | 1038 | 1038 |
| 2020-04-25 | 902 | 478 | 1038 | 1038 |
| 2020-04-25 | 966 | 478 | 1038 | 1038 |
| 2020-04-26 | 901 | 478 | 1038 | 1038 |
| 2020-04-26 | 903 | 478 | 1038 | 1038 |
| 2020-04-26 | 913 | 478 | 1038 | 1038 |
| 2020-04-26 | 915 | 478 | 1038 | 1038 |
| 2020-04-26 | 947 | 478 | 1038 | 1038 |
| 2020-04-26 | 965 | 478 | 1038 | 1038 |
| 2020-04-27 | 973 | 478 | 1038 | 1038 |
| 2020-04-27 | 973 | 478 | 1038 | 1038 |
| 2020-04-27 | 967 | 478 | 1038 | 1038 |
| 2020-04-27 | 970 | 478 | 1038 | 1038 |
| 2020-04-27 | 965 | 478 | 1038 | 1038 |
| 2020-04-27 | 967 | 478 | 1038 | 1038 |
| 2020-04-28 | 971 | 478 | 1038 | 1038 |
| 2020-04-28 | 905 | 478 | 1038 | 1038 |
| 2020-04-28 | 973 | 478 | 1038 | 1038 |
| 2020-04-28 | 969 | 478 | 1038 | 1038 |
| 2020-04-28 | 886 | 478 | 1038 | 1038 |
| 2020-04-28 | 965 | 478 | 1038 | 1038 |
| 2020-04-29 | 973 | 478 | 1038 | 1038 |
| 2020-04-29 | 976 | 478 | 1038 | 1038 |
| 2020-04-29 | 921 | 478 | 1038 | 1038 |
| 2020-04-29 | 908 | 478 | 1038 | 1038 |
| 2020-04-29 | 892 | 478 | 1038 | 1038 |
| 2020-04-29 | 976 | 478 | 1038 | 1038 |
| 2020-04-30 | 927 | 478 | 1038 | 1038 |
| 2020-04-30 | 924 | 478 | 1038 | 1038 |
| 2020-04-30 | 914 | 478 | 1038 | 1038 |
| 2020-04-30 | 917 | 478 | 1038 | 1038 |
| 2020-04-30 | 898 | 478 | 1038 | 1038 |
| 2020-04-30 | 975 | 478 | 1038 | 1038 |
| 2020-05-01 | 891 | 469 | 1038 | 1038 |
| 2020-05-01 | 891 | 469 | 1038 | 1038 |
| 2020-05-01 | 891 | 469 | 1038 | 1038 |
| 2020-05-01 | 891 | 469 | 1038 | 1038 |
| 2020-05-01 | 891 | 469 | 1038 | 1038 |
| 2020-05-01 | 965 | 469 | 1038 | 1038 |
| 2020-05-02 | 925 | 469 | 1038 | 1038 |
| 2020-05-02 | 924 | 469 | 1038 | 1038 |
| 2020-05-02 | 971 | 469 | 1038 | 1038 |
| 2020-05-02 | 914 | 469 | 1038 | 1038 |
| 2020-05-02 | 951 | 469 | 1038 | 1038 |
| 2020-05-02 | 966 | 469 | 1038 | 1038 |
| 2020-05-03 | 903 | 469 | 1038 | 1038 |
| 2020-05-03 | 974 | 469 | 1038 | 1038 |
| 2020-05-03 | 911 | 469 | 1038 | 1038 |
| 2020-05-03 | 913 | 469 | 1038 | 1038 |
| 2020-05-03 | 960 | 469 | 1038 | 1038 |
| 2020-05-03 | 965 | 469 | 1038 | 1038 |
| 2020-05-04 | 971 | 469 | 1032 | 1032 |
| 2020-05-04 | 972 | 469 | 1032 | 1032 |
| 2020-05-04 | 971 | 469 | 1032 | 1032 |
| 2020-05-04 | 966 | 469 | 1032 | 1032 |
| 2020-05-04 | 950 | 469 | 1032 | 1032 |
| 2020-05-04 | 975 | 469 | 1032 | 1032 |
| 2020-05-05 | 973 | 469 | 1032 | 1032 |
| 2020-05-05 | 974 | 469 | 1032 | 1032 |
| 2020-05-05 | 970 | 469 | 1032 | 1032 |
| 2020-05-05 | 915 | 469 | 1032 | 1032 |
| 2020-05-05 | 952 | 469 | 1032 | 1032 |
| 2020-05-05 | 975 | 469 | 1032 | 1032 |
| 2020-05-06 | 973 | 469 | 1032 | 1032 |
| 2020-05-06 | 972 | 469 | 1032 | 1032 |
| 2020-05-06 | 911 | 469 | 1032 | 1032 |
| 2020-05-06 | 969 | 469 | 1032 | 1032 |
| 2020-05-06 | 854 | 469 | 1032 | 1032 |
| 2020-05-06 | 963 | 469 | 1032 | 1032 |
| 2020-05-07 | 972 | 469 | 1032 | 1032 |
| 2020-05-07 | 973 | 469 | 1032 | 1032 |
| 2020-05-07 | 969 | 469 | 1032 | 1032 |
| 2020-05-07 | 913 | 469 | 1032 | 1032 |
| 2020-05-07 | 946 | 469 | 1032 | 1032 |
| 2020-05-07 | 964 | 469 | 1032 | 1032 |
| 2020-05-08 | 963 | 469 | 1032 | 1032 |
| 2020-05-08 | 963 | 469 | 1032 | 1032 |
| 2020-05-08 | 963 | 469 | 1032 | 1032 |
| 2020-05-08 | 889 | 469 | 1032 | 1032 |
| 2020-05-08 | 889 | 469 | 1032 | 1032 |
| 2020-05-08 | 889 | 469 | 1032 | 1032 |
| 2020-05-09 | 964 | 469 | 1032 | 1032 |
| 2020-05-09 | 972 | 469 | 1032 | 1032 |
| 2020-05-09 | 969 | 469 | 1032 | 1032 |
| 2020-05-09 | 911 | 469 | 1032 | 1032 |
| 2020-05-09 | 946 | 469 | 1032 | 1032 |
| 2020-05-09 | 895 | 469 | 1032 | 1032 |
| 2020-05-10 | 971 | 469 | 1032 | 1032 |
| 2020-05-10 | 971 | 469 | 1032 | 1032 |
| 2020-05-10 | 911 | 469 | 1032 | 1032 |
| 2020-05-10 | 917 | 469 | 1032 | 1032 |
| 2020-05-10 | 910 | 469 | 1032 | 1032 |
| 2020-05-10 | 933 | 469 | 1032 | 1032 |
| 2020-05-11 | 934 | 469 | 1048 | 1048 |
| 2020-05-11 | 934 | 469 | 1048 | 1048 |
| 2020-05-11 | 930 | 469 | 1048 | 1048 |
| 2020-05-11 | 919 | 469 | 1048 | 1048 |
| 2020-05-11 | 898 | 469 | 1048 | 1048 |
| 2020-05-11 | 938 | 469 | 1048 | 1048 |
| 2020-05-12 | 929 | 469 | 1048 | 1048 |
| 2020-05-12 | 914 | 469 | 1048 | 1048 |
| 2020-05-12 | 917 | 469 | 1048 | 1048 |
| 2020-05-12 | 917 | 469 | 1048 | 1048 |
| 2020-05-12 | 870 | 469 | 1048 | 1048 |
| 2020-05-12 | 970 | 469 | 1048 | 1048 |
| 2020-05-13 | 972 | 469 | 1048 | 1048 |
| 2020-05-13 | 978 | 469 | 1048 | 1048 |
| 2020-05-13 | 974 | 469 | 1048 | 1048 |
| 2020-05-13 | 919 | 469 | 1048 | 1048 |
| 2020-05-13 | 890 | 469 | 1048 | 1048 |
| 2020-05-13 | 936 | 469 | 1048 | 1048 |
| 2020-05-14 | 932 | 469 | 1048 | 1048 |
| 2020-05-14 | 931 | 469 | 1048 | 1048 |
| 2020-05-14 | 924 | 469 | 1048 | 1048 |
| 2020-05-14 | 923 | 469 | 1048 | 1048 |
| 2020-05-14 | 875 | 469 | 1048 | 1048 |
| 2020-05-14 | 938 | 469 | 1048 | 1048 |
| 2020-05-15 | 926 | 469 | 1048 | 1048 |
| 2020-05-15 | 974 | 469 | 1048 | 1048 |
| 2020-05-15 | 921 | 469 | 1048 | 1048 |
| 2020-05-15 | 922 | 469 | 1048 | 1048 |
| 2020-05-15 | 852 | 469 | 1048 | 1048 |
| 2020-05-15 | 968 | 469 | 1048 | 1048 |
| 2020-05-16 | 972 | 469 | 1048 | 1048 |
| 2020-05-16 | 978 | 469 | 1048 | 1048 |
| 2020-05-16 | 974 | 469 | 1048 | 1048 |
| 2020-05-16 | 920 | 469 | 1048 | 1048 |
| 2020-05-16 | 954 | 469 | 1048 | 1048 |
| 2020-05-16 | 971 | 469 | 1048 | 1048 |
| 2020-05-17 | 978 | 469 | 1048 | 1048 |
| 2020-05-17 | 978 | 469 | 1048 | 1048 |
| 2020-05-17 | 919 | 469 | 1048 | 1048 |
| 2020-05-17 | 919 | 469 | 1048 | 1048 |
| 2020-05-17 | 952 | 469 | 1048 | 1048 |
| 2020-05-17 | 969 | 469 | 1048 | 1048 |
| 2020-05-18 | 962 | 469 | 1039 | 1039 |
| 2020-05-18 | 962 | 469 | 1039 | 1039 |
| 2020-05-18 | 889 | 469 | 1039 | 1039 |
| 2020-05-18 | 889 | 469 | 1039 | 1039 |
| 2020-05-18 | 962 | 469 | 1039 | 1039 |
| 2020-05-18 | 962 | 469 | 1039 | 1039 |
| 2020-05-19 | 962 | 469 | 1039 | 1039 |
| 2020-05-19 | 962 | 469 | 1039 | 1039 |
| 2020-05-19 | 962 | 469 | 1039 | 1039 |
| 2020-05-19 | 962 | 469 | 1039 | 1039 |
| 2020-05-19 | 962 | 469 | 1039 | 1039 |
| 2020-05-19 | 962 | 469 | 1039 | 1039 |
| 2020-05-20 | 962 | 469 | 1039 | 1039 |
| 2020-05-20 | 962 | 469 | 1039 | 1039 |
| 2020-05-20 | 962 | 469 | 1039 | 1039 |
| 2020-05-20 | 889 | 469 | 1039 | 1039 |
| 2020-05-20 | 962 | 469 | 1039 | 1039 |
| 2020-05-20 | 962 | 469 | 1039 | 1039 |
| 2020-05-21 | 962 | 469 | 1039 | 1039 |
| 2020-05-21 | 889 | 469 | 1039 | 1039 |
| 2020-05-21 | 889 | 469 | 1039 | 1039 |
| 2020-05-21 | 889 | 469 | 1039 | 1039 |
| 2020-05-21 | 962 | 469 | 1039 | 1039 |
| 2020-05-21 | 962 | 469 | 1039 | 1039 |
| 2020-05-22 | 914 | 469 | 1039 | 1039 |
| 2020-05-22 | 970 | 469 | 1039 | 1039 |
| 2020-05-22 | 978 | 469 | 1039 | 1039 |
| 2020-05-22 | 922 | 469 | 1039 | 1039 |
| 2020-05-22 | 900 | 469 | 1039 | 1039 |
| 2020-05-22 | 931 | 469 | 1039 | 1039 |
| 2020-05-23 | 890 | 469 | 1039 | 1039 |
| 2020-05-23 | 963 | 469 | 1039 | 1039 |
| 2020-05-23 | 890 | 469 | 1039 | 1039 |
| 2020-05-23 | 890 | 469 | 1039 | 1039 |
| 2020-05-23 | 890 | 469 | 1039 | 1039 |
| 2020-05-23 | 890 | 469 | 1039 | 1039 |
| 2020-05-24 | 890 | 469 | 1039 | 1039 |
| 2020-05-24 | 890 | 469 | 1039 | 1039 |
| 2020-05-24 | 890 | 469 | 1039 | 1039 |
| 2020-05-24 | 890 | 469 | 1039 | 1039 |
| 2020-05-24 | 890 | 469 | 1039 | 1039 |
| 2020-05-24 | 890 | 469 | 1039 | 1039 |
| 2020-05-25 | 889 | 469 | 1039 | 1039 |
| 2020-05-25 | 889 | 469 | 1039 | 1039 |
| 2020-05-25 | 889 | 469 | 1039 | 1039 |
| 2020-05-25 | 889 | 469 | 1039 | 1039 |
| 2020-05-25 | 889 | 469 | 1039 | 1039 |
| 2020-05-25 | 962 | 469 | 1039 | 1039 |
| 2020-05-26 | 962 | 469 | 1039 | 1039 |
| 2020-05-26 | 962 | 469 | 1039 | 1039 |
| 2020-05-26 | 889 | 469 | 1039 | 1039 |
| 2020-05-26 | 889 | 469 | 1039 | 1039 |
| 2020-05-26 | 962 | 469 | 1039 | 1039 |
| 2020-05-26 | 962 | 469 | 1039 | 1039 |
| 2020-05-27 | 962 | 469 | 1039 | 1039 |
| 2020-05-27 | 962 | 469 | 1039 | 1039 |
| 2020-05-27 | 962 | 469 | 1039 | 1039 |
| 2020-05-27 | 962 | 469 | 1039 | 1039 |
| 2020-05-27 | 962 | 469 | 1039 | 1039 |
| 2020-05-27 | 962 | 469 | 1039 | 1039 |
| 2020-05-28 | 889 | 469 | 1039 | 1039 |
| 2020-05-28 | 962 | 469 | 1039 | 1039 |
| 2020-05-28 | 962 | 469 | 1039 | 1039 |
| 2020-05-28 | 889 | 469 | 1039 | 1039 |
| 2020-05-28 | 889 | 469 | 1039 | 1039 |
| 2020-05-28 | 962 | 469 | 1039 | 1039 |
| 2020-05-29 | 890 | 469 | 1039 | 1039 |
| 2020-05-29 | 963 | 469 | 1039 | 1039 |
| 2020-05-29 | 963 | 469 | 1039 | 1039 |
| 2020-05-29 | 890 | 469 | 1039 | 1039 |
| 2020-05-29 | 890 | 469 | 1039 | 1039 |
| 2020-05-29 | 890 | 469 | 1039 | 1039 |
| 2020-05-30 | 892 | 469 | 1039 | 1039 |
| 2020-05-30 | 908 | 469 | 1039 | 1039 |
| 2020-05-30 | 942 | 469 | 1039 | 1039 |
| 2020-05-30 | 943 | 469 | 1039 | 1039 |
| 2020-05-30 | 906 | 469 | 1039 | 1039 |
| 2020-05-30 | 927 | 469 | 1039 | 1039 |
| 2020-05-31 | 892 | 469 | 1039 | 1039 |
| 2020-05-31 | 908 | 469 | 1039 | 1039 |
| 2020-05-31 | 942 | 469 | 1039 | 1039 |
| 2020-05-31 | 943 | 469 | 1039 | 1039 |
| 2020-05-31 | 906 | 469 | 1039 | 1039 |
| 2020-05-31 | 927 | 469 | 1039 | 1039 |